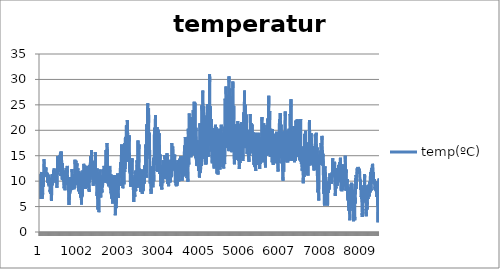
| Category | temp(ºC) |
|---|---|
| 0 | 6.5 |
| 1 | 6.7 |
| 2 | 6.9 |
| 3 | 7.2 |
| 4 | 7.3 |
| 5 | 7.4 |
| 6 | 7.5 |
| 7 | 7.7 |
| 8 | 8 |
| 9 | 8.4 |
| 10 | 9 |
| 11 | 9.5 |
| 12 | 9.8 |
| 13 | 10.3 |
| 14 | 10.5 |
| 15 | 10.8 |
| 16 | 11 |
| 17 | 10.9 |
| 18 | 11 |
| 19 | 10.7 |
| 20 | 10.5 |
| 21 | 10.3 |
| 22 | 10.4 |
| 23 | 11.4 |
| 24 | 10.3 |
| 25 | 10.7 |
| 26 | 11.2 |
| 27 | 11 |
| 28 | 10.6 |
| 29 | 10.7 |
| 30 | 10.8 |
| 31 | 10.9 |
| 32 | 10.8 |
| 33 | 10.8 |
| 34 | 11.6 |
| 35 | 11.6 |
| 36 | 11.6 |
| 37 | 11.8 |
| 38 | 11.9 |
| 39 | 11.9 |
| 40 | 11.1 |
| 41 | 11.4 |
| 42 | 11.4 |
| 43 | 10.6 |
| 44 | 9.6 |
| 45 | 9.7 |
| 46 | 10.5 |
| 47 | 10.6 |
| 48 | 6.7 |
| 49 | 6.6 |
| 50 | 6.8 |
| 51 | 6.5 |
| 52 | 6.5 |
| 53 | 6.5 |
| 54 | 6.5 |
| 55 | 6.8 |
| 56 | 6.9 |
| 57 | 6.9 |
| 58 | 7.2 |
| 59 | 7.4 |
| 60 | 7.5 |
| 61 | 7.6 |
| 62 | 7.5 |
| 63 | 7.3 |
| 64 | 6.9 |
| 65 | 7.6 |
| 66 | 8.1 |
| 67 | 8.6 |
| 68 | 8.9 |
| 69 | 9.1 |
| 70 | 9.6 |
| 71 | 10.5 |
| 72 | 10.3 |
| 73 | 10.6 |
| 74 | 11.1 |
| 75 | 11 |
| 76 | 10.8 |
| 77 | 10.2 |
| 78 | 9.8 |
| 79 | 9.8 |
| 80 | 10.3 |
| 81 | 10 |
| 82 | 8.9 |
| 83 | 9.9 |
| 84 | 9.5 |
| 85 | 9.5 |
| 86 | 9.7 |
| 87 | 10 |
| 88 | 10.5 |
| 89 | 10.8 |
| 90 | 11 |
| 91 | 11.1 |
| 92 | 11.2 |
| 93 | 11.2 |
| 94 | 11.1 |
| 95 | 11.3 |
| 96 | 13.6 |
| 97 | 13.6 |
| 98 | 14.1 |
| 99 | 14.3 |
| 100 | 14.3 |
| 101 | 14.1 |
| 102 | 13.8 |
| 103 | 13.7 |
| 104 | 13.5 |
| 105 | 13.3 |
| 106 | 13.1 |
| 107 | 12.9 |
| 108 | 12.9 |
| 109 | 12.6 |
| 110 | 12.5 |
| 111 | 12.7 |
| 112 | 12.8 |
| 113 | 12.8 |
| 114 | 12.8 |
| 115 | 12.7 |
| 116 | 12.6 |
| 117 | 12.5 |
| 118 | 12.5 |
| 119 | 12.4 |
| 120 | 11.9 |
| 121 | 12.7 |
| 122 | 12.7 |
| 123 | 12.1 |
| 124 | 11.4 |
| 125 | 11.4 |
| 126 | 11.7 |
| 127 | 11.7 |
| 128 | 11.8 |
| 129 | 11.6 |
| 130 | 11.4 |
| 131 | 11.4 |
| 132 | 11.5 |
| 133 | 11.3 |
| 134 | 11.7 |
| 135 | 11.7 |
| 136 | 11.5 |
| 137 | 11.7 |
| 138 | 11.6 |
| 139 | 11.3 |
| 140 | 11.1 |
| 141 | 11.2 |
| 142 | 10.9 |
| 143 | 10.8 |
| 144 | 11.9 |
| 145 | 12.7 |
| 146 | 12.7 |
| 147 | 12.1 |
| 148 | 11.4 |
| 149 | 11.4 |
| 150 | 11.7 |
| 151 | 11.7 |
| 152 | 11.8 |
| 153 | 11.6 |
| 154 | 11.4 |
| 155 | 11.4 |
| 156 | 11.5 |
| 157 | 11.3 |
| 158 | 11.7 |
| 159 | 11.7 |
| 160 | 11.5 |
| 161 | 11.7 |
| 162 | 11.6 |
| 163 | 11.3 |
| 164 | 11 |
| 165 | 11.1 |
| 166 | 10.9 |
| 167 | 10.8 |
| 168 | 11.7 |
| 169 | 11.7 |
| 170 | 11.5 |
| 171 | 11.2 |
| 172 | 10.9 |
| 173 | 11 |
| 174 | 11.1 |
| 175 | 11.3 |
| 176 | 11.5 |
| 177 | 11.5 |
| 178 | 11.5 |
| 179 | 11.5 |
| 180 | 11.4 |
| 181 | 11.4 |
| 182 | 11.4 |
| 183 | 11.4 |
| 184 | 11.2 |
| 185 | 10.9 |
| 186 | 10.7 |
| 187 | 10.3 |
| 188 | 9.9 |
| 189 | 9.8 |
| 190 | 9.7 |
| 191 | 9.8 |
| 192 | 11.4 |
| 193 | 11.5 |
| 194 | 11.2 |
| 195 | 11.3 |
| 196 | 11.1 |
| 197 | 11.2 |
| 198 | 11.1 |
| 199 | 11 |
| 200 | 11.1 |
| 201 | 10.9 |
| 202 | 10.8 |
| 203 | 10.5 |
| 204 | 10.8 |
| 205 | 10.8 |
| 206 | 10.5 |
| 207 | 10.5 |
| 208 | 10.3 |
| 209 | 9.7 |
| 210 | 9.9 |
| 211 | 9.5 |
| 212 | 9.3 |
| 213 | 9.5 |
| 214 | 9.9 |
| 215 | 11.2 |
| 216 | 10.1 |
| 217 | 9.9 |
| 218 | 9.6 |
| 219 | 9.4 |
| 220 | 9.3 |
| 221 | 9.4 |
| 222 | 9.2 |
| 223 | 9.3 |
| 224 | 9.2 |
| 225 | 9 |
| 226 | 9.1 |
| 227 | 9.3 |
| 228 | 9.4 |
| 229 | 9.7 |
| 230 | 9.9 |
| 231 | 9.7 |
| 232 | 9.6 |
| 233 | 9.3 |
| 234 | 9.3 |
| 235 | 9.4 |
| 236 | 10 |
| 237 | 10 |
| 238 | 10.2 |
| 239 | 10.6 |
| 240 | 10.6 |
| 241 | 10.5 |
| 242 | 10 |
| 243 | 9.7 |
| 244 | 9.6 |
| 245 | 9.6 |
| 246 | 9.5 |
| 247 | 8.8 |
| 248 | 8.4 |
| 249 | 8.3 |
| 250 | 8.1 |
| 251 | 8.3 |
| 252 | 7.8 |
| 253 | 8 |
| 254 | 8.1 |
| 255 | 8.2 |
| 256 | 8.1 |
| 257 | 7.8 |
| 258 | 7.5 |
| 259 | 7.7 |
| 260 | 8.1 |
| 261 | 8.3 |
| 262 | 8.6 |
| 263 | 9.2 |
| 264 | 8.7 |
| 265 | 9.1 |
| 266 | 9.4 |
| 267 | 9.6 |
| 268 | 9.4 |
| 269 | 9.1 |
| 270 | 8.9 |
| 271 | 8.6 |
| 272 | 8.3 |
| 273 | 7.8 |
| 274 | 7.7 |
| 275 | 7.9 |
| 276 | 7.8 |
| 277 | 7.7 |
| 278 | 7.3 |
| 279 | 6.8 |
| 280 | 6.5 |
| 281 | 6.3 |
| 282 | 6.2 |
| 283 | 6.1 |
| 284 | 6.1 |
| 285 | 6.2 |
| 286 | 6.2 |
| 287 | 6.6 |
| 288 | 7.5 |
| 289 | 8.2 |
| 290 | 9.5 |
| 291 | 10.3 |
| 292 | 10.7 |
| 293 | 10.6 |
| 294 | 10.5 |
| 295 | 10 |
| 296 | 10.4 |
| 297 | 10.6 |
| 298 | 10.9 |
| 299 | 11.2 |
| 300 | 11.3 |
| 301 | 11.4 |
| 302 | 10.7 |
| 303 | 9.9 |
| 304 | 10.3 |
| 305 | 10.2 |
| 306 | 10.5 |
| 307 | 10.5 |
| 308 | 10.1 |
| 309 | 10.1 |
| 310 | 9.2 |
| 311 | 9.4 |
| 312 | 10.6 |
| 313 | 11 |
| 314 | 10.1 |
| 315 | 10.8 |
| 316 | 11.2 |
| 317 | 10.9 |
| 318 | 10.7 |
| 319 | 10.2 |
| 320 | 10.3 |
| 321 | 10.3 |
| 322 | 10.1 |
| 323 | 10.2 |
| 324 | 9.7 |
| 325 | 9.7 |
| 326 | 10.5 |
| 327 | 10.8 |
| 328 | 10.8 |
| 329 | 10.6 |
| 330 | 10.6 |
| 331 | 10.7 |
| 332 | 10.8 |
| 333 | 11.2 |
| 334 | 11.2 |
| 335 | 12.1 |
| 336 | 10.8 |
| 337 | 10.7 |
| 338 | 11 |
| 339 | 11.3 |
| 340 | 11.5 |
| 341 | 11.8 |
| 342 | 11.8 |
| 343 | 11.9 |
| 344 | 12 |
| 345 | 12 |
| 346 | 12.1 |
| 347 | 12.3 |
| 348 | 12.3 |
| 349 | 12.4 |
| 350 | 12.5 |
| 351 | 12.2 |
| 352 | 12 |
| 353 | 11.7 |
| 354 | 11.4 |
| 355 | 11.2 |
| 356 | 11.1 |
| 357 | 10.9 |
| 358 | 11 |
| 359 | 10.9 |
| 360 | 11.4 |
| 361 | 11.4 |
| 362 | 11 |
| 363 | 10.8 |
| 364 | 10.6 |
| 365 | 10.2 |
| 366 | 10.8 |
| 367 | 10.4 |
| 368 | 10.9 |
| 369 | 10.8 |
| 370 | 10.7 |
| 371 | 10.8 |
| 372 | 10.7 |
| 373 | 10.7 |
| 374 | 10.9 |
| 375 | 11 |
| 376 | 10.9 |
| 377 | 10.9 |
| 378 | 11 |
| 379 | 11 |
| 380 | 11.1 |
| 381 | 11.3 |
| 382 | 11.5 |
| 383 | 11.8 |
| 384 | 10.9 |
| 385 | 11.6 |
| 386 | 12.1 |
| 387 | 12 |
| 388 | 11.9 |
| 389 | 11.2 |
| 390 | 11.6 |
| 391 | 11.5 |
| 392 | 11.3 |
| 393 | 11.1 |
| 394 | 10.9 |
| 395 | 11.1 |
| 396 | 10.9 |
| 397 | 10.6 |
| 398 | 10.7 |
| 399 | 10.5 |
| 400 | 10.3 |
| 401 | 10.4 |
| 402 | 10.6 |
| 403 | 10 |
| 404 | 9.6 |
| 405 | 9.5 |
| 406 | 9.5 |
| 407 | 9.6 |
| 408 | 9.5 |
| 409 | 10.4 |
| 410 | 11 |
| 411 | 11.2 |
| 412 | 10.9 |
| 413 | 10.2 |
| 414 | 9.7 |
| 415 | 9.6 |
| 416 | 9.2 |
| 417 | 8.9 |
| 418 | 8.7 |
| 419 | 8.8 |
| 420 | 9.1 |
| 421 | 9.2 |
| 422 | 9.2 |
| 423 | 9.2 |
| 424 | 9.3 |
| 425 | 10.2 |
| 426 | 11.4 |
| 427 | 11.9 |
| 428 | 11.5 |
| 429 | 11.3 |
| 430 | 11.8 |
| 431 | 12.4 |
| 432 | 13.2 |
| 433 | 14 |
| 434 | 14.7 |
| 435 | 14.9 |
| 436 | 14.7 |
| 437 | 14.5 |
| 438 | 14.5 |
| 439 | 14.4 |
| 440 | 14.5 |
| 441 | 14.4 |
| 442 | 14.3 |
| 443 | 14.2 |
| 444 | 14.1 |
| 445 | 14 |
| 446 | 13.8 |
| 447 | 13.5 |
| 448 | 13.2 |
| 449 | 12.9 |
| 450 | 12.7 |
| 451 | 12.6 |
| 452 | 12.5 |
| 453 | 12.6 |
| 454 | 12.8 |
| 455 | 13 |
| 456 | 12.7 |
| 457 | 13.6 |
| 458 | 14 |
| 459 | 14.3 |
| 460 | 14.2 |
| 461 | 14 |
| 462 | 13.9 |
| 463 | 13.9 |
| 464 | 14 |
| 465 | 14 |
| 466 | 14 |
| 467 | 14 |
| 468 | 14 |
| 469 | 13.9 |
| 470 | 13.9 |
| 471 | 13.8 |
| 472 | 13.9 |
| 473 | 13.9 |
| 474 | 13.9 |
| 475 | 13.9 |
| 476 | 13.7 |
| 477 | 13.3 |
| 478 | 13.2 |
| 479 | 13.4 |
| 480 | 14.3 |
| 481 | 14.8 |
| 482 | 15.1 |
| 483 | 15 |
| 484 | 14.5 |
| 485 | 13.4 |
| 486 | 12.2 |
| 487 | 12.1 |
| 488 | 12.3 |
| 489 | 12.2 |
| 490 | 12.2 |
| 491 | 12.3 |
| 492 | 12.3 |
| 493 | 12.2 |
| 494 | 12 |
| 495 | 11.9 |
| 496 | 11.8 |
| 497 | 11.8 |
| 498 | 11.7 |
| 499 | 11.7 |
| 500 | 11.8 |
| 501 | 12 |
| 502 | 12.2 |
| 503 | 12.5 |
| 504 | 15.2 |
| 505 | 15.8 |
| 506 | 15.9 |
| 507 | 15.6 |
| 508 | 14.9 |
| 509 | 13.9 |
| 510 | 12.8 |
| 511 | 11.9 |
| 512 | 11.4 |
| 513 | 11 |
| 514 | 11.1 |
| 515 | 11.1 |
| 516 | 11.1 |
| 517 | 11.5 |
| 518 | 12.1 |
| 519 | 12.3 |
| 520 | 12.4 |
| 521 | 12.7 |
| 522 | 12.6 |
| 523 | 12.4 |
| 524 | 12.6 |
| 525 | 12.7 |
| 526 | 13 |
| 527 | 13.3 |
| 528 | 14.2 |
| 529 | 14.9 |
| 530 | 15.5 |
| 531 | 15.8 |
| 532 | 15.7 |
| 533 | 15.2 |
| 534 | 14.8 |
| 535 | 14.3 |
| 536 | 13.8 |
| 537 | 13.5 |
| 538 | 13.5 |
| 539 | 13.4 |
| 540 | 13.1 |
| 541 | 12.6 |
| 542 | 12.3 |
| 543 | 12.1 |
| 544 | 11.9 |
| 545 | 11.6 |
| 546 | 11.2 |
| 547 | 10.8 |
| 548 | 10.6 |
| 549 | 10.5 |
| 550 | 10.3 |
| 551 | 10.6 |
| 552 | 12.1 |
| 553 | 12.8 |
| 554 | 13.3 |
| 555 | 13.5 |
| 556 | 13 |
| 557 | 12.5 |
| 558 | 12.3 |
| 559 | 12.4 |
| 560 | 12.4 |
| 561 | 12.5 |
| 562 | 12.4 |
| 563 | 12.1 |
| 564 | 12 |
| 565 | 12 |
| 566 | 11.8 |
| 567 | 11.4 |
| 568 | 11.1 |
| 569 | 10.9 |
| 570 | 10.7 |
| 571 | 10.5 |
| 572 | 10.2 |
| 573 | 10.2 |
| 574 | 10.2 |
| 575 | 10.7 |
| 576 | 11.4 |
| 577 | 11.7 |
| 578 | 11.7 |
| 579 | 11.5 |
| 580 | 11.2 |
| 581 | 10.8 |
| 582 | 10.4 |
| 583 | 10.2 |
| 584 | 10.1 |
| 585 | 10.1 |
| 586 | 9.8 |
| 587 | 9.5 |
| 588 | 9.4 |
| 589 | 9.4 |
| 590 | 9.3 |
| 591 | 9.3 |
| 592 | 9.2 |
| 593 | 9.1 |
| 594 | 9 |
| 595 | 8.8 |
| 596 | 8.6 |
| 597 | 8.6 |
| 598 | 8.6 |
| 599 | 9 |
| 600 | 10.5 |
| 601 | 11.1 |
| 602 | 11.5 |
| 603 | 11.6 |
| 604 | 11.6 |
| 605 | 11 |
| 606 | 10.6 |
| 607 | 10.3 |
| 608 | 10 |
| 609 | 9.9 |
| 610 | 9.6 |
| 611 | 9.5 |
| 612 | 9.4 |
| 613 | 9.4 |
| 614 | 9.3 |
| 615 | 9 |
| 616 | 8.8 |
| 617 | 8.7 |
| 618 | 8.6 |
| 619 | 8.4 |
| 620 | 8.2 |
| 621 | 8.3 |
| 622 | 8.6 |
| 623 | 9 |
| 624 | 10.3 |
| 625 | 11.1 |
| 626 | 11.7 |
| 627 | 12.1 |
| 628 | 12.2 |
| 629 | 12.1 |
| 630 | 11.4 |
| 631 | 10.9 |
| 632 | 10.7 |
| 633 | 10.6 |
| 634 | 10.9 |
| 635 | 11.2 |
| 636 | 11.1 |
| 637 | 10.8 |
| 638 | 10.5 |
| 639 | 10.3 |
| 640 | 10.2 |
| 641 | 10.3 |
| 642 | 10.3 |
| 643 | 10.2 |
| 644 | 10 |
| 645 | 9.9 |
| 646 | 10.1 |
| 647 | 10.7 |
| 648 | 12 |
| 649 | 12.1 |
| 650 | 12.4 |
| 651 | 12.6 |
| 652 | 12.7 |
| 653 | 12 |
| 654 | 11.4 |
| 655 | 11.4 |
| 656 | 10.9 |
| 657 | 10.8 |
| 658 | 11.1 |
| 659 | 11.7 |
| 660 | 12.2 |
| 661 | 11.3 |
| 662 | 11.1 |
| 663 | 11.6 |
| 664 | 11.9 |
| 665 | 11.8 |
| 666 | 11.9 |
| 667 | 12.1 |
| 668 | 12.1 |
| 669 | 11.7 |
| 670 | 11.6 |
| 671 | 11.7 |
| 672 | 11.8 |
| 673 | 12.3 |
| 674 | 12.8 |
| 675 | 13 |
| 676 | 12.6 |
| 677 | 11.9 |
| 678 | 11.1 |
| 679 | 10.2 |
| 680 | 9.7 |
| 681 | 9.3 |
| 682 | 9.5 |
| 683 | 10.1 |
| 684 | 10.3 |
| 685 | 10 |
| 686 | 9.6 |
| 687 | 9.3 |
| 688 | 9.2 |
| 689 | 9.2 |
| 690 | 9.2 |
| 691 | 9.3 |
| 692 | 9.4 |
| 693 | 9.4 |
| 694 | 9.4 |
| 695 | 10 |
| 696 | 9.6 |
| 697 | 10.4 |
| 698 | 10.8 |
| 699 | 10.8 |
| 700 | 10.7 |
| 701 | 10.2 |
| 702 | 9.3 |
| 703 | 8.8 |
| 704 | 8.4 |
| 705 | 8.2 |
| 706 | 8.3 |
| 707 | 8.2 |
| 708 | 8.1 |
| 709 | 7.9 |
| 710 | 7.6 |
| 711 | 7.7 |
| 712 | 7.4 |
| 713 | 7 |
| 714 | 6.6 |
| 715 | 6.2 |
| 716 | 5.9 |
| 717 | 5.5 |
| 718 | 5.3 |
| 719 | 6.8 |
| 720 | 9.2 |
| 721 | 9.4 |
| 722 | 9.1 |
| 723 | 8.3 |
| 724 | 8.3 |
| 725 | 7.9 |
| 726 | 7.1 |
| 727 | 6.7 |
| 728 | 6.4 |
| 729 | 6.4 |
| 730 | 6.3 |
| 731 | 6.3 |
| 732 | 6.5 |
| 733 | 7.1 |
| 734 | 7.8 |
| 735 | 7.9 |
| 736 | 7.8 |
| 737 | 7.6 |
| 738 | 7.7 |
| 739 | 7.7 |
| 740 | 8.3 |
| 741 | 8.2 |
| 742 | 7.9 |
| 743 | 8.8 |
| 744 | 9.7 |
| 745 | 9.9 |
| 746 | 10.1 |
| 747 | 10.4 |
| 748 | 10 |
| 749 | 8.9 |
| 750 | 8.9 |
| 751 | 9.1 |
| 752 | 9 |
| 753 | 9.4 |
| 754 | 9.2 |
| 755 | 9 |
| 756 | 8.6 |
| 757 | 8.6 |
| 758 | 8.7 |
| 759 | 8.4 |
| 760 | 8.8 |
| 761 | 8.7 |
| 762 | 8.6 |
| 763 | 8.7 |
| 764 | 8.2 |
| 765 | 8.1 |
| 766 | 8.6 |
| 767 | 9.2 |
| 768 | 9.8 |
| 769 | 10.5 |
| 770 | 10.8 |
| 771 | 10.8 |
| 772 | 10.5 |
| 773 | 10 |
| 774 | 9.2 |
| 775 | 8.7 |
| 776 | 8.3 |
| 777 | 8.4 |
| 778 | 8.5 |
| 779 | 8.4 |
| 780 | 8.3 |
| 781 | 8.3 |
| 782 | 8.6 |
| 783 | 8.7 |
| 784 | 8.3 |
| 785 | 8.4 |
| 786 | 8.6 |
| 787 | 8.5 |
| 788 | 9 |
| 789 | 9 |
| 790 | 9.4 |
| 791 | 10 |
| 792 | 12.4 |
| 793 | 12.4 |
| 794 | 12.4 |
| 795 | 12.3 |
| 796 | 11.7 |
| 797 | 11.2 |
| 798 | 10.9 |
| 799 | 10.9 |
| 800 | 10.9 |
| 801 | 10.7 |
| 802 | 10.4 |
| 803 | 9.5 |
| 804 | 9.8 |
| 805 | 9.8 |
| 806 | 9.6 |
| 807 | 9.7 |
| 808 | 10.2 |
| 809 | 10.2 |
| 810 | 10.2 |
| 811 | 10.1 |
| 812 | 10.1 |
| 813 | 10.3 |
| 814 | 10.5 |
| 815 | 10.8 |
| 816 | 10.9 |
| 817 | 11.2 |
| 818 | 11.2 |
| 819 | 11.4 |
| 820 | 11.4 |
| 821 | 10.8 |
| 822 | 10.6 |
| 823 | 10.5 |
| 824 | 10 |
| 825 | 10.3 |
| 826 | 10.1 |
| 827 | 10.4 |
| 828 | 10.2 |
| 829 | 10.1 |
| 830 | 9.9 |
| 831 | 9.8 |
| 832 | 10.1 |
| 833 | 10.4 |
| 834 | 10 |
| 835 | 9.7 |
| 836 | 9.2 |
| 837 | 9.2 |
| 838 | 9.5 |
| 839 | 9.6 |
| 840 | 9.9 |
| 841 | 9.5 |
| 842 | 8.7 |
| 843 | 8.4 |
| 844 | 8.8 |
| 845 | 9.3 |
| 846 | 9.7 |
| 847 | 9.8 |
| 848 | 9.7 |
| 849 | 9.8 |
| 850 | 9.6 |
| 851 | 9.4 |
| 852 | 9.3 |
| 853 | 9.5 |
| 854 | 9.4 |
| 855 | 9.4 |
| 856 | 9.3 |
| 857 | 9 |
| 858 | 8.9 |
| 859 | 8.7 |
| 860 | 8.6 |
| 861 | 8.8 |
| 862 | 9.2 |
| 863 | 10 |
| 864 | 11.8 |
| 865 | 12.5 |
| 866 | 13.3 |
| 867 | 14 |
| 868 | 14.2 |
| 869 | 14.1 |
| 870 | 13.3 |
| 871 | 12.6 |
| 872 | 12.1 |
| 873 | 11.8 |
| 874 | 11.9 |
| 875 | 11.9 |
| 876 | 11.6 |
| 877 | 11.2 |
| 878 | 10.9 |
| 879 | 10.6 |
| 880 | 10.3 |
| 881 | 10.2 |
| 882 | 10 |
| 883 | 9.8 |
| 884 | 9.6 |
| 885 | 9.6 |
| 886 | 10 |
| 887 | 11.2 |
| 888 | 11.8 |
| 889 | 12.5 |
| 890 | 13 |
| 891 | 13.6 |
| 892 | 14 |
| 893 | 13.7 |
| 894 | 12.8 |
| 895 | 12.3 |
| 896 | 12.2 |
| 897 | 12.2 |
| 898 | 12.1 |
| 899 | 11.7 |
| 900 | 11.2 |
| 901 | 11 |
| 902 | 10.9 |
| 903 | 10.7 |
| 904 | 10.5 |
| 905 | 10.2 |
| 906 | 10 |
| 907 | 9.8 |
| 908 | 9.7 |
| 909 | 9.7 |
| 910 | 9.9 |
| 911 | 10.8 |
| 912 | 12.5 |
| 913 | 13.1 |
| 914 | 13.3 |
| 915 | 13.5 |
| 916 | 13.5 |
| 917 | 12.9 |
| 918 | 12.2 |
| 919 | 11.8 |
| 920 | 11.8 |
| 921 | 11.8 |
| 922 | 11.6 |
| 923 | 11.4 |
| 924 | 11.1 |
| 925 | 11 |
| 926 | 11.1 |
| 927 | 11.1 |
| 928 | 11.1 |
| 929 | 10.8 |
| 930 | 10.3 |
| 931 | 9.8 |
| 932 | 9.4 |
| 933 | 9.2 |
| 934 | 9.9 |
| 935 | 10.8 |
| 936 | 10.9 |
| 937 | 11.8 |
| 938 | 12.5 |
| 939 | 12.6 |
| 940 | 12.5 |
| 941 | 12.2 |
| 942 | 11.7 |
| 943 | 11.6 |
| 944 | 11.3 |
| 945 | 10.9 |
| 946 | 10.7 |
| 947 | 10.5 |
| 948 | 10.2 |
| 949 | 9.8 |
| 950 | 9.6 |
| 951 | 9.5 |
| 952 | 9.3 |
| 953 | 8.9 |
| 954 | 8.6 |
| 955 | 8.3 |
| 956 | 8 |
| 957 | 8 |
| 958 | 8.6 |
| 959 | 9.4 |
| 960 | 10.1 |
| 961 | 10.9 |
| 962 | 11.5 |
| 963 | 12 |
| 964 | 12 |
| 965 | 11.8 |
| 966 | 11 |
| 967 | 10.4 |
| 968 | 10.1 |
| 969 | 10.2 |
| 970 | 9.8 |
| 971 | 9.4 |
| 972 | 9.2 |
| 973 | 9 |
| 974 | 8.7 |
| 975 | 8.4 |
| 976 | 8.1 |
| 977 | 8 |
| 978 | 7.9 |
| 979 | 7.8 |
| 980 | 7.5 |
| 981 | 7.4 |
| 982 | 7.7 |
| 983 | 8.2 |
| 984 | 9.6 |
| 985 | 10.2 |
| 986 | 10.6 |
| 987 | 11.2 |
| 988 | 11.3 |
| 989 | 11.1 |
| 990 | 10.6 |
| 991 | 10.3 |
| 992 | 10.3 |
| 993 | 10.2 |
| 994 | 10.1 |
| 995 | 10 |
| 996 | 9.7 |
| 997 | 9.5 |
| 998 | 9.2 |
| 999 | 9 |
| 1000 | 8.6 |
| 1001 | 8 |
| 1002 | 7.4 |
| 1003 | 7.1 |
| 1004 | 6.8 |
| 1005 | 6.8 |
| 1006 | 7.5 |
| 1007 | 8.5 |
| 1008 | 9.6 |
| 1009 | 10.2 |
| 1010 | 10.9 |
| 1011 | 11.5 |
| 1012 | 11.7 |
| 1013 | 11.5 |
| 1014 | 10.9 |
| 1015 | 10.1 |
| 1016 | 9.7 |
| 1017 | 9.2 |
| 1018 | 8.9 |
| 1019 | 8.6 |
| 1020 | 8.2 |
| 1021 | 7.8 |
| 1022 | 7.5 |
| 1023 | 7 |
| 1024 | 6.5 |
| 1025 | 6.2 |
| 1026 | 5.9 |
| 1027 | 5.7 |
| 1028 | 5.4 |
| 1029 | 5.5 |
| 1030 | 6.1 |
| 1031 | 6.8 |
| 1032 | 8.4 |
| 1033 | 9.2 |
| 1034 | 9.9 |
| 1035 | 10.5 |
| 1036 | 10.8 |
| 1037 | 10.4 |
| 1038 | 9.5 |
| 1039 | 9 |
| 1040 | 8.7 |
| 1041 | 8.4 |
| 1042 | 8.2 |
| 1043 | 7.9 |
| 1044 | 7.6 |
| 1045 | 7.6 |
| 1046 | 7.4 |
| 1047 | 7.3 |
| 1048 | 7 |
| 1049 | 6.9 |
| 1050 | 7 |
| 1051 | 7 |
| 1052 | 6.9 |
| 1053 | 7 |
| 1054 | 7.6 |
| 1055 | 8.8 |
| 1056 | 9.5 |
| 1057 | 10.2 |
| 1058 | 10.9 |
| 1059 | 11.7 |
| 1060 | 12.1 |
| 1061 | 12.1 |
| 1062 | 11.7 |
| 1063 | 11.3 |
| 1064 | 11.5 |
| 1065 | 10.8 |
| 1066 | 10.2 |
| 1067 | 10.1 |
| 1068 | 10.1 |
| 1069 | 9.9 |
| 1070 | 9.6 |
| 1071 | 9.4 |
| 1072 | 9.2 |
| 1073 | 9 |
| 1074 | 8.9 |
| 1075 | 8.8 |
| 1076 | 8.7 |
| 1077 | 8.8 |
| 1078 | 9.1 |
| 1079 | 9.7 |
| 1080 | 11.2 |
| 1081 | 12 |
| 1082 | 12.6 |
| 1083 | 13.1 |
| 1084 | 13.4 |
| 1085 | 13.5 |
| 1086 | 13.2 |
| 1087 | 12.4 |
| 1088 | 12 |
| 1089 | 12.1 |
| 1090 | 11.6 |
| 1091 | 11 |
| 1092 | 10.8 |
| 1093 | 10.4 |
| 1094 | 10.1 |
| 1095 | 10 |
| 1096 | 9.9 |
| 1097 | 9.7 |
| 1098 | 9.6 |
| 1099 | 9.3 |
| 1100 | 9 |
| 1101 | 9 |
| 1102 | 9.1 |
| 1103 | 9.7 |
| 1104 | 11.1 |
| 1105 | 11.8 |
| 1106 | 12.4 |
| 1107 | 13.1 |
| 1108 | 13.2 |
| 1109 | 12.6 |
| 1110 | 12.3 |
| 1111 | 12 |
| 1112 | 11.8 |
| 1113 | 11.5 |
| 1114 | 11.5 |
| 1115 | 11.3 |
| 1116 | 11 |
| 1117 | 10.7 |
| 1118 | 10.5 |
| 1119 | 10.4 |
| 1120 | 10.1 |
| 1121 | 9.7 |
| 1122 | 9.4 |
| 1123 | 9 |
| 1124 | 8.5 |
| 1125 | 8.4 |
| 1126 | 8.6 |
| 1127 | 9 |
| 1128 | 8.6 |
| 1129 | 8.9 |
| 1130 | 10.1 |
| 1131 | 10.5 |
| 1132 | 10.5 |
| 1133 | 9.8 |
| 1134 | 9.4 |
| 1135 | 9.3 |
| 1136 | 9.2 |
| 1137 | 9.1 |
| 1138 | 9.2 |
| 1139 | 9.1 |
| 1140 | 9.1 |
| 1141 | 9 |
| 1142 | 9.1 |
| 1143 | 9.1 |
| 1144 | 9.2 |
| 1145 | 9.2 |
| 1146 | 9.3 |
| 1147 | 9.7 |
| 1148 | 9.8 |
| 1149 | 9.7 |
| 1150 | 9.7 |
| 1151 | 10.1 |
| 1152 | 11.1 |
| 1153 | 11.8 |
| 1154 | 12.8 |
| 1155 | 13 |
| 1156 | 12.9 |
| 1157 | 12.2 |
| 1158 | 11.7 |
| 1159 | 10.8 |
| 1160 | 10.8 |
| 1161 | 11.1 |
| 1162 | 10.8 |
| 1163 | 10.8 |
| 1164 | 10.7 |
| 1165 | 10.8 |
| 1166 | 10.5 |
| 1167 | 10.5 |
| 1168 | 10.4 |
| 1169 | 10.7 |
| 1170 | 10.6 |
| 1171 | 10.4 |
| 1172 | 10.1 |
| 1173 | 9.9 |
| 1174 | 10.2 |
| 1175 | 10.5 |
| 1176 | 10 |
| 1177 | 10.5 |
| 1178 | 10.7 |
| 1179 | 11 |
| 1180 | 11.2 |
| 1181 | 11.4 |
| 1182 | 11.2 |
| 1183 | 10.9 |
| 1184 | 10.7 |
| 1185 | 10.4 |
| 1186 | 10.6 |
| 1187 | 10.8 |
| 1188 | 10.5 |
| 1189 | 10.4 |
| 1190 | 9.8 |
| 1191 | 9.6 |
| 1192 | 9.4 |
| 1193 | 9.5 |
| 1194 | 9.7 |
| 1195 | 9.7 |
| 1196 | 9.5 |
| 1197 | 9.3 |
| 1198 | 9.5 |
| 1199 | 10.1 |
| 1200 | 8.8 |
| 1201 | 8.9 |
| 1202 | 9 |
| 1203 | 9 |
| 1204 | 9.1 |
| 1205 | 9.1 |
| 1206 | 9.2 |
| 1207 | 9.1 |
| 1208 | 9.2 |
| 1209 | 9.1 |
| 1210 | 8.7 |
| 1211 | 8.4 |
| 1212 | 8.2 |
| 1213 | 8.2 |
| 1214 | 8.3 |
| 1215 | 8.3 |
| 1216 | 8.4 |
| 1217 | 8.1 |
| 1218 | 7.9 |
| 1219 | 7.9 |
| 1220 | 8 |
| 1221 | 8.1 |
| 1222 | 8.3 |
| 1223 | 8.3 |
| 1224 | 11.1 |
| 1225 | 11.2 |
| 1226 | 12.3 |
| 1227 | 12.9 |
| 1228 | 13.2 |
| 1229 | 13.3 |
| 1230 | 13.3 |
| 1231 | 12.6 |
| 1232 | 11.8 |
| 1233 | 12.1 |
| 1234 | 11.8 |
| 1235 | 12.2 |
| 1236 | 11.9 |
| 1237 | 12 |
| 1238 | 12.1 |
| 1239 | 11.8 |
| 1240 | 11.9 |
| 1241 | 12.1 |
| 1242 | 12.1 |
| 1243 | 12 |
| 1244 | 11.9 |
| 1245 | 11.8 |
| 1246 | 11.7 |
| 1247 | 12.8 |
| 1248 | 13.9 |
| 1249 | 14.4 |
| 1250 | 14.9 |
| 1251 | 14.6 |
| 1252 | 13.8 |
| 1253 | 12.7 |
| 1254 | 11.8 |
| 1255 | 11.2 |
| 1256 | 11 |
| 1257 | 11.2 |
| 1258 | 11.2 |
| 1259 | 10.8 |
| 1260 | 10.7 |
| 1261 | 10.8 |
| 1262 | 11.3 |
| 1263 | 11.5 |
| 1264 | 11.2 |
| 1265 | 11 |
| 1266 | 11 |
| 1267 | 10.9 |
| 1268 | 11.1 |
| 1269 | 11.1 |
| 1270 | 11.7 |
| 1271 | 12.3 |
| 1272 | 14.6 |
| 1273 | 15.3 |
| 1274 | 15.9 |
| 1275 | 16.1 |
| 1276 | 16.2 |
| 1277 | 15.1 |
| 1278 | 12.7 |
| 1279 | 11.7 |
| 1280 | 11.3 |
| 1281 | 10.8 |
| 1282 | 10.8 |
| 1283 | 11.2 |
| 1284 | 11.3 |
| 1285 | 11.4 |
| 1286 | 11.5 |
| 1287 | 11.4 |
| 1288 | 11.6 |
| 1289 | 11.7 |
| 1290 | 11.9 |
| 1291 | 11.7 |
| 1292 | 11.7 |
| 1293 | 12.1 |
| 1294 | 12.6 |
| 1295 | 13.6 |
| 1296 | 10.9 |
| 1297 | 11.2 |
| 1298 | 11.7 |
| 1299 | 11.8 |
| 1300 | 12.1 |
| 1301 | 12.1 |
| 1302 | 11.7 |
| 1303 | 11.2 |
| 1304 | 10.9 |
| 1305 | 10.8 |
| 1306 | 10.6 |
| 1307 | 10.5 |
| 1308 | 10.5 |
| 1309 | 10.3 |
| 1310 | 10.4 |
| 1311 | 10.3 |
| 1312 | 11 |
| 1313 | 10.6 |
| 1314 | 9.8 |
| 1315 | 9.6 |
| 1316 | 9.3 |
| 1317 | 9.2 |
| 1318 | 9.1 |
| 1319 | 9.4 |
| 1320 | 11.8 |
| 1321 | 12.6 |
| 1322 | 12.7 |
| 1323 | 12.5 |
| 1324 | 12.7 |
| 1325 | 12.1 |
| 1326 | 11.3 |
| 1327 | 11.1 |
| 1328 | 10.9 |
| 1329 | 10.5 |
| 1330 | 10.4 |
| 1331 | 10 |
| 1332 | 9.7 |
| 1333 | 9.6 |
| 1334 | 9.7 |
| 1335 | 9.8 |
| 1336 | 9.9 |
| 1337 | 10.1 |
| 1338 | 10.2 |
| 1339 | 10.2 |
| 1340 | 10 |
| 1341 | 9.9 |
| 1342 | 10.5 |
| 1343 | 11.5 |
| 1344 | 12.6 |
| 1345 | 13 |
| 1346 | 13.5 |
| 1347 | 14 |
| 1348 | 14.1 |
| 1349 | 13 |
| 1350 | 11.8 |
| 1351 | 11.1 |
| 1352 | 11 |
| 1353 | 10.8 |
| 1354 | 10.5 |
| 1355 | 10.3 |
| 1356 | 10.2 |
| 1357 | 10.1 |
| 1358 | 9.8 |
| 1359 | 9.6 |
| 1360 | 9.6 |
| 1361 | 9.8 |
| 1362 | 10.1 |
| 1363 | 10.4 |
| 1364 | 10.1 |
| 1365 | 10 |
| 1366 | 11.1 |
| 1367 | 13.1 |
| 1368 | 14.9 |
| 1369 | 15.4 |
| 1370 | 15.7 |
| 1371 | 15.8 |
| 1372 | 15.4 |
| 1373 | 14.1 |
| 1374 | 12.3 |
| 1375 | 11.2 |
| 1376 | 10.8 |
| 1377 | 10.7 |
| 1378 | 10.9 |
| 1379 | 11.5 |
| 1380 | 12.3 |
| 1381 | 12.2 |
| 1382 | 11.7 |
| 1383 | 11.4 |
| 1384 | 11.4 |
| 1385 | 11.4 |
| 1386 | 10.9 |
| 1387 | 10.2 |
| 1388 | 9.6 |
| 1389 | 9.4 |
| 1390 | 9.9 |
| 1391 | 11 |
| 1392 | 11.1 |
| 1393 | 11.8 |
| 1394 | 12.4 |
| 1395 | 12.5 |
| 1396 | 12.3 |
| 1397 | 12.3 |
| 1398 | 11.9 |
| 1399 | 11.6 |
| 1400 | 11.2 |
| 1401 | 10.7 |
| 1402 | 10.2 |
| 1403 | 9.9 |
| 1404 | 9.7 |
| 1405 | 9.5 |
| 1406 | 9.3 |
| 1407 | 9.4 |
| 1408 | 9.3 |
| 1409 | 8.9 |
| 1410 | 8.1 |
| 1411 | 7.3 |
| 1412 | 7.1 |
| 1413 | 7.9 |
| 1414 | 8.9 |
| 1415 | 9.3 |
| 1416 | 11.3 |
| 1417 | 11.8 |
| 1418 | 12.2 |
| 1419 | 12.5 |
| 1420 | 12.4 |
| 1421 | 12 |
| 1422 | 10.9 |
| 1423 | 9.4 |
| 1424 | 8.1 |
| 1425 | 7.3 |
| 1426 | 6.8 |
| 1427 | 6.5 |
| 1428 | 6.3 |
| 1429 | 6 |
| 1430 | 5.7 |
| 1431 | 5.3 |
| 1432 | 5 |
| 1433 | 4.8 |
| 1434 | 4.4 |
| 1435 | 4.3 |
| 1436 | 4.5 |
| 1437 | 5 |
| 1438 | 5.8 |
| 1439 | 6.6 |
| 1440 | 7.7 |
| 1441 | 8.7 |
| 1442 | 9.5 |
| 1443 | 9.8 |
| 1444 | 9.9 |
| 1445 | 9.6 |
| 1446 | 8.9 |
| 1447 | 8.1 |
| 1448 | 7.6 |
| 1449 | 7.3 |
| 1450 | 7 |
| 1451 | 6.7 |
| 1452 | 6.3 |
| 1453 | 5.9 |
| 1454 | 5.3 |
| 1455 | 4.8 |
| 1456 | 4.4 |
| 1457 | 4.1 |
| 1458 | 3.9 |
| 1459 | 3.9 |
| 1460 | 3.8 |
| 1461 | 4.1 |
| 1462 | 4.8 |
| 1463 | 5.6 |
| 1464 | 7.1 |
| 1465 | 8.3 |
| 1466 | 9.4 |
| 1467 | 10.3 |
| 1468 | 10.7 |
| 1469 | 10.4 |
| 1470 | 9.5 |
| 1471 | 9.3 |
| 1472 | 8.6 |
| 1473 | 8.1 |
| 1474 | 8 |
| 1475 | 8.5 |
| 1476 | 8.7 |
| 1477 | 8.7 |
| 1478 | 8.3 |
| 1479 | 7.9 |
| 1480 | 7.8 |
| 1481 | 7.9 |
| 1482 | 8.1 |
| 1483 | 8.4 |
| 1484 | 8.3 |
| 1485 | 8 |
| 1486 | 8.8 |
| 1487 | 10 |
| 1488 | 11.3 |
| 1489 | 12 |
| 1490 | 12.3 |
| 1491 | 12 |
| 1492 | 11.3 |
| 1493 | 10.7 |
| 1494 | 9.8 |
| 1495 | 9.3 |
| 1496 | 9.1 |
| 1497 | 9 |
| 1498 | 8.6 |
| 1499 | 8.3 |
| 1500 | 8.1 |
| 1501 | 7.9 |
| 1502 | 7.5 |
| 1503 | 7.3 |
| 1504 | 7.1 |
| 1505 | 7.1 |
| 1506 | 6.8 |
| 1507 | 7.4 |
| 1508 | 7.4 |
| 1509 | 7.4 |
| 1510 | 7.7 |
| 1511 | 9.3 |
| 1512 | 10.7 |
| 1513 | 10.8 |
| 1514 | 11.1 |
| 1515 | 10.6 |
| 1516 | 10.7 |
| 1517 | 9.5 |
| 1518 | 9.3 |
| 1519 | 9.1 |
| 1520 | 8.7 |
| 1521 | 8.4 |
| 1522 | 8.6 |
| 1523 | 8.5 |
| 1524 | 8.6 |
| 1525 | 8.4 |
| 1526 | 8.2 |
| 1527 | 8.3 |
| 1528 | 8.4 |
| 1529 | 7.8 |
| 1530 | 7.9 |
| 1531 | 8.1 |
| 1532 | 7.8 |
| 1533 | 8 |
| 1534 | 9.4 |
| 1535 | 10.4 |
| 1536 | 10.3 |
| 1537 | 9.5 |
| 1538 | 9.4 |
| 1539 | 9.8 |
| 1540 | 10.2 |
| 1541 | 9.8 |
| 1542 | 9.4 |
| 1543 | 9.1 |
| 1544 | 8.9 |
| 1545 | 9.1 |
| 1546 | 9.3 |
| 1547 | 8.8 |
| 1548 | 9.1 |
| 1549 | 8.9 |
| 1550 | 9 |
| 1551 | 9.1 |
| 1552 | 9.4 |
| 1553 | 9.3 |
| 1554 | 9.6 |
| 1555 | 9.6 |
| 1556 | 9.6 |
| 1557 | 9.6 |
| 1558 | 9.6 |
| 1559 | 10 |
| 1560 | 10.4 |
| 1561 | 10.9 |
| 1562 | 11.4 |
| 1563 | 12 |
| 1564 | 12.2 |
| 1565 | 11.9 |
| 1566 | 11.8 |
| 1567 | 11.7 |
| 1568 | 11.8 |
| 1569 | 11.9 |
| 1570 | 12 |
| 1571 | 12.1 |
| 1572 | 12.1 |
| 1573 | 12.2 |
| 1574 | 12.2 |
| 1575 | 12.3 |
| 1576 | 12.2 |
| 1577 | 12.2 |
| 1578 | 12.1 |
| 1579 | 12.1 |
| 1580 | 12.1 |
| 1581 | 12.2 |
| 1582 | 12.2 |
| 1583 | 12.3 |
| 1584 | 12.7 |
| 1585 | 12.8 |
| 1586 | 13 |
| 1587 | 12.9 |
| 1588 | 12.8 |
| 1589 | 12.6 |
| 1590 | 12.4 |
| 1591 | 12.4 |
| 1592 | 12.4 |
| 1593 | 12.4 |
| 1594 | 12.4 |
| 1595 | 12.3 |
| 1596 | 12.5 |
| 1597 | 12.5 |
| 1598 | 12.5 |
| 1599 | 12.6 |
| 1600 | 12.5 |
| 1601 | 12.2 |
| 1602 | 12.2 |
| 1603 | 12.1 |
| 1604 | 11.8 |
| 1605 | 11.5 |
| 1606 | 11.4 |
| 1607 | 12.1 |
| 1608 | 11.9 |
| 1609 | 12.7 |
| 1610 | 13 |
| 1611 | 12.8 |
| 1612 | 12.5 |
| 1613 | 12.2 |
| 1614 | 11.6 |
| 1615 | 10.8 |
| 1616 | 10.3 |
| 1617 | 10 |
| 1618 | 9.7 |
| 1619 | 9.6 |
| 1620 | 9.7 |
| 1621 | 9.6 |
| 1622 | 9.6 |
| 1623 | 9.8 |
| 1624 | 10 |
| 1625 | 10.4 |
| 1626 | 10.8 |
| 1627 | 11.3 |
| 1628 | 11.9 |
| 1629 | 11.9 |
| 1630 | 12.3 |
| 1631 | 12.8 |
| 1632 | 14.2 |
| 1633 | 15 |
| 1634 | 15.7 |
| 1635 | 16.1 |
| 1636 | 16.2 |
| 1637 | 15.9 |
| 1638 | 13.8 |
| 1639 | 12.8 |
| 1640 | 13.2 |
| 1641 | 14 |
| 1642 | 14.9 |
| 1643 | 15.6 |
| 1644 | 16 |
| 1645 | 16 |
| 1646 | 15.9 |
| 1647 | 15.7 |
| 1648 | 15.5 |
| 1649 | 15.1 |
| 1650 | 14.9 |
| 1651 | 14.8 |
| 1652 | 14.5 |
| 1653 | 14.2 |
| 1654 | 14.3 |
| 1655 | 14.6 |
| 1656 | 15 |
| 1657 | 15.9 |
| 1658 | 16.8 |
| 1659 | 17.5 |
| 1660 | 17.5 |
| 1661 | 17.3 |
| 1662 | 17.4 |
| 1663 | 16.6 |
| 1664 | 15.6 |
| 1665 | 15.7 |
| 1666 | 16.1 |
| 1667 | 16.3 |
| 1668 | 16 |
| 1669 | 15.6 |
| 1670 | 14.7 |
| 1671 | 13.8 |
| 1672 | 13.1 |
| 1673 | 12.5 |
| 1674 | 12.1 |
| 1675 | 11.7 |
| 1676 | 11.2 |
| 1677 | 10.8 |
| 1678 | 11.2 |
| 1679 | 12.2 |
| 1680 | 11 |
| 1681 | 11.1 |
| 1682 | 11 |
| 1683 | 10.4 |
| 1684 | 10.2 |
| 1685 | 10 |
| 1686 | 10.1 |
| 1687 | 9.8 |
| 1688 | 9.7 |
| 1689 | 9.7 |
| 1690 | 9.4 |
| 1691 | 9.5 |
| 1692 | 9.4 |
| 1693 | 9.6 |
| 1694 | 9.6 |
| 1695 | 9.8 |
| 1696 | 9.6 |
| 1697 | 9.5 |
| 1698 | 9.2 |
| 1699 | 9 |
| 1700 | 9.6 |
| 1701 | 9.9 |
| 1702 | 10.5 |
| 1703 | 10.8 |
| 1704 | 11.5 |
| 1705 | 12 |
| 1706 | 12.3 |
| 1707 | 11.8 |
| 1708 | 11.5 |
| 1709 | 11 |
| 1710 | 10.6 |
| 1711 | 10.3 |
| 1712 | 10.2 |
| 1713 | 10.3 |
| 1714 | 10.3 |
| 1715 | 10.3 |
| 1716 | 10.2 |
| 1717 | 10.1 |
| 1718 | 10.1 |
| 1719 | 10.1 |
| 1720 | 10.2 |
| 1721 | 10.1 |
| 1722 | 10.1 |
| 1723 | 10.3 |
| 1724 | 10.3 |
| 1725 | 10.2 |
| 1726 | 10.6 |
| 1727 | 11.1 |
| 1728 | 11.6 |
| 1729 | 12.8 |
| 1730 | 13 |
| 1731 | 11.9 |
| 1732 | 11.6 |
| 1733 | 11 |
| 1734 | 10.4 |
| 1735 | 10.2 |
| 1736 | 9.7 |
| 1737 | 9.4 |
| 1738 | 9.3 |
| 1739 | 9.3 |
| 1740 | 8.8 |
| 1741 | 9 |
| 1742 | 9.1 |
| 1743 | 9 |
| 1744 | 8.6 |
| 1745 | 8.6 |
| 1746 | 8.6 |
| 1747 | 8.3 |
| 1748 | 8.5 |
| 1749 | 9.3 |
| 1750 | 9.8 |
| 1751 | 9.2 |
| 1752 | 11.4 |
| 1753 | 11.3 |
| 1754 | 9.2 |
| 1755 | 10.3 |
| 1756 | 10.2 |
| 1757 | 9.9 |
| 1758 | 9.4 |
| 1759 | 8.8 |
| 1760 | 8.2 |
| 1761 | 7.6 |
| 1762 | 7.5 |
| 1763 | 8.4 |
| 1764 | 8.1 |
| 1765 | 7.7 |
| 1766 | 7.5 |
| 1767 | 7.5 |
| 1768 | 7.5 |
| 1769 | 7.3 |
| 1770 | 7.1 |
| 1771 | 7 |
| 1772 | 7.2 |
| 1773 | 7.3 |
| 1774 | 7 |
| 1775 | 7.7 |
| 1776 | 6.6 |
| 1777 | 7.2 |
| 1778 | 7.5 |
| 1779 | 7.6 |
| 1780 | 7.8 |
| 1781 | 7.7 |
| 1782 | 7.5 |
| 1783 | 7.5 |
| 1784 | 7.6 |
| 1785 | 7.5 |
| 1786 | 7.6 |
| 1787 | 7.6 |
| 1788 | 7.6 |
| 1789 | 7.7 |
| 1790 | 7.7 |
| 1791 | 7.5 |
| 1792 | 7 |
| 1793 | 6.3 |
| 1794 | 6.2 |
| 1795 | 5.8 |
| 1796 | 5.6 |
| 1797 | 5.7 |
| 1798 | 6.3 |
| 1799 | 7.9 |
| 1800 | 8.8 |
| 1801 | 10.1 |
| 1802 | 10.9 |
| 1803 | 11.1 |
| 1804 | 10.9 |
| 1805 | 10.5 |
| 1806 | 9.8 |
| 1807 | 8.7 |
| 1808 | 7.9 |
| 1809 | 7.6 |
| 1810 | 7.8 |
| 1811 | 7.7 |
| 1812 | 7 |
| 1813 | 5.9 |
| 1814 | 6.5 |
| 1815 | 7.1 |
| 1816 | 7.2 |
| 1817 | 6.7 |
| 1818 | 6.6 |
| 1819 | 7.1 |
| 1820 | 6.3 |
| 1821 | 6 |
| 1822 | 7.1 |
| 1823 | 8.2 |
| 1824 | 10.3 |
| 1825 | 10.6 |
| 1826 | 11.1 |
| 1827 | 10.9 |
| 1828 | 9.9 |
| 1829 | 9.4 |
| 1830 | 8.9 |
| 1831 | 8.4 |
| 1832 | 7.9 |
| 1833 | 7.6 |
| 1834 | 7.2 |
| 1835 | 6.9 |
| 1836 | 6.8 |
| 1837 | 6.9 |
| 1838 | 6.9 |
| 1839 | 7.1 |
| 1840 | 7.1 |
| 1841 | 7.1 |
| 1842 | 7.2 |
| 1843 | 7.6 |
| 1844 | 7.8 |
| 1845 | 8.2 |
| 1846 | 9.2 |
| 1847 | 10.1 |
| 1848 | 9.9 |
| 1849 | 10.3 |
| 1850 | 11.2 |
| 1851 | 10.7 |
| 1852 | 10 |
| 1853 | 9.3 |
| 1854 | 8.8 |
| 1855 | 8.1 |
| 1856 | 8.1 |
| 1857 | 7.9 |
| 1858 | 7.2 |
| 1859 | 6.7 |
| 1860 | 5.9 |
| 1861 | 5.6 |
| 1862 | 5 |
| 1863 | 4.6 |
| 1864 | 4.1 |
| 1865 | 3.7 |
| 1866 | 3.3 |
| 1867 | 3.2 |
| 1868 | 3.7 |
| 1869 | 4.9 |
| 1870 | 5.8 |
| 1871 | 6.7 |
| 1872 | 6.7 |
| 1873 | 7.3 |
| 1874 | 7.7 |
| 1875 | 8 |
| 1876 | 7.9 |
| 1877 | 7.8 |
| 1878 | 7.4 |
| 1879 | 7 |
| 1880 | 6.8 |
| 1881 | 6.3 |
| 1882 | 6 |
| 1883 | 5.3 |
| 1884 | 5 |
| 1885 | 4.7 |
| 1886 | 4.7 |
| 1887 | 5.1 |
| 1888 | 4.8 |
| 1889 | 5 |
| 1890 | 5.1 |
| 1891 | 5.2 |
| 1892 | 5.6 |
| 1893 | 5.9 |
| 1894 | 7.1 |
| 1895 | 7.7 |
| 1896 | 10.1 |
| 1897 | 10.5 |
| 1898 | 10.4 |
| 1899 | 10.1 |
| 1900 | 10 |
| 1901 | 9.8 |
| 1902 | 9.5 |
| 1903 | 8.9 |
| 1904 | 8.2 |
| 1905 | 8.1 |
| 1906 | 8 |
| 1907 | 7.8 |
| 1908 | 7.5 |
| 1909 | 7.1 |
| 1910 | 7 |
| 1911 | 6.9 |
| 1912 | 6.8 |
| 1913 | 6.8 |
| 1914 | 6.8 |
| 1915 | 6.9 |
| 1916 | 6.7 |
| 1917 | 7.8 |
| 1918 | 8.7 |
| 1919 | 9.2 |
| 1920 | 9.9 |
| 1921 | 10.8 |
| 1922 | 11.5 |
| 1923 | 10.9 |
| 1924 | 10.5 |
| 1925 | 10.3 |
| 1926 | 9.8 |
| 1927 | 9.2 |
| 1928 | 8.7 |
| 1929 | 8.5 |
| 1930 | 8.4 |
| 1931 | 8.3 |
| 1932 | 7.9 |
| 1933 | 7.8 |
| 1934 | 7.5 |
| 1935 | 7.4 |
| 1936 | 7.3 |
| 1937 | 6.9 |
| 1938 | 6.7 |
| 1939 | 6.6 |
| 1940 | 6.6 |
| 1941 | 7.6 |
| 1942 | 9 |
| 1943 | 9.9 |
| 1944 | 11.3 |
| 1945 | 11.3 |
| 1946 | 11.3 |
| 1947 | 11.2 |
| 1948 | 10.7 |
| 1949 | 10.4 |
| 1950 | 9.8 |
| 1951 | 9.6 |
| 1952 | 9.5 |
| 1953 | 9.6 |
| 1954 | 9.7 |
| 1955 | 9.8 |
| 1956 | 9.8 |
| 1957 | 9.8 |
| 1958 | 9.4 |
| 1959 | 9.1 |
| 1960 | 9.4 |
| 1961 | 9.7 |
| 1962 | 9.9 |
| 1963 | 10.1 |
| 1964 | 10.6 |
| 1965 | 10.9 |
| 1966 | 11 |
| 1967 | 11.2 |
| 1968 | 11.3 |
| 1969 | 11.6 |
| 1970 | 11.7 |
| 1971 | 11.6 |
| 1972 | 11.6 |
| 1973 | 11.3 |
| 1974 | 11.1 |
| 1975 | 11 |
| 1976 | 11 |
| 1977 | 11.1 |
| 1978 | 11.1 |
| 1979 | 11.1 |
| 1980 | 11 |
| 1981 | 11.2 |
| 1982 | 11.1 |
| 1983 | 11.2 |
| 1984 | 11.2 |
| 1985 | 11.2 |
| 1986 | 11.1 |
| 1987 | 11 |
| 1988 | 10.7 |
| 1989 | 11.4 |
| 1990 | 12.3 |
| 1991 | 12.6 |
| 1992 | 12.5 |
| 1993 | 13 |
| 1994 | 13.5 |
| 1995 | 13.7 |
| 1996 | 13.5 |
| 1997 | 12.9 |
| 1998 | 12.3 |
| 1999 | 11.6 |
| 2000 | 11 |
| 2001 | 10.8 |
| 2002 | 10.8 |
| 2003 | 10.8 |
| 2004 | 10.7 |
| 2005 | 11.1 |
| 2006 | 11.1 |
| 2007 | 11.2 |
| 2008 | 11.5 |
| 2009 | 11.6 |
| 2010 | 11.5 |
| 2011 | 11.4 |
| 2012 | 11.7 |
| 2013 | 12 |
| 2014 | 13.6 |
| 2015 | 14.8 |
| 2016 | 15.2 |
| 2017 | 16.2 |
| 2018 | 17 |
| 2019 | 17.2 |
| 2020 | 15.8 |
| 2021 | 12.9 |
| 2022 | 11.6 |
| 2023 | 10.5 |
| 2024 | 9.8 |
| 2025 | 9.6 |
| 2026 | 9.3 |
| 2027 | 9.1 |
| 2028 | 9.3 |
| 2029 | 9.3 |
| 2030 | 9.1 |
| 2031 | 9.1 |
| 2032 | 9.5 |
| 2033 | 9.8 |
| 2034 | 9.7 |
| 2035 | 9.3 |
| 2036 | 9.3 |
| 2037 | 9.4 |
| 2038 | 9.7 |
| 2039 | 11.6 |
| 2040 | 11.2 |
| 2041 | 10.8 |
| 2042 | 10.8 |
| 2043 | 10.6 |
| 2044 | 10.5 |
| 2045 | 10.3 |
| 2046 | 9.9 |
| 2047 | 9.6 |
| 2048 | 9.1 |
| 2049 | 8.9 |
| 2050 | 8.8 |
| 2051 | 8.6 |
| 2052 | 8.6 |
| 2053 | 8.7 |
| 2054 | 8.7 |
| 2055 | 8.7 |
| 2056 | 8.8 |
| 2057 | 9.1 |
| 2058 | 9.3 |
| 2059 | 9.5 |
| 2060 | 9.4 |
| 2061 | 9.6 |
| 2062 | 10.4 |
| 2063 | 11.2 |
| 2064 | 11.6 |
| 2065 | 12.1 |
| 2066 | 12.2 |
| 2067 | 12 |
| 2068 | 11.8 |
| 2069 | 11.4 |
| 2070 | 10.8 |
| 2071 | 10.3 |
| 2072 | 10.2 |
| 2073 | 10.2 |
| 2074 | 10.2 |
| 2075 | 10.1 |
| 2076 | 10.1 |
| 2077 | 10.1 |
| 2078 | 10.1 |
| 2079 | 9.8 |
| 2080 | 9.4 |
| 2081 | 9.4 |
| 2082 | 9.4 |
| 2083 | 9.5 |
| 2084 | 9.6 |
| 2085 | 9.8 |
| 2086 | 10.2 |
| 2087 | 11.1 |
| 2088 | 14.7 |
| 2089 | 16.2 |
| 2090 | 17.1 |
| 2091 | 17.5 |
| 2092 | 17.6 |
| 2093 | 17.4 |
| 2094 | 15.9 |
| 2095 | 12.8 |
| 2096 | 12.1 |
| 2097 | 12 |
| 2098 | 11.8 |
| 2099 | 12.7 |
| 2100 | 13.4 |
| 2101 | 14.2 |
| 2102 | 14.8 |
| 2103 | 14.5 |
| 2104 | 13.8 |
| 2105 | 13.1 |
| 2106 | 12.7 |
| 2107 | 12.4 |
| 2108 | 12.4 |
| 2109 | 12.5 |
| 2110 | 13.6 |
| 2111 | 14.7 |
| 2112 | 16.7 |
| 2113 | 17.4 |
| 2114 | 18 |
| 2115 | 18.5 |
| 2116 | 18.7 |
| 2117 | 18.7 |
| 2118 | 18.4 |
| 2119 | 18.2 |
| 2120 | 17.6 |
| 2121 | 16.8 |
| 2122 | 16.6 |
| 2123 | 16.6 |
| 2124 | 16.2 |
| 2125 | 15.9 |
| 2126 | 15.6 |
| 2127 | 15.2 |
| 2128 | 14.8 |
| 2129 | 14.6 |
| 2130 | 14.5 |
| 2131 | 14.2 |
| 2132 | 14.2 |
| 2133 | 14.7 |
| 2134 | 15.7 |
| 2135 | 16.7 |
| 2136 | 19.4 |
| 2137 | 20.1 |
| 2138 | 20.4 |
| 2139 | 20.8 |
| 2140 | 21 |
| 2141 | 20.9 |
| 2142 | 20.6 |
| 2143 | 20.2 |
| 2144 | 19.8 |
| 2145 | 19.7 |
| 2146 | 19.6 |
| 2147 | 18.7 |
| 2148 | 17.7 |
| 2149 | 17.3 |
| 2150 | 16.9 |
| 2151 | 16.2 |
| 2152 | 15.6 |
| 2153 | 14.9 |
| 2154 | 14.3 |
| 2155 | 13.8 |
| 2156 | 13.9 |
| 2157 | 14.5 |
| 2158 | 15.5 |
| 2159 | 16.6 |
| 2160 | 19.7 |
| 2161 | 20.5 |
| 2162 | 21.2 |
| 2163 | 21.7 |
| 2164 | 22 |
| 2165 | 22.1 |
| 2166 | 22 |
| 2167 | 20.2 |
| 2168 | 19.3 |
| 2169 | 19.2 |
| 2170 | 19.6 |
| 2171 | 19.6 |
| 2172 | 19.3 |
| 2173 | 18.4 |
| 2174 | 17.7 |
| 2175 | 17.2 |
| 2176 | 16.5 |
| 2177 | 15.8 |
| 2178 | 15.3 |
| 2179 | 14.6 |
| 2180 | 14.1 |
| 2181 | 14.3 |
| 2182 | 15.3 |
| 2183 | 16.4 |
| 2184 | 16 |
| 2185 | 17.2 |
| 2186 | 18.2 |
| 2187 | 18.5 |
| 2188 | 18.5 |
| 2189 | 18.4 |
| 2190 | 18.3 |
| 2191 | 15.8 |
| 2192 | 14.6 |
| 2193 | 15 |
| 2194 | 15.6 |
| 2195 | 15.8 |
| 2196 | 15.9 |
| 2197 | 15.3 |
| 2198 | 14.2 |
| 2199 | 14.5 |
| 2200 | 15 |
| 2201 | 15.1 |
| 2202 | 15.1 |
| 2203 | 15.5 |
| 2204 | 15.2 |
| 2205 | 15.5 |
| 2206 | 16.3 |
| 2207 | 16.8 |
| 2208 | 18.2 |
| 2209 | 18.8 |
| 2210 | 18.9 |
| 2211 | 19 |
| 2212 | 17.8 |
| 2213 | 16 |
| 2214 | 15.5 |
| 2215 | 14.1 |
| 2216 | 13.2 |
| 2217 | 13 |
| 2218 | 13.2 |
| 2219 | 12.8 |
| 2220 | 12.6 |
| 2221 | 12.4 |
| 2222 | 12.1 |
| 2223 | 11.8 |
| 2224 | 11.9 |
| 2225 | 12.1 |
| 2226 | 12.4 |
| 2227 | 12.5 |
| 2228 | 12.6 |
| 2229 | 12.9 |
| 2230 | 13.1 |
| 2231 | 12.8 |
| 2232 | 11.7 |
| 2233 | 11.5 |
| 2234 | 12.8 |
| 2235 | 13.4 |
| 2236 | 12.3 |
| 2237 | 11.5 |
| 2238 | 9.8 |
| 2239 | 10.1 |
| 2240 | 9.9 |
| 2241 | 9.3 |
| 2242 | 9.4 |
| 2243 | 9.2 |
| 2244 | 9.3 |
| 2245 | 9.1 |
| 2246 | 8.9 |
| 2247 | 9 |
| 2248 | 9.7 |
| 2249 | 10.3 |
| 2250 | 10 |
| 2251 | 10.3 |
| 2252 | 10.7 |
| 2253 | 11.1 |
| 2254 | 13 |
| 2255 | 13.1 |
| 2256 | 11.4 |
| 2257 | 11.4 |
| 2258 | 11.8 |
| 2259 | 12.9 |
| 2260 | 12.5 |
| 2261 | 12.7 |
| 2262 | 11.6 |
| 2263 | 11.6 |
| 2264 | 11.5 |
| 2265 | 11.6 |
| 2266 | 11.7 |
| 2267 | 12.2 |
| 2268 | 12.4 |
| 2269 | 11.9 |
| 2270 | 11.9 |
| 2271 | 11.5 |
| 2272 | 11.6 |
| 2273 | 11.7 |
| 2274 | 11.5 |
| 2275 | 11.6 |
| 2276 | 11.8 |
| 2277 | 11.7 |
| 2278 | 12.3 |
| 2279 | 13.7 |
| 2280 | 14.1 |
| 2281 | 14.3 |
| 2282 | 14.5 |
| 2283 | 13.7 |
| 2284 | 12.5 |
| 2285 | 12.3 |
| 2286 | 11.8 |
| 2287 | 11.2 |
| 2288 | 10.8 |
| 2289 | 10.6 |
| 2290 | 10.2 |
| 2291 | 9.8 |
| 2292 | 10.3 |
| 2293 | 10.2 |
| 2294 | 10.1 |
| 2295 | 10 |
| 2296 | 9.8 |
| 2297 | 9.6 |
| 2298 | 9.7 |
| 2299 | 9.8 |
| 2300 | 10.1 |
| 2301 | 10.4 |
| 2302 | 10.5 |
| 2303 | 10.7 |
| 2304 | 9.2 |
| 2305 | 9.2 |
| 2306 | 9.5 |
| 2307 | 9.2 |
| 2308 | 9.2 |
| 2309 | 9.5 |
| 2310 | 9 |
| 2311 | 8.8 |
| 2312 | 8.4 |
| 2313 | 8.5 |
| 2314 | 8.5 |
| 2315 | 8.1 |
| 2316 | 8 |
| 2317 | 7.8 |
| 2318 | 7.5 |
| 2319 | 7.1 |
| 2320 | 7.1 |
| 2321 | 6.4 |
| 2322 | 5.9 |
| 2323 | 5.9 |
| 2324 | 6.9 |
| 2325 | 8 |
| 2326 | 8.3 |
| 2327 | 8.5 |
| 2328 | 9.7 |
| 2329 | 8.5 |
| 2330 | 8.4 |
| 2331 | 9.7 |
| 2332 | 9.8 |
| 2333 | 9.5 |
| 2334 | 9.6 |
| 2335 | 9.1 |
| 2336 | 8.6 |
| 2337 | 7.9 |
| 2338 | 7.5 |
| 2339 | 7.9 |
| 2340 | 7.8 |
| 2341 | 7.3 |
| 2342 | 7.3 |
| 2343 | 7.4 |
| 2344 | 6.9 |
| 2345 | 7.2 |
| 2346 | 7.3 |
| 2347 | 7 |
| 2348 | 7.6 |
| 2349 | 8.5 |
| 2350 | 9.7 |
| 2351 | 9.3 |
| 2352 | 10.9 |
| 2353 | 10.8 |
| 2354 | 11.2 |
| 2355 | 10.8 |
| 2356 | 10.8 |
| 2357 | 10.3 |
| 2358 | 10.2 |
| 2359 | 10 |
| 2360 | 10 |
| 2361 | 9.9 |
| 2362 | 9.7 |
| 2363 | 9.3 |
| 2364 | 8.5 |
| 2365 | 8 |
| 2366 | 8.3 |
| 2367 | 8.1 |
| 2368 | 8.2 |
| 2369 | 8.3 |
| 2370 | 8.3 |
| 2371 | 8.1 |
| 2372 | 8.4 |
| 2373 | 9.8 |
| 2374 | 11.1 |
| 2375 | 10.6 |
| 2376 | 11.8 |
| 2377 | 11.9 |
| 2378 | 12 |
| 2379 | 11.1 |
| 2380 | 12.1 |
| 2381 | 11.7 |
| 2382 | 11.2 |
| 2383 | 10.7 |
| 2384 | 10.5 |
| 2385 | 10.4 |
| 2386 | 10.3 |
| 2387 | 9.9 |
| 2388 | 10 |
| 2389 | 9.8 |
| 2390 | 9.8 |
| 2391 | 9.9 |
| 2392 | 10 |
| 2393 | 10.1 |
| 2394 | 10.2 |
| 2395 | 10.2 |
| 2396 | 10.3 |
| 2397 | 10.7 |
| 2398 | 11.7 |
| 2399 | 12.3 |
| 2400 | 13.3 |
| 2401 | 13.8 |
| 2402 | 14.1 |
| 2403 | 14.1 |
| 2404 | 14.1 |
| 2405 | 13.7 |
| 2406 | 12.9 |
| 2407 | 11.4 |
| 2408 | 9.9 |
| 2409 | 9.2 |
| 2410 | 8.9 |
| 2411 | 8.7 |
| 2412 | 8.8 |
| 2413 | 9.5 |
| 2414 | 10.2 |
| 2415 | 11 |
| 2416 | 11.6 |
| 2417 | 12.2 |
| 2418 | 12.6 |
| 2419 | 11.7 |
| 2420 | 11.5 |
| 2421 | 12 |
| 2422 | 13.2 |
| 2423 | 13.9 |
| 2424 | 14.6 |
| 2425 | 16.1 |
| 2426 | 16.9 |
| 2427 | 17.6 |
| 2428 | 18 |
| 2429 | 18.1 |
| 2430 | 15.6 |
| 2431 | 12.5 |
| 2432 | 12.3 |
| 2433 | 12.4 |
| 2434 | 12.1 |
| 2435 | 12.2 |
| 2436 | 12.8 |
| 2437 | 13.2 |
| 2438 | 13.7 |
| 2439 | 14 |
| 2440 | 14 |
| 2441 | 14.1 |
| 2442 | 13.9 |
| 2443 | 13.6 |
| 2444 | 13.6 |
| 2445 | 14.4 |
| 2446 | 15.1 |
| 2447 | 15.7 |
| 2448 | 15.8 |
| 2449 | 16.5 |
| 2450 | 17.2 |
| 2451 | 16.3 |
| 2452 | 15.4 |
| 2453 | 14.2 |
| 2454 | 13.5 |
| 2455 | 12.4 |
| 2456 | 11.8 |
| 2457 | 11.9 |
| 2458 | 12.3 |
| 2459 | 12.5 |
| 2460 | 12.5 |
| 2461 | 11.9 |
| 2462 | 11.1 |
| 2463 | 10.8 |
| 2464 | 10.6 |
| 2465 | 10.5 |
| 2466 | 10.4 |
| 2467 | 10.4 |
| 2468 | 10.6 |
| 2469 | 11 |
| 2470 | 11.7 |
| 2471 | 12.3 |
| 2472 | 11.1 |
| 2473 | 11.3 |
| 2474 | 10.9 |
| 2475 | 10.4 |
| 2476 | 11.3 |
| 2477 | 10.8 |
| 2478 | 10.6 |
| 2479 | 10.4 |
| 2480 | 10.5 |
| 2481 | 10.9 |
| 2482 | 11.8 |
| 2483 | 12 |
| 2484 | 11.7 |
| 2485 | 11.3 |
| 2486 | 10.8 |
| 2487 | 10.3 |
| 2488 | 9.9 |
| 2489 | 9.5 |
| 2490 | 8.9 |
| 2491 | 8.4 |
| 2492 | 8.1 |
| 2493 | 8.8 |
| 2494 | 8.8 |
| 2495 | 9.4 |
| 2496 | 7.9 |
| 2497 | 8.2 |
| 2498 | 8.4 |
| 2499 | 8.5 |
| 2500 | 8.4 |
| 2501 | 8.5 |
| 2502 | 8.4 |
| 2503 | 8.2 |
| 2504 | 8.4 |
| 2505 | 8.9 |
| 2506 | 9 |
| 2507 | 9.8 |
| 2508 | 9.8 |
| 2509 | 10.2 |
| 2510 | 10.4 |
| 2511 | 10.3 |
| 2512 | 9.6 |
| 2513 | 9.5 |
| 2514 | 9.5 |
| 2515 | 9.6 |
| 2516 | 9.4 |
| 2517 | 11.3 |
| 2518 | 11.9 |
| 2519 | 12.3 |
| 2520 | 9.7 |
| 2521 | 10.1 |
| 2522 | 9.2 |
| 2523 | 8.8 |
| 2524 | 9.6 |
| 2525 | 11 |
| 2526 | 10 |
| 2527 | 10.4 |
| 2528 | 9.4 |
| 2529 | 9.3 |
| 2530 | 9.3 |
| 2531 | 9.4 |
| 2532 | 8.9 |
| 2533 | 7.5 |
| 2534 | 7.8 |
| 2535 | 8 |
| 2536 | 7.8 |
| 2537 | 7.6 |
| 2538 | 7.7 |
| 2539 | 7.9 |
| 2540 | 8 |
| 2541 | 8.9 |
| 2542 | 9.7 |
| 2543 | 10.6 |
| 2544 | 8 |
| 2545 | 8.9 |
| 2546 | 9.1 |
| 2547 | 9.5 |
| 2548 | 9.8 |
| 2549 | 9 |
| 2550 | 9 |
| 2551 | 9.4 |
| 2552 | 9.8 |
| 2553 | 8.9 |
| 2554 | 8.7 |
| 2555 | 8.2 |
| 2556 | 8.3 |
| 2557 | 8.3 |
| 2558 | 8.4 |
| 2559 | 8.6 |
| 2560 | 8.8 |
| 2561 | 9.5 |
| 2562 | 9.5 |
| 2563 | 9.3 |
| 2564 | 9.5 |
| 2565 | 11.1 |
| 2566 | 11.3 |
| 2567 | 11.8 |
| 2568 | 11 |
| 2569 | 11 |
| 2570 | 11.4 |
| 2571 | 11.5 |
| 2572 | 11.5 |
| 2573 | 11.4 |
| 2574 | 11 |
| 2575 | 10.4 |
| 2576 | 10 |
| 2577 | 9.8 |
| 2578 | 9.7 |
| 2579 | 9.5 |
| 2580 | 10 |
| 2581 | 9.8 |
| 2582 | 9.6 |
| 2583 | 9.6 |
| 2584 | 9.6 |
| 2585 | 10.2 |
| 2586 | 9.9 |
| 2587 | 9.9 |
| 2588 | 10.3 |
| 2589 | 10.3 |
| 2590 | 11.7 |
| 2591 | 12.5 |
| 2592 | 13.1 |
| 2593 | 12.9 |
| 2594 | 12.8 |
| 2595 | 12.8 |
| 2596 | 12.5 |
| 2597 | 12.5 |
| 2598 | 12.2 |
| 2599 | 12.3 |
| 2600 | 12.3 |
| 2601 | 12.3 |
| 2602 | 12.4 |
| 2603 | 12.7 |
| 2604 | 12.7 |
| 2605 | 12.8 |
| 2606 | 12.7 |
| 2607 | 12.5 |
| 2608 | 12.4 |
| 2609 | 12.4 |
| 2610 | 12.4 |
| 2611 | 12.4 |
| 2612 | 12.4 |
| 2613 | 12.6 |
| 2614 | 13.2 |
| 2615 | 14.7 |
| 2616 | 15.3 |
| 2617 | 16.5 |
| 2618 | 17.2 |
| 2619 | 17.2 |
| 2620 | 16.5 |
| 2621 | 15.6 |
| 2622 | 14.5 |
| 2623 | 13.2 |
| 2624 | 12.1 |
| 2625 | 11.4 |
| 2626 | 11 |
| 2627 | 11 |
| 2628 | 11.1 |
| 2629 | 11.3 |
| 2630 | 11.4 |
| 2631 | 11.2 |
| 2632 | 10.7 |
| 2633 | 10.8 |
| 2634 | 11 |
| 2635 | 11.2 |
| 2636 | 12.5 |
| 2637 | 14.2 |
| 2638 | 15.7 |
| 2639 | 17.3 |
| 2640 | 18.9 |
| 2641 | 20.1 |
| 2642 | 20.9 |
| 2643 | 21.2 |
| 2644 | 20.6 |
| 2645 | 19.6 |
| 2646 | 18.2 |
| 2647 | 16.2 |
| 2648 | 15.2 |
| 2649 | 14.7 |
| 2650 | 14.4 |
| 2651 | 14.8 |
| 2652 | 16.3 |
| 2653 | 17.4 |
| 2654 | 18.4 |
| 2655 | 19.4 |
| 2656 | 19.9 |
| 2657 | 19.6 |
| 2658 | 19.2 |
| 2659 | 18.8 |
| 2660 | 18.8 |
| 2661 | 19.8 |
| 2662 | 21.3 |
| 2663 | 22.2 |
| 2664 | 22.3 |
| 2665 | 23.6 |
| 2666 | 24.5 |
| 2667 | 25 |
| 2668 | 25.3 |
| 2669 | 25.3 |
| 2670 | 25 |
| 2671 | 22.2 |
| 2672 | 21.5 |
| 2673 | 21.9 |
| 2674 | 22.2 |
| 2675 | 22.7 |
| 2676 | 22.4 |
| 2677 | 21.8 |
| 2678 | 21.8 |
| 2679 | 21 |
| 2680 | 19.9 |
| 2681 | 19.4 |
| 2682 | 19.1 |
| 2683 | 18.9 |
| 2684 | 19.1 |
| 2685 | 19.6 |
| 2686 | 20.2 |
| 2687 | 20.9 |
| 2688 | 22.5 |
| 2689 | 23.6 |
| 2690 | 24.4 |
| 2691 | 24.4 |
| 2692 | 21.5 |
| 2693 | 18.6 |
| 2694 | 16.9 |
| 2695 | 15.8 |
| 2696 | 15.2 |
| 2697 | 16 |
| 2698 | 16.7 |
| 2699 | 17.5 |
| 2700 | 18.1 |
| 2701 | 18.5 |
| 2702 | 18.5 |
| 2703 | 18.1 |
| 2704 | 17.3 |
| 2705 | 16.7 |
| 2706 | 16.7 |
| 2707 | 16.7 |
| 2708 | 16.5 |
| 2709 | 17.4 |
| 2710 | 18.4 |
| 2711 | 19.5 |
| 2712 | 18.5 |
| 2713 | 18.8 |
| 2714 | 18.5 |
| 2715 | 17.1 |
| 2716 | 15.7 |
| 2717 | 14.6 |
| 2718 | 13.8 |
| 2719 | 12 |
| 2720 | 11.1 |
| 2721 | 10.8 |
| 2722 | 10.7 |
| 2723 | 10.4 |
| 2724 | 10.1 |
| 2725 | 10 |
| 2726 | 9.9 |
| 2727 | 9.8 |
| 2728 | 9.7 |
| 2729 | 9.6 |
| 2730 | 9.5 |
| 2731 | 9.5 |
| 2732 | 9.8 |
| 2733 | 10.5 |
| 2734 | 11.3 |
| 2735 | 12.4 |
| 2736 | 12.7 |
| 2737 | 12.9 |
| 2738 | 12.8 |
| 2739 | 12.5 |
| 2740 | 12.2 |
| 2741 | 11.7 |
| 2742 | 11.1 |
| 2743 | 10.3 |
| 2744 | 9.7 |
| 2745 | 9.3 |
| 2746 | 9.1 |
| 2747 | 8.9 |
| 2748 | 8.2 |
| 2749 | 8.2 |
| 2750 | 8.4 |
| 2751 | 8 |
| 2752 | 7.5 |
| 2753 | 7.5 |
| 2754 | 7.5 |
| 2755 | 7.6 |
| 2756 | 8.3 |
| 2757 | 9 |
| 2758 | 9.2 |
| 2759 | 9.8 |
| 2760 | 11.3 |
| 2761 | 11.8 |
| 2762 | 12 |
| 2763 | 11.9 |
| 2764 | 11.7 |
| 2765 | 11.1 |
| 2766 | 10.6 |
| 2767 | 9.9 |
| 2768 | 9.6 |
| 2769 | 9.5 |
| 2770 | 9.5 |
| 2771 | 9.7 |
| 2772 | 9.6 |
| 2773 | 9.7 |
| 2774 | 10 |
| 2775 | 9.6 |
| 2776 | 9.4 |
| 2777 | 9.1 |
| 2778 | 8.9 |
| 2779 | 9 |
| 2780 | 9.6 |
| 2781 | 10.1 |
| 2782 | 10.2 |
| 2783 | 11.2 |
| 2784 | 12.1 |
| 2785 | 12.2 |
| 2786 | 10.7 |
| 2787 | 11.7 |
| 2788 | 11.7 |
| 2789 | 11.4 |
| 2790 | 11 |
| 2791 | 10.4 |
| 2792 | 9.7 |
| 2793 | 9.4 |
| 2794 | 9.2 |
| 2795 | 9 |
| 2796 | 9 |
| 2797 | 8.8 |
| 2798 | 9 |
| 2799 | 9.1 |
| 2800 | 9 |
| 2801 | 9 |
| 2802 | 9 |
| 2803 | 9.2 |
| 2804 | 9.3 |
| 2805 | 10.2 |
| 2806 | 11.1 |
| 2807 | 12 |
| 2808 | 13.6 |
| 2809 | 14.1 |
| 2810 | 14.4 |
| 2811 | 14.6 |
| 2812 | 14.4 |
| 2813 | 13.7 |
| 2814 | 12.2 |
| 2815 | 11 |
| 2816 | 10.2 |
| 2817 | 10.2 |
| 2818 | 10.1 |
| 2819 | 10 |
| 2820 | 10 |
| 2821 | 10 |
| 2822 | 10.2 |
| 2823 | 10.5 |
| 2824 | 10.9 |
| 2825 | 11.5 |
| 2826 | 12.4 |
| 2827 | 13.3 |
| 2828 | 13.9 |
| 2829 | 14.2 |
| 2830 | 15.5 |
| 2831 | 16.4 |
| 2832 | 17.4 |
| 2833 | 18.8 |
| 2834 | 19.6 |
| 2835 | 20.1 |
| 2836 | 20.5 |
| 2837 | 20.6 |
| 2838 | 19 |
| 2839 | 15.5 |
| 2840 | 14.3 |
| 2841 | 15.6 |
| 2842 | 16.3 |
| 2843 | 17 |
| 2844 | 17.4 |
| 2845 | 17.3 |
| 2846 | 17.1 |
| 2847 | 16.8 |
| 2848 | 16.5 |
| 2849 | 16.5 |
| 2850 | 16.5 |
| 2851 | 16.4 |
| 2852 | 16.6 |
| 2853 | 17.2 |
| 2854 | 18.2 |
| 2855 | 19.1 |
| 2856 | 20.1 |
| 2857 | 21.1 |
| 2858 | 22.1 |
| 2859 | 23 |
| 2860 | 22.9 |
| 2861 | 21.8 |
| 2862 | 19.6 |
| 2863 | 16.6 |
| 2864 | 15 |
| 2865 | 14.5 |
| 2866 | 14.3 |
| 2867 | 14.4 |
| 2868 | 14.5 |
| 2869 | 14.7 |
| 2870 | 14.6 |
| 2871 | 14.5 |
| 2872 | 14.3 |
| 2873 | 14.1 |
| 2874 | 13.7 |
| 2875 | 13.2 |
| 2876 | 13.1 |
| 2877 | 14.1 |
| 2878 | 15.4 |
| 2879 | 16.6 |
| 2880 | 17.8 |
| 2881 | 19.2 |
| 2882 | 19.3 |
| 2883 | 19.4 |
| 2884 | 19.1 |
| 2885 | 17.9 |
| 2886 | 16.6 |
| 2887 | 15.1 |
| 2888 | 14 |
| 2889 | 13.6 |
| 2890 | 13.3 |
| 2891 | 13 |
| 2892 | 12.8 |
| 2893 | 12.4 |
| 2894 | 12.2 |
| 2895 | 12.2 |
| 2896 | 12 |
| 2897 | 12 |
| 2898 | 12.2 |
| 2899 | 12.4 |
| 2900 | 13.7 |
| 2901 | 15.5 |
| 2902 | 17 |
| 2903 | 18.6 |
| 2904 | 19.3 |
| 2905 | 20.6 |
| 2906 | 20.4 |
| 2907 | 18.9 |
| 2908 | 17.8 |
| 2909 | 17.4 |
| 2910 | 16.1 |
| 2911 | 14.5 |
| 2912 | 13 |
| 2913 | 12.4 |
| 2914 | 12.4 |
| 2915 | 12.4 |
| 2916 | 12.3 |
| 2917 | 12 |
| 2918 | 11.8 |
| 2919 | 11.8 |
| 2920 | 11.7 |
| 2921 | 12 |
| 2922 | 12 |
| 2923 | 12 |
| 2924 | 12.4 |
| 2925 | 13.7 |
| 2926 | 14.5 |
| 2927 | 16 |
| 2928 | 19.2 |
| 2929 | 20.1 |
| 2930 | 19.6 |
| 2931 | 18.4 |
| 2932 | 17.3 |
| 2933 | 16.1 |
| 2934 | 15.1 |
| 2935 | 14.2 |
| 2936 | 13.7 |
| 2937 | 13.4 |
| 2938 | 13.1 |
| 2939 | 12.9 |
| 2940 | 12.8 |
| 2941 | 12.7 |
| 2942 | 12.6 |
| 2943 | 12.5 |
| 2944 | 12.5 |
| 2945 | 12.4 |
| 2946 | 12.2 |
| 2947 | 12.2 |
| 2948 | 12.5 |
| 2949 | 13.7 |
| 2950 | 15 |
| 2951 | 16.2 |
| 2952 | 16.8 |
| 2953 | 18 |
| 2954 | 19.1 |
| 2955 | 19.4 |
| 2956 | 18.9 |
| 2957 | 17.4 |
| 2958 | 16.2 |
| 2959 | 14.7 |
| 2960 | 13.4 |
| 2961 | 12.8 |
| 2962 | 12.5 |
| 2963 | 12.3 |
| 2964 | 12 |
| 2965 | 11.7 |
| 2966 | 11.4 |
| 2967 | 11.6 |
| 2968 | 11.6 |
| 2969 | 11.6 |
| 2970 | 11.6 |
| 2971 | 11.7 |
| 2972 | 12 |
| 2973 | 13.3 |
| 2974 | 13.2 |
| 2975 | 13.2 |
| 2976 | 14.4 |
| 2977 | 15.2 |
| 2978 | 15.1 |
| 2979 | 15 |
| 2980 | 14.7 |
| 2981 | 13.9 |
| 2982 | 13.2 |
| 2983 | 12.3 |
| 2984 | 11.1 |
| 2985 | 10.9 |
| 2986 | 10.8 |
| 2987 | 10.5 |
| 2988 | 10.1 |
| 2989 | 9.6 |
| 2990 | 9.3 |
| 2991 | 9.2 |
| 2992 | 9 |
| 2993 | 9 |
| 2994 | 9 |
| 2995 | 9.3 |
| 2996 | 10.1 |
| 2997 | 10.4 |
| 2998 | 11.5 |
| 2999 | 12.3 |
| 3000 | 12.4 |
| 3001 | 13.1 |
| 3002 | 13.1 |
| 3003 | 12.6 |
| 3004 | 11.9 |
| 3005 | 11.5 |
| 3006 | 10.8 |
| 3007 | 10.2 |
| 3008 | 9.6 |
| 3009 | 9.3 |
| 3010 | 8.8 |
| 3011 | 8.7 |
| 3012 | 8.8 |
| 3013 | 8.9 |
| 3014 | 8.4 |
| 3015 | 8.4 |
| 3016 | 8.7 |
| 3017 | 8.4 |
| 3018 | 8.5 |
| 3019 | 8.4 |
| 3020 | 9.4 |
| 3021 | 10.1 |
| 3022 | 10.5 |
| 3023 | 10.5 |
| 3024 | 11.3 |
| 3025 | 11.8 |
| 3026 | 12.4 |
| 3027 | 12.5 |
| 3028 | 12.6 |
| 3029 | 12.8 |
| 3030 | 12.6 |
| 3031 | 12 |
| 3032 | 11.1 |
| 3033 | 11 |
| 3034 | 10.8 |
| 3035 | 10.6 |
| 3036 | 10.5 |
| 3037 | 10.3 |
| 3038 | 10.1 |
| 3039 | 10.1 |
| 3040 | 9.8 |
| 3041 | 9.6 |
| 3042 | 9.6 |
| 3043 | 9.8 |
| 3044 | 10.5 |
| 3045 | 12.1 |
| 3046 | 12.9 |
| 3047 | 13.4 |
| 3048 | 13.6 |
| 3049 | 13.7 |
| 3050 | 14.1 |
| 3051 | 14 |
| 3052 | 13.7 |
| 3053 | 13.4 |
| 3054 | 12.8 |
| 3055 | 12.3 |
| 3056 | 12.1 |
| 3057 | 11.8 |
| 3058 | 11.6 |
| 3059 | 11.5 |
| 3060 | 11.5 |
| 3061 | 11.5 |
| 3062 | 11.5 |
| 3063 | 11.5 |
| 3064 | 11.6 |
| 3065 | 11.7 |
| 3066 | 11.7 |
| 3067 | 11.7 |
| 3068 | 11.7 |
| 3069 | 11.8 |
| 3070 | 12.1 |
| 3071 | 12.8 |
| 3072 | 12.2 |
| 3073 | 12.5 |
| 3074 | 12.8 |
| 3075 | 13.2 |
| 3076 | 12.8 |
| 3077 | 12.8 |
| 3078 | 12.5 |
| 3079 | 11.7 |
| 3080 | 10.9 |
| 3081 | 10.6 |
| 3082 | 10.5 |
| 3083 | 10.4 |
| 3084 | 10.4 |
| 3085 | 10.5 |
| 3086 | 10.5 |
| 3087 | 10.6 |
| 3088 | 10.7 |
| 3089 | 11 |
| 3090 | 11.1 |
| 3091 | 11.1 |
| 3092 | 11.5 |
| 3093 | 11.8 |
| 3094 | 13.6 |
| 3095 | 15.1 |
| 3096 | 14.4 |
| 3097 | 14.6 |
| 3098 | 15.1 |
| 3099 | 14.7 |
| 3100 | 14 |
| 3101 | 13.8 |
| 3102 | 13.3 |
| 3103 | 12.5 |
| 3104 | 11.7 |
| 3105 | 11.4 |
| 3106 | 11.2 |
| 3107 | 11 |
| 3108 | 11 |
| 3109 | 11.2 |
| 3110 | 11.5 |
| 3111 | 10.9 |
| 3112 | 10.7 |
| 3113 | 10.6 |
| 3114 | 11.1 |
| 3115 | 11 |
| 3116 | 11 |
| 3117 | 11.7 |
| 3118 | 12.5 |
| 3119 | 13.2 |
| 3120 | 13.6 |
| 3121 | 14.4 |
| 3122 | 13.3 |
| 3123 | 14.2 |
| 3124 | 14.3 |
| 3125 | 14.4 |
| 3126 | 14 |
| 3127 | 13 |
| 3128 | 12 |
| 3129 | 11.5 |
| 3130 | 11.5 |
| 3131 | 11.7 |
| 3132 | 11.7 |
| 3133 | 12 |
| 3134 | 11.7 |
| 3135 | 11.5 |
| 3136 | 11.3 |
| 3137 | 11.1 |
| 3138 | 11.1 |
| 3139 | 11 |
| 3140 | 12.7 |
| 3141 | 13.6 |
| 3142 | 14 |
| 3143 | 14.3 |
| 3144 | 13.5 |
| 3145 | 14.8 |
| 3146 | 14.3 |
| 3147 | 15.1 |
| 3148 | 15.5 |
| 3149 | 14.4 |
| 3150 | 13.7 |
| 3151 | 12.7 |
| 3152 | 12 |
| 3153 | 11.7 |
| 3154 | 11.5 |
| 3155 | 11.3 |
| 3156 | 11.4 |
| 3157 | 11.2 |
| 3158 | 10.5 |
| 3159 | 10.2 |
| 3160 | 9.9 |
| 3161 | 9.7 |
| 3162 | 9.5 |
| 3163 | 9.5 |
| 3164 | 10.3 |
| 3165 | 11.5 |
| 3166 | 11.9 |
| 3167 | 12.7 |
| 3168 | 13.9 |
| 3169 | 13.7 |
| 3170 | 13.6 |
| 3171 | 14.1 |
| 3172 | 14 |
| 3173 | 13.1 |
| 3174 | 12.5 |
| 3175 | 11.9 |
| 3176 | 11.6 |
| 3177 | 11.4 |
| 3178 | 11.3 |
| 3179 | 11.1 |
| 3180 | 10.6 |
| 3181 | 9.7 |
| 3182 | 9.8 |
| 3183 | 9.6 |
| 3184 | 9.5 |
| 3185 | 9.3 |
| 3186 | 9 |
| 3187 | 9.2 |
| 3188 | 9.5 |
| 3189 | 10.7 |
| 3190 | 11.2 |
| 3191 | 12.3 |
| 3192 | 12.6 |
| 3193 | 13.1 |
| 3194 | 12.9 |
| 3195 | 13.6 |
| 3196 | 13.5 |
| 3197 | 13.1 |
| 3198 | 12.5 |
| 3199 | 11.8 |
| 3200 | 11.1 |
| 3201 | 10.9 |
| 3202 | 10.9 |
| 3203 | 10.2 |
| 3204 | 9.8 |
| 3205 | 10.3 |
| 3206 | 10.2 |
| 3207 | 10 |
| 3208 | 9.8 |
| 3209 | 9.7 |
| 3210 | 9.8 |
| 3211 | 9.8 |
| 3212 | 11.1 |
| 3213 | 11.8 |
| 3214 | 11.6 |
| 3215 | 12.3 |
| 3216 | 12.1 |
| 3217 | 12.9 |
| 3218 | 12.9 |
| 3219 | 13.1 |
| 3220 | 12.6 |
| 3221 | 12.6 |
| 3222 | 12.4 |
| 3223 | 12.2 |
| 3224 | 11.7 |
| 3225 | 10.9 |
| 3226 | 11 |
| 3227 | 10.9 |
| 3228 | 10.9 |
| 3229 | 11.5 |
| 3230 | 11.2 |
| 3231 | 10.8 |
| 3232 | 10.6 |
| 3233 | 10.6 |
| 3234 | 9.8 |
| 3235 | 10 |
| 3236 | 10.7 |
| 3237 | 12 |
| 3238 | 11.5 |
| 3239 | 12.9 |
| 3240 | 13.8 |
| 3241 | 14.2 |
| 3242 | 14.2 |
| 3243 | 13.9 |
| 3244 | 13.4 |
| 3245 | 13 |
| 3246 | 12.7 |
| 3247 | 11.9 |
| 3248 | 11.3 |
| 3249 | 11.2 |
| 3250 | 11.1 |
| 3251 | 11.2 |
| 3252 | 11.1 |
| 3253 | 10.8 |
| 3254 | 10.8 |
| 3255 | 11 |
| 3256 | 11 |
| 3257 | 11 |
| 3258 | 11.2 |
| 3259 | 11.1 |
| 3260 | 11.3 |
| 3261 | 11.9 |
| 3262 | 12.3 |
| 3263 | 13.6 |
| 3264 | 15.4 |
| 3265 | 16.9 |
| 3266 | 17.5 |
| 3267 | 17.3 |
| 3268 | 16.3 |
| 3269 | 15 |
| 3270 | 14.3 |
| 3271 | 13.9 |
| 3272 | 13.7 |
| 3273 | 13.3 |
| 3274 | 13.2 |
| 3275 | 13 |
| 3276 | 13 |
| 3277 | 12.8 |
| 3278 | 12.9 |
| 3279 | 12.7 |
| 3280 | 12.5 |
| 3281 | 12.4 |
| 3282 | 12.4 |
| 3283 | 12.3 |
| 3284 | 12.1 |
| 3285 | 12.2 |
| 3286 | 13.2 |
| 3287 | 13.9 |
| 3288 | 16.5 |
| 3289 | 16.8 |
| 3290 | 16.8 |
| 3291 | 16.6 |
| 3292 | 16.2 |
| 3293 | 15.8 |
| 3294 | 15 |
| 3295 | 13.8 |
| 3296 | 13.1 |
| 3297 | 13 |
| 3298 | 13.1 |
| 3299 | 13.1 |
| 3300 | 13.1 |
| 3301 | 13.1 |
| 3302 | 13.1 |
| 3303 | 13.2 |
| 3304 | 13.2 |
| 3305 | 13.2 |
| 3306 | 13.2 |
| 3307 | 13.4 |
| 3308 | 13.6 |
| 3309 | 14.2 |
| 3310 | 15.1 |
| 3311 | 15.3 |
| 3312 | 14.2 |
| 3313 | 14.3 |
| 3314 | 14.7 |
| 3315 | 14.8 |
| 3316 | 14.6 |
| 3317 | 14.6 |
| 3318 | 14.5 |
| 3319 | 14.2 |
| 3320 | 14.3 |
| 3321 | 14.4 |
| 3322 | 14.4 |
| 3323 | 14.6 |
| 3324 | 14.1 |
| 3325 | 14.1 |
| 3326 | 14.2 |
| 3327 | 14.2 |
| 3328 | 14.2 |
| 3329 | 13.9 |
| 3330 | 14 |
| 3331 | 13.9 |
| 3332 | 13.7 |
| 3333 | 13.4 |
| 3334 | 14 |
| 3335 | 14.7 |
| 3336 | 14.7 |
| 3337 | 15 |
| 3338 | 15.2 |
| 3339 | 15 |
| 3340 | 14.3 |
| 3341 | 13.7 |
| 3342 | 13.3 |
| 3343 | 12.8 |
| 3344 | 12 |
| 3345 | 11.7 |
| 3346 | 11.4 |
| 3347 | 11.1 |
| 3348 | 10.8 |
| 3349 | 10.8 |
| 3350 | 10.2 |
| 3351 | 10.1 |
| 3352 | 9.9 |
| 3353 | 9.8 |
| 3354 | 9.6 |
| 3355 | 9.9 |
| 3356 | 10.8 |
| 3357 | 10.8 |
| 3358 | 11 |
| 3359 | 11.5 |
| 3360 | 12.3 |
| 3361 | 12 |
| 3362 | 11.6 |
| 3363 | 12.4 |
| 3364 | 12.5 |
| 3365 | 12.6 |
| 3366 | 12.4 |
| 3367 | 11.9 |
| 3368 | 10.8 |
| 3369 | 9.9 |
| 3370 | 9.4 |
| 3371 | 9.2 |
| 3372 | 9.4 |
| 3373 | 9.5 |
| 3374 | 9.3 |
| 3375 | 9.2 |
| 3376 | 9.1 |
| 3377 | 9.1 |
| 3378 | 9.1 |
| 3379 | 9 |
| 3380 | 9.9 |
| 3381 | 10.7 |
| 3382 | 10.9 |
| 3383 | 10.8 |
| 3384 | 12.1 |
| 3385 | 12.8 |
| 3386 | 12.9 |
| 3387 | 13.6 |
| 3388 | 13.1 |
| 3389 | 12.7 |
| 3390 | 12 |
| 3391 | 11.5 |
| 3392 | 10.6 |
| 3393 | 10.2 |
| 3394 | 9.7 |
| 3395 | 9.3 |
| 3396 | 9.1 |
| 3397 | 9.2 |
| 3398 | 9.7 |
| 3399 | 9.8 |
| 3400 | 9.8 |
| 3401 | 9.9 |
| 3402 | 9.7 |
| 3403 | 9.7 |
| 3404 | 10.9 |
| 3405 | 11.6 |
| 3406 | 12.6 |
| 3407 | 13.5 |
| 3408 | 11.8 |
| 3409 | 13.1 |
| 3410 | 13.8 |
| 3411 | 14.1 |
| 3412 | 13.8 |
| 3413 | 13.9 |
| 3414 | 13.5 |
| 3415 | 12.8 |
| 3416 | 11.9 |
| 3417 | 11.3 |
| 3418 | 11.2 |
| 3419 | 11.3 |
| 3420 | 11.1 |
| 3421 | 11 |
| 3422 | 11.2 |
| 3423 | 11.3 |
| 3424 | 10.9 |
| 3425 | 10.7 |
| 3426 | 10.7 |
| 3427 | 11 |
| 3428 | 12.2 |
| 3429 | 11.5 |
| 3430 | 10 |
| 3431 | 11.4 |
| 3432 | 12.3 |
| 3433 | 12.4 |
| 3434 | 13.5 |
| 3435 | 13.4 |
| 3436 | 13.6 |
| 3437 | 13.4 |
| 3438 | 13 |
| 3439 | 12.4 |
| 3440 | 11.8 |
| 3441 | 11.5 |
| 3442 | 11.4 |
| 3443 | 11 |
| 3444 | 11.1 |
| 3445 | 10.9 |
| 3446 | 10.3 |
| 3447 | 10.3 |
| 3448 | 10.3 |
| 3449 | 10 |
| 3450 | 10.1 |
| 3451 | 10.4 |
| 3452 | 11.4 |
| 3453 | 11.8 |
| 3454 | 11.9 |
| 3455 | 12.6 |
| 3456 | 13.6 |
| 3457 | 14.1 |
| 3458 | 14.4 |
| 3459 | 14.1 |
| 3460 | 13.9 |
| 3461 | 13.6 |
| 3462 | 13.4 |
| 3463 | 12.8 |
| 3464 | 12.5 |
| 3465 | 12.8 |
| 3466 | 13.1 |
| 3467 | 13.4 |
| 3468 | 13.3 |
| 3469 | 13.2 |
| 3470 | 12.9 |
| 3471 | 12.3 |
| 3472 | 11.9 |
| 3473 | 12.1 |
| 3474 | 12 |
| 3475 | 12.1 |
| 3476 | 12.7 |
| 3477 | 13.6 |
| 3478 | 13.8 |
| 3479 | 14.1 |
| 3480 | 14.1 |
| 3481 | 14 |
| 3482 | 13.7 |
| 3483 | 14.3 |
| 3484 | 14.9 |
| 3485 | 14.7 |
| 3486 | 14 |
| 3487 | 13.2 |
| 3488 | 12.6 |
| 3489 | 12.5 |
| 3490 | 12.5 |
| 3491 | 12.1 |
| 3492 | 11.8 |
| 3493 | 11.6 |
| 3494 | 11.7 |
| 3495 | 11.8 |
| 3496 | 11.8 |
| 3497 | 11.6 |
| 3498 | 12.3 |
| 3499 | 11.7 |
| 3500 | 11.8 |
| 3501 | 11.5 |
| 3502 | 13.2 |
| 3503 | 13 |
| 3504 | 14.4 |
| 3505 | 14.4 |
| 3506 | 14.5 |
| 3507 | 14.3 |
| 3508 | 13.8 |
| 3509 | 13.2 |
| 3510 | 12.7 |
| 3511 | 11.9 |
| 3512 | 11.5 |
| 3513 | 11.2 |
| 3514 | 11 |
| 3515 | 10.7 |
| 3516 | 10.5 |
| 3517 | 10.5 |
| 3518 | 10.3 |
| 3519 | 10.2 |
| 3520 | 10.3 |
| 3521 | 10.4 |
| 3522 | 10.4 |
| 3523 | 10.1 |
| 3524 | 10.2 |
| 3525 | 11.6 |
| 3526 | 12.6 |
| 3527 | 13.6 |
| 3528 | 14.9 |
| 3529 | 15 |
| 3530 | 14.9 |
| 3531 | 14.6 |
| 3532 | 14.2 |
| 3533 | 13.7 |
| 3534 | 12.8 |
| 3535 | 12.8 |
| 3536 | 12.3 |
| 3537 | 12 |
| 3538 | 11.8 |
| 3539 | 11.5 |
| 3540 | 11.4 |
| 3541 | 11.3 |
| 3542 | 10.9 |
| 3543 | 10.9 |
| 3544 | 11 |
| 3545 | 11.2 |
| 3546 | 11.2 |
| 3547 | 11.4 |
| 3548 | 12 |
| 3549 | 12 |
| 3550 | 11.9 |
| 3551 | 13.1 |
| 3552 | 13.4 |
| 3553 | 14.8 |
| 3554 | 14.2 |
| 3555 | 14 |
| 3556 | 13.9 |
| 3557 | 13.1 |
| 3558 | 12.9 |
| 3559 | 12.5 |
| 3560 | 11.9 |
| 3561 | 11.7 |
| 3562 | 11.6 |
| 3563 | 11.3 |
| 3564 | 11.3 |
| 3565 | 11.4 |
| 3566 | 11.2 |
| 3567 | 11.1 |
| 3568 | 11.2 |
| 3569 | 11.2 |
| 3570 | 11.4 |
| 3571 | 11.5 |
| 3572 | 12.4 |
| 3573 | 12.6 |
| 3574 | 13.2 |
| 3575 | 14.7 |
| 3576 | 14.9 |
| 3577 | 16.2 |
| 3578 | 17 |
| 3579 | 17 |
| 3580 | 16.6 |
| 3581 | 16 |
| 3582 | 15.3 |
| 3583 | 14.5 |
| 3584 | 13.4 |
| 3585 | 13 |
| 3586 | 13 |
| 3587 | 13.1 |
| 3588 | 13 |
| 3589 | 12.7 |
| 3590 | 12.4 |
| 3591 | 12.6 |
| 3592 | 12.7 |
| 3593 | 12.7 |
| 3594 | 12.8 |
| 3595 | 12.8 |
| 3596 | 13.2 |
| 3597 | 13.1 |
| 3598 | 14.5 |
| 3599 | 16 |
| 3600 | 17.8 |
| 3601 | 18.7 |
| 3602 | 18.6 |
| 3603 | 18 |
| 3604 | 17.2 |
| 3605 | 16.3 |
| 3606 | 15.4 |
| 3607 | 14.2 |
| 3608 | 13.1 |
| 3609 | 12.6 |
| 3610 | 12.3 |
| 3611 | 12.2 |
| 3612 | 12 |
| 3613 | 12 |
| 3614 | 11.8 |
| 3615 | 11.8 |
| 3616 | 11.7 |
| 3617 | 11.8 |
| 3618 | 11.7 |
| 3619 | 11.8 |
| 3620 | 12.1 |
| 3621 | 13.2 |
| 3622 | 14.4 |
| 3623 | 15 |
| 3624 | 13.7 |
| 3625 | 15.1 |
| 3626 | 14.8 |
| 3627 | 14.3 |
| 3628 | 13.5 |
| 3629 | 12.8 |
| 3630 | 12.5 |
| 3631 | 12 |
| 3632 | 11.3 |
| 3633 | 10.8 |
| 3634 | 10.6 |
| 3635 | 10.5 |
| 3636 | 10.6 |
| 3637 | 10.7 |
| 3638 | 10.8 |
| 3639 | 10.8 |
| 3640 | 10.9 |
| 3641 | 10.9 |
| 3642 | 10.9 |
| 3643 | 11.2 |
| 3644 | 11.6 |
| 3645 | 13.8 |
| 3646 | 14.7 |
| 3647 | 15.6 |
| 3648 | 15.4 |
| 3649 | 15.8 |
| 3650 | 15.8 |
| 3651 | 15.4 |
| 3652 | 15.2 |
| 3653 | 15.1 |
| 3654 | 14.4 |
| 3655 | 13.7 |
| 3656 | 12.4 |
| 3657 | 11.9 |
| 3658 | 11.6 |
| 3659 | 11.2 |
| 3660 | 10.9 |
| 3661 | 10.5 |
| 3662 | 10.2 |
| 3663 | 9.9 |
| 3664 | 9.8 |
| 3665 | 9.8 |
| 3666 | 9.8 |
| 3667 | 10 |
| 3668 | 10.5 |
| 3669 | 11.8 |
| 3670 | 13.4 |
| 3671 | 14.9 |
| 3672 | 19.3 |
| 3673 | 20.3 |
| 3674 | 20.3 |
| 3675 | 19.9 |
| 3676 | 19 |
| 3677 | 18.2 |
| 3678 | 17.3 |
| 3679 | 16.4 |
| 3680 | 15.1 |
| 3681 | 14.2 |
| 3682 | 13.8 |
| 3683 | 13.7 |
| 3684 | 13.7 |
| 3685 | 13.7 |
| 3686 | 13.7 |
| 3687 | 13.5 |
| 3688 | 13.3 |
| 3689 | 13.3 |
| 3690 | 13.4 |
| 3691 | 13.5 |
| 3692 | 14.5 |
| 3693 | 16.2 |
| 3694 | 17.9 |
| 3695 | 19.9 |
| 3696 | 22.8 |
| 3697 | 23.3 |
| 3698 | 23.1 |
| 3699 | 21.9 |
| 3700 | 19.1 |
| 3701 | 18.4 |
| 3702 | 19.1 |
| 3703 | 18.1 |
| 3704 | 17 |
| 3705 | 16.5 |
| 3706 | 16.3 |
| 3707 | 16.5 |
| 3708 | 16.6 |
| 3709 | 16.6 |
| 3710 | 16.7 |
| 3711 | 17.1 |
| 3712 | 17.3 |
| 3713 | 16.9 |
| 3714 | 17.1 |
| 3715 | 16.9 |
| 3716 | 18 |
| 3717 | 19 |
| 3718 | 20 |
| 3719 | 20.7 |
| 3720 | 21.4 |
| 3721 | 21.4 |
| 3722 | 21.8 |
| 3723 | 21.6 |
| 3724 | 21.3 |
| 3725 | 21.1 |
| 3726 | 20.8 |
| 3727 | 18.1 |
| 3728 | 16.6 |
| 3729 | 15.8 |
| 3730 | 15.4 |
| 3731 | 15.3 |
| 3732 | 15.5 |
| 3733 | 15.5 |
| 3734 | 15.9 |
| 3735 | 15.8 |
| 3736 | 15.3 |
| 3737 | 15 |
| 3738 | 14.7 |
| 3739 | 14.8 |
| 3740 | 15.7 |
| 3741 | 17.2 |
| 3742 | 18.6 |
| 3743 | 19.8 |
| 3744 | 19.8 |
| 3745 | 20.7 |
| 3746 | 21.4 |
| 3747 | 22.2 |
| 3748 | 22.6 |
| 3749 | 22.6 |
| 3750 | 22.7 |
| 3751 | 20.1 |
| 3752 | 17.6 |
| 3753 | 16.9 |
| 3754 | 17.5 |
| 3755 | 18.1 |
| 3756 | 18.4 |
| 3757 | 18.2 |
| 3758 | 18 |
| 3759 | 17.5 |
| 3760 | 17.3 |
| 3761 | 17.2 |
| 3762 | 17.2 |
| 3763 | 17.3 |
| 3764 | 18 |
| 3765 | 19.1 |
| 3766 | 20.1 |
| 3767 | 21 |
| 3768 | 20 |
| 3769 | 20.9 |
| 3770 | 21.5 |
| 3771 | 22 |
| 3772 | 22.2 |
| 3773 | 21.4 |
| 3774 | 19.5 |
| 3775 | 18.4 |
| 3776 | 16.5 |
| 3777 | 15.8 |
| 3778 | 15.6 |
| 3779 | 15.5 |
| 3780 | 15.1 |
| 3781 | 15.2 |
| 3782 | 15.6 |
| 3783 | 15.9 |
| 3784 | 17.2 |
| 3785 | 17 |
| 3786 | 17.6 |
| 3787 | 18.2 |
| 3788 | 19.4 |
| 3789 | 20.8 |
| 3790 | 21.8 |
| 3791 | 22.5 |
| 3792 | 22.6 |
| 3793 | 23.1 |
| 3794 | 23.5 |
| 3795 | 24 |
| 3796 | 22.9 |
| 3797 | 20.6 |
| 3798 | 19.6 |
| 3799 | 18.7 |
| 3800 | 17.7 |
| 3801 | 17.4 |
| 3802 | 17.6 |
| 3803 | 17.7 |
| 3804 | 17.9 |
| 3805 | 18.5 |
| 3806 | 19.6 |
| 3807 | 19.9 |
| 3808 | 19.6 |
| 3809 | 19.4 |
| 3810 | 18.6 |
| 3811 | 18.6 |
| 3812 | 19.1 |
| 3813 | 20.6 |
| 3814 | 21.7 |
| 3815 | 22.4 |
| 3816 | 24 |
| 3817 | 24.8 |
| 3818 | 25.4 |
| 3819 | 25.6 |
| 3820 | 25.3 |
| 3821 | 24.2 |
| 3822 | 22.8 |
| 3823 | 21.6 |
| 3824 | 19.5 |
| 3825 | 18.3 |
| 3826 | 17.6 |
| 3827 | 17.9 |
| 3828 | 18.5 |
| 3829 | 18.7 |
| 3830 | 18 |
| 3831 | 17.4 |
| 3832 | 16.9 |
| 3833 | 17.8 |
| 3834 | 18.9 |
| 3835 | 18.3 |
| 3836 | 18.1 |
| 3837 | 19.4 |
| 3838 | 20.8 |
| 3839 | 22.7 |
| 3840 | 25.2 |
| 3841 | 25.4 |
| 3842 | 25.3 |
| 3843 | 24.7 |
| 3844 | 23.3 |
| 3845 | 21.6 |
| 3846 | 19.8 |
| 3847 | 18.5 |
| 3848 | 16.8 |
| 3849 | 15.6 |
| 3850 | 14.6 |
| 3851 | 14.6 |
| 3852 | 14.9 |
| 3853 | 15 |
| 3854 | 15 |
| 3855 | 14.9 |
| 3856 | 14.7 |
| 3857 | 14.5 |
| 3858 | 14.4 |
| 3859 | 14.5 |
| 3860 | 14.9 |
| 3861 | 16 |
| 3862 | 17.1 |
| 3863 | 18.1 |
| 3864 | 20.5 |
| 3865 | 20.5 |
| 3866 | 19.8 |
| 3867 | 19.2 |
| 3868 | 18.7 |
| 3869 | 17.7 |
| 3870 | 16.3 |
| 3871 | 15.3 |
| 3872 | 14.6 |
| 3873 | 14.2 |
| 3874 | 14.1 |
| 3875 | 14 |
| 3876 | 13.9 |
| 3877 | 13.7 |
| 3878 | 13.6 |
| 3879 | 13.5 |
| 3880 | 13.5 |
| 3881 | 13.4 |
| 3882 | 13 |
| 3883 | 13.2 |
| 3884 | 14.6 |
| 3885 | 15.9 |
| 3886 | 17 |
| 3887 | 17.9 |
| 3888 | 17.1 |
| 3889 | 18.1 |
| 3890 | 17.9 |
| 3891 | 17.2 |
| 3892 | 16.5 |
| 3893 | 15.9 |
| 3894 | 15.8 |
| 3895 | 15.4 |
| 3896 | 15.1 |
| 3897 | 15 |
| 3898 | 15.1 |
| 3899 | 15 |
| 3900 | 14.9 |
| 3901 | 14.7 |
| 3902 | 14.5 |
| 3903 | 14.4 |
| 3904 | 14.3 |
| 3905 | 14.5 |
| 3906 | 14.5 |
| 3907 | 14.6 |
| 3908 | 14.7 |
| 3909 | 15.5 |
| 3910 | 16.2 |
| 3911 | 16.9 |
| 3912 | 14.3 |
| 3913 | 14.5 |
| 3914 | 15.6 |
| 3915 | 16.3 |
| 3916 | 16.1 |
| 3917 | 15.6 |
| 3918 | 14.9 |
| 3919 | 14.2 |
| 3920 | 13.3 |
| 3921 | 13.1 |
| 3922 | 13 |
| 3923 | 12.9 |
| 3924 | 12.9 |
| 3925 | 12.8 |
| 3926 | 12.7 |
| 3927 | 12.6 |
| 3928 | 12.4 |
| 3929 | 12 |
| 3930 | 11.9 |
| 3931 | 12.2 |
| 3932 | 13 |
| 3933 | 12.8 |
| 3934 | 13 |
| 3935 | 14.2 |
| 3936 | 17.3 |
| 3937 | 17.2 |
| 3938 | 16.3 |
| 3939 | 15.5 |
| 3940 | 15 |
| 3941 | 14.4 |
| 3942 | 13.8 |
| 3943 | 13.2 |
| 3944 | 12.2 |
| 3945 | 11.6 |
| 3946 | 11.3 |
| 3947 | 11.1 |
| 3948 | 10.9 |
| 3949 | 10.7 |
| 3950 | 10.7 |
| 3951 | 10.8 |
| 3952 | 11 |
| 3953 | 11.2 |
| 3954 | 11.3 |
| 3955 | 11.6 |
| 3956 | 12.2 |
| 3957 | 13.1 |
| 3958 | 14.2 |
| 3959 | 15 |
| 3960 | 21 |
| 3961 | 21.4 |
| 3962 | 20.6 |
| 3963 | 19 |
| 3964 | 17.8 |
| 3965 | 16.9 |
| 3966 | 15.9 |
| 3967 | 15 |
| 3968 | 13.7 |
| 3969 | 12.8 |
| 3970 | 12.4 |
| 3971 | 12.1 |
| 3972 | 12 |
| 3973 | 11.9 |
| 3974 | 11.8 |
| 3975 | 11.7 |
| 3976 | 11.7 |
| 3977 | 11.7 |
| 3978 | 11.6 |
| 3979 | 11.9 |
| 3980 | 13.2 |
| 3981 | 14.7 |
| 3982 | 16 |
| 3983 | 16.4 |
| 3984 | 19.4 |
| 3985 | 19.8 |
| 3986 | 20.8 |
| 3987 | 20.9 |
| 3988 | 20.2 |
| 3989 | 19.2 |
| 3990 | 17.6 |
| 3991 | 15.9 |
| 3992 | 14.5 |
| 3993 | 13.8 |
| 3994 | 13.6 |
| 3995 | 13.3 |
| 3996 | 13.3 |
| 3997 | 13.3 |
| 3998 | 13.3 |
| 3999 | 13.5 |
| 4000 | 13.4 |
| 4001 | 13.2 |
| 4002 | 13 |
| 4003 | 13.1 |
| 4004 | 14.3 |
| 4005 | 15.9 |
| 4006 | 17.7 |
| 4007 | 19.1 |
| 4008 | 24.7 |
| 4009 | 24.9 |
| 4010 | 24.2 |
| 4011 | 22.8 |
| 4012 | 21.8 |
| 4013 | 20.9 |
| 4014 | 20.1 |
| 4015 | 19.3 |
| 4016 | 17.9 |
| 4017 | 17.1 |
| 4018 | 16.8 |
| 4019 | 16.4 |
| 4020 | 15.8 |
| 4021 | 15.4 |
| 4022 | 15.3 |
| 4023 | 15.1 |
| 4024 | 15.2 |
| 4025 | 15.4 |
| 4026 | 15.9 |
| 4027 | 16.6 |
| 4028 | 17.9 |
| 4029 | 19.7 |
| 4030 | 21.5 |
| 4031 | 24.1 |
| 4032 | 27.4 |
| 4033 | 27.8 |
| 4034 | 27.4 |
| 4035 | 25.4 |
| 4036 | 23.1 |
| 4037 | 21.6 |
| 4038 | 20.5 |
| 4039 | 19.5 |
| 4040 | 18.3 |
| 4041 | 17.3 |
| 4042 | 17 |
| 4043 | 16.6 |
| 4044 | 16.3 |
| 4045 | 15.9 |
| 4046 | 15.4 |
| 4047 | 15 |
| 4048 | 14.7 |
| 4049 | 14.5 |
| 4050 | 14.4 |
| 4051 | 14.5 |
| 4052 | 15.2 |
| 4053 | 16.1 |
| 4054 | 17.3 |
| 4055 | 19.1 |
| 4056 | 24 |
| 4057 | 24.7 |
| 4058 | 24.7 |
| 4059 | 24.4 |
| 4060 | 23.3 |
| 4061 | 21.5 |
| 4062 | 19.6 |
| 4063 | 18.2 |
| 4064 | 16.8 |
| 4065 | 16.1 |
| 4066 | 15.9 |
| 4067 | 15.6 |
| 4068 | 15.3 |
| 4069 | 15 |
| 4070 | 14.7 |
| 4071 | 14.6 |
| 4072 | 14.7 |
| 4073 | 14.4 |
| 4074 | 14.3 |
| 4075 | 14.4 |
| 4076 | 14.9 |
| 4077 | 16.7 |
| 4078 | 18.1 |
| 4079 | 18.8 |
| 4080 | 17.2 |
| 4081 | 17.8 |
| 4082 | 18.3 |
| 4083 | 18.1 |
| 4084 | 17.3 |
| 4085 | 16.5 |
| 4086 | 15.9 |
| 4087 | 15.1 |
| 4088 | 14.3 |
| 4089 | 14 |
| 4090 | 13.9 |
| 4091 | 13.9 |
| 4092 | 13.7 |
| 4093 | 13.6 |
| 4094 | 13.5 |
| 4095 | 13.4 |
| 4096 | 13.3 |
| 4097 | 13.3 |
| 4098 | 13.3 |
| 4099 | 13.4 |
| 4100 | 13.6 |
| 4101 | 13.5 |
| 4102 | 14.4 |
| 4103 | 15.9 |
| 4104 | 15.6 |
| 4105 | 17 |
| 4106 | 17.1 |
| 4107 | 17.1 |
| 4108 | 16.7 |
| 4109 | 16.3 |
| 4110 | 15.6 |
| 4111 | 15 |
| 4112 | 14.1 |
| 4113 | 13.6 |
| 4114 | 13.3 |
| 4115 | 13.3 |
| 4116 | 13.2 |
| 4117 | 13.2 |
| 4118 | 13.3 |
| 4119 | 13.4 |
| 4120 | 13.8 |
| 4121 | 13.9 |
| 4122 | 14 |
| 4123 | 13.8 |
| 4124 | 13.8 |
| 4125 | 16.6 |
| 4126 | 18.4 |
| 4127 | 19.3 |
| 4128 | 22.6 |
| 4129 | 22.9 |
| 4130 | 22.6 |
| 4131 | 21.9 |
| 4132 | 21.1 |
| 4133 | 20.5 |
| 4134 | 19.8 |
| 4135 | 18.8 |
| 4136 | 17.5 |
| 4137 | 16.5 |
| 4138 | 16 |
| 4139 | 15.7 |
| 4140 | 15.4 |
| 4141 | 15.2 |
| 4142 | 15.2 |
| 4143 | 15.2 |
| 4144 | 15.1 |
| 4145 | 15 |
| 4146 | 14.8 |
| 4147 | 14.7 |
| 4148 | 15.4 |
| 4149 | 18.2 |
| 4150 | 20.4 |
| 4151 | 21.7 |
| 4152 | 22.6 |
| 4153 | 24.9 |
| 4154 | 25.1 |
| 4155 | 23.7 |
| 4156 | 21.7 |
| 4157 | 19.9 |
| 4158 | 18.6 |
| 4159 | 17.5 |
| 4160 | 16.5 |
| 4161 | 16.1 |
| 4162 | 15.9 |
| 4163 | 15.5 |
| 4164 | 15.3 |
| 4165 | 15.2 |
| 4166 | 15.2 |
| 4167 | 15.2 |
| 4168 | 15.2 |
| 4169 | 15 |
| 4170 | 14.8 |
| 4171 | 14.8 |
| 4172 | 16.2 |
| 4173 | 18.3 |
| 4174 | 19.6 |
| 4175 | 20.3 |
| 4176 | 23.3 |
| 4177 | 24.8 |
| 4178 | 24.8 |
| 4179 | 24.2 |
| 4180 | 23.4 |
| 4181 | 22.4 |
| 4182 | 20.9 |
| 4183 | 19.6 |
| 4184 | 18.6 |
| 4185 | 17.9 |
| 4186 | 17.7 |
| 4187 | 17.7 |
| 4188 | 17.6 |
| 4189 | 17.4 |
| 4190 | 17.1 |
| 4191 | 17 |
| 4192 | 17.1 |
| 4193 | 16.9 |
| 4194 | 16.8 |
| 4195 | 17.8 |
| 4196 | 19.2 |
| 4197 | 21.3 |
| 4198 | 24 |
| 4199 | 25.5 |
| 4200 | 29.5 |
| 4201 | 30.6 |
| 4202 | 31 |
| 4203 | 29.5 |
| 4204 | 26.9 |
| 4205 | 25.6 |
| 4206 | 24.3 |
| 4207 | 23 |
| 4208 | 21 |
| 4209 | 20.1 |
| 4210 | 19.7 |
| 4211 | 19.6 |
| 4212 | 19.6 |
| 4213 | 19.5 |
| 4214 | 19 |
| 4215 | 18.4 |
| 4216 | 17.6 |
| 4217 | 17.3 |
| 4218 | 17.6 |
| 4219 | 18.2 |
| 4220 | 19.8 |
| 4221 | 21.3 |
| 4222 | 23.1 |
| 4223 | 24.7 |
| 4224 | 23.3 |
| 4225 | 22.4 |
| 4226 | 20.8 |
| 4227 | 20.8 |
| 4228 | 21.5 |
| 4229 | 20.7 |
| 4230 | 19.5 |
| 4231 | 18 |
| 4232 | 16.8 |
| 4233 | 16.1 |
| 4234 | 16 |
| 4235 | 15.9 |
| 4236 | 16.1 |
| 4237 | 16.1 |
| 4238 | 16.2 |
| 4239 | 16.2 |
| 4240 | 16.1 |
| 4241 | 16 |
| 4242 | 16 |
| 4243 | 15.9 |
| 4244 | 17 |
| 4245 | 18.4 |
| 4246 | 19.9 |
| 4247 | 20.9 |
| 4248 | 22.2 |
| 4249 | 22 |
| 4250 | 21.5 |
| 4251 | 20.7 |
| 4252 | 19.8 |
| 4253 | 18 |
| 4254 | 17.3 |
| 4255 | 16.9 |
| 4256 | 15.6 |
| 4257 | 14.8 |
| 4258 | 14.6 |
| 4259 | 14.5 |
| 4260 | 14.5 |
| 4261 | 14.4 |
| 4262 | 14.2 |
| 4263 | 13.9 |
| 4264 | 13.9 |
| 4265 | 13.7 |
| 4266 | 13.5 |
| 4267 | 13.5 |
| 4268 | 14.1 |
| 4269 | 16.2 |
| 4270 | 18.1 |
| 4271 | 19.3 |
| 4272 | 20.4 |
| 4273 | 20.4 |
| 4274 | 20.2 |
| 4275 | 19.7 |
| 4276 | 19.1 |
| 4277 | 18.4 |
| 4278 | 17.4 |
| 4279 | 16.4 |
| 4280 | 15.6 |
| 4281 | 15.1 |
| 4282 | 14.8 |
| 4283 | 14.7 |
| 4284 | 14.7 |
| 4285 | 14.9 |
| 4286 | 15.1 |
| 4287 | 15.1 |
| 4288 | 15.1 |
| 4289 | 15.2 |
| 4290 | 15.2 |
| 4291 | 15.2 |
| 4292 | 15.2 |
| 4293 | 15.6 |
| 4294 | 16.5 |
| 4295 | 18.8 |
| 4296 | 17.6 |
| 4297 | 17.6 |
| 4298 | 17.4 |
| 4299 | 17 |
| 4300 | 16.5 |
| 4301 | 15.7 |
| 4302 | 15 |
| 4303 | 14.2 |
| 4304 | 13.6 |
| 4305 | 13.3 |
| 4306 | 13.1 |
| 4307 | 12.9 |
| 4308 | 12.9 |
| 4309 | 12.8 |
| 4310 | 12.9 |
| 4311 | 12.7 |
| 4312 | 12.7 |
| 4313 | 12.7 |
| 4314 | 12.5 |
| 4315 | 12.5 |
| 4316 | 13.4 |
| 4317 | 14.8 |
| 4318 | 16 |
| 4319 | 16.4 |
| 4320 | 16.4 |
| 4321 | 16.7 |
| 4322 | 16.9 |
| 4323 | 16.5 |
| 4324 | 15.8 |
| 4325 | 15.1 |
| 4326 | 14.5 |
| 4327 | 14.1 |
| 4328 | 13.6 |
| 4329 | 13.3 |
| 4330 | 13.2 |
| 4331 | 13 |
| 4332 | 13 |
| 4333 | 13.1 |
| 4334 | 13.3 |
| 4335 | 13.6 |
| 4336 | 13.9 |
| 4337 | 13.8 |
| 4338 | 13.8 |
| 4339 | 13.9 |
| 4340 | 14.3 |
| 4341 | 14.9 |
| 4342 | 15.7 |
| 4343 | 18.1 |
| 4344 | 20.5 |
| 4345 | 20.9 |
| 4346 | 21.1 |
| 4347 | 21.1 |
| 4348 | 20.8 |
| 4349 | 20.3 |
| 4350 | 19.4 |
| 4351 | 18.1 |
| 4352 | 17.2 |
| 4353 | 17.1 |
| 4354 | 17.1 |
| 4355 | 17.1 |
| 4356 | 17.2 |
| 4357 | 17.3 |
| 4358 | 17.8 |
| 4359 | 17.4 |
| 4360 | 17.3 |
| 4361 | 17 |
| 4362 | 17 |
| 4363 | 17.4 |
| 4364 | 17.7 |
| 4365 | 16.9 |
| 4366 | 16.9 |
| 4367 | 17.2 |
| 4368 | 20.6 |
| 4369 | 20.7 |
| 4370 | 19.9 |
| 4371 | 19.2 |
| 4372 | 18.4 |
| 4373 | 17.5 |
| 4374 | 16.5 |
| 4375 | 15.6 |
| 4376 | 14.3 |
| 4377 | 13.5 |
| 4378 | 13.1 |
| 4379 | 12.7 |
| 4380 | 12.5 |
| 4381 | 12.3 |
| 4382 | 12.1 |
| 4383 | 11.9 |
| 4384 | 11.7 |
| 4385 | 11.6 |
| 4386 | 11.5 |
| 4387 | 12.1 |
| 4388 | 13.6 |
| 4389 | 14.8 |
| 4390 | 15.7 |
| 4391 | 16.3 |
| 4392 | 16 |
| 4393 | 16 |
| 4394 | 16.1 |
| 4395 | 16.1 |
| 4396 | 15.9 |
| 4397 | 15.4 |
| 4398 | 14.8 |
| 4399 | 14.2 |
| 4400 | 13.6 |
| 4401 | 13 |
| 4402 | 12.6 |
| 4403 | 12.5 |
| 4404 | 12.3 |
| 4405 | 12.1 |
| 4406 | 12 |
| 4407 | 11.9 |
| 4408 | 11.6 |
| 4409 | 11.3 |
| 4410 | 11.4 |
| 4411 | 12 |
| 4412 | 13.2 |
| 4413 | 14.2 |
| 4414 | 15.2 |
| 4415 | 15.5 |
| 4416 | 16 |
| 4417 | 16.1 |
| 4418 | 16.1 |
| 4419 | 16.2 |
| 4420 | 16.2 |
| 4421 | 15.9 |
| 4422 | 15.5 |
| 4423 | 14.7 |
| 4424 | 13.7 |
| 4425 | 13.1 |
| 4426 | 12.9 |
| 4427 | 12.9 |
| 4428 | 13 |
| 4429 | 13 |
| 4430 | 13 |
| 4431 | 13 |
| 4432 | 13.4 |
| 4433 | 13.3 |
| 4434 | 13.3 |
| 4435 | 14.2 |
| 4436 | 15.1 |
| 4437 | 15.4 |
| 4438 | 17.3 |
| 4439 | 18.6 |
| 4440 | 19.5 |
| 4441 | 20.3 |
| 4442 | 20.1 |
| 4443 | 19 |
| 4444 | 18.1 |
| 4445 | 17.3 |
| 4446 | 16.5 |
| 4447 | 15.6 |
| 4448 | 14.5 |
| 4449 | 13.9 |
| 4450 | 13.6 |
| 4451 | 13.4 |
| 4452 | 13.3 |
| 4453 | 13.1 |
| 4454 | 13 |
| 4455 | 12.9 |
| 4456 | 12.8 |
| 4457 | 12.5 |
| 4458 | 12.3 |
| 4459 | 12.3 |
| 4460 | 13.5 |
| 4461 | 15 |
| 4462 | 16.6 |
| 4463 | 17.6 |
| 4464 | 19 |
| 4465 | 19.5 |
| 4466 | 19.6 |
| 4467 | 19.6 |
| 4468 | 19.1 |
| 4469 | 18.3 |
| 4470 | 17.4 |
| 4471 | 16.4 |
| 4472 | 15.1 |
| 4473 | 14.4 |
| 4474 | 14.2 |
| 4475 | 14.1 |
| 4476 | 13.9 |
| 4477 | 14.1 |
| 4478 | 14.2 |
| 4479 | 14.1 |
| 4480 | 14.1 |
| 4481 | 14 |
| 4482 | 13.8 |
| 4483 | 14.1 |
| 4484 | 15.3 |
| 4485 | 16.7 |
| 4486 | 17.9 |
| 4487 | 18.9 |
| 4488 | 21.1 |
| 4489 | 21.2 |
| 4490 | 21.2 |
| 4491 | 21.1 |
| 4492 | 20.6 |
| 4493 | 19.8 |
| 4494 | 18.9 |
| 4495 | 17.7 |
| 4496 | 16.5 |
| 4497 | 16.4 |
| 4498 | 16.5 |
| 4499 | 16.6 |
| 4500 | 16.7 |
| 4501 | 16.5 |
| 4502 | 16.6 |
| 4503 | 16.6 |
| 4504 | 16.6 |
| 4505 | 16.6 |
| 4506 | 16.5 |
| 4507 | 16.5 |
| 4508 | 16.3 |
| 4509 | 17.1 |
| 4510 | 18.1 |
| 4511 | 19 |
| 4512 | 18.4 |
| 4513 | 19.3 |
| 4514 | 19.5 |
| 4515 | 19.1 |
| 4516 | 18.6 |
| 4517 | 18.2 |
| 4518 | 17.3 |
| 4519 | 16.2 |
| 4520 | 14.8 |
| 4521 | 14.1 |
| 4522 | 13.8 |
| 4523 | 13.6 |
| 4524 | 13.6 |
| 4525 | 13.6 |
| 4526 | 13.3 |
| 4527 | 13.2 |
| 4528 | 13 |
| 4529 | 13 |
| 4530 | 12.8 |
| 4531 | 13.3 |
| 4532 | 13.3 |
| 4533 | 13.2 |
| 4534 | 14.3 |
| 4535 | 15.5 |
| 4536 | 15.4 |
| 4537 | 16.4 |
| 4538 | 16.1 |
| 4539 | 15.7 |
| 4540 | 15.7 |
| 4541 | 15.4 |
| 4542 | 15.3 |
| 4543 | 14.9 |
| 4544 | 14 |
| 4545 | 13.3 |
| 4546 | 12.9 |
| 4547 | 12.8 |
| 4548 | 12.9 |
| 4549 | 13 |
| 4550 | 13 |
| 4551 | 13 |
| 4552 | 13 |
| 4553 | 12.8 |
| 4554 | 12.5 |
| 4555 | 12.7 |
| 4556 | 14 |
| 4557 | 15.3 |
| 4558 | 16.6 |
| 4559 | 17.6 |
| 4560 | 20.1 |
| 4561 | 20.7 |
| 4562 | 20.5 |
| 4563 | 19.4 |
| 4564 | 18.6 |
| 4565 | 17.8 |
| 4566 | 17 |
| 4567 | 16.1 |
| 4568 | 14.9 |
| 4569 | 14.1 |
| 4570 | 13.8 |
| 4571 | 13.7 |
| 4572 | 13.6 |
| 4573 | 13.5 |
| 4574 | 13.4 |
| 4575 | 13.3 |
| 4576 | 13.4 |
| 4577 | 13.6 |
| 4578 | 13.8 |
| 4579 | 13.9 |
| 4580 | 14.3 |
| 4581 | 16.7 |
| 4582 | 18.1 |
| 4583 | 19.3 |
| 4584 | 24.7 |
| 4585 | 25.7 |
| 4586 | 26.2 |
| 4587 | 25.9 |
| 4588 | 24.1 |
| 4589 | 21.8 |
| 4590 | 21.3 |
| 4591 | 20.6 |
| 4592 | 19.4 |
| 4593 | 18.6 |
| 4594 | 17.9 |
| 4595 | 17.8 |
| 4596 | 17.9 |
| 4597 | 18.9 |
| 4598 | 18.7 |
| 4599 | 19.1 |
| 4600 | 19.8 |
| 4601 | 19.7 |
| 4602 | 19.7 |
| 4603 | 19.8 |
| 4604 | 20 |
| 4605 | 21.6 |
| 4606 | 23.9 |
| 4607 | 25.6 |
| 4608 | 27.7 |
| 4609 | 28.6 |
| 4610 | 28.5 |
| 4611 | 27.2 |
| 4612 | 26 |
| 4613 | 24.9 |
| 4614 | 23.3 |
| 4615 | 22 |
| 4616 | 20.3 |
| 4617 | 19.3 |
| 4618 | 19 |
| 4619 | 18.7 |
| 4620 | 18.5 |
| 4621 | 18.6 |
| 4622 | 18.4 |
| 4623 | 18.1 |
| 4624 | 17.9 |
| 4625 | 17.6 |
| 4626 | 17.3 |
| 4627 | 17.6 |
| 4628 | 19.2 |
| 4629 | 20.8 |
| 4630 | 22.3 |
| 4631 | 24.3 |
| 4632 | 26.4 |
| 4633 | 27 |
| 4634 | 27 |
| 4635 | 26.4 |
| 4636 | 24.9 |
| 4637 | 23.1 |
| 4638 | 21.4 |
| 4639 | 20.2 |
| 4640 | 18.7 |
| 4641 | 18.2 |
| 4642 | 18.2 |
| 4643 | 17.8 |
| 4644 | 17 |
| 4645 | 16.7 |
| 4646 | 16.7 |
| 4647 | 16.9 |
| 4648 | 17 |
| 4649 | 17 |
| 4650 | 16.7 |
| 4651 | 16.5 |
| 4652 | 17.6 |
| 4653 | 19.3 |
| 4654 | 21.1 |
| 4655 | 22.2 |
| 4656 | 23.3 |
| 4657 | 23.1 |
| 4658 | 23.3 |
| 4659 | 22.9 |
| 4660 | 22.2 |
| 4661 | 21.1 |
| 4662 | 20 |
| 4663 | 18.7 |
| 4664 | 17.4 |
| 4665 | 16.9 |
| 4666 | 16.8 |
| 4667 | 16.8 |
| 4668 | 16.8 |
| 4669 | 16.8 |
| 4670 | 16.6 |
| 4671 | 16.4 |
| 4672 | 16.2 |
| 4673 | 16.1 |
| 4674 | 15.9 |
| 4675 | 16 |
| 4676 | 16.4 |
| 4677 | 17.4 |
| 4678 | 18.5 |
| 4679 | 19.2 |
| 4680 | 28.9 |
| 4681 | 30.1 |
| 4682 | 30.6 |
| 4683 | 29.4 |
| 4684 | 25.3 |
| 4685 | 23.5 |
| 4686 | 22.4 |
| 4687 | 21.2 |
| 4688 | 19.7 |
| 4689 | 19.1 |
| 4690 | 19.2 |
| 4691 | 19.1 |
| 4692 | 19.1 |
| 4693 | 18.8 |
| 4694 | 18.1 |
| 4695 | 17.8 |
| 4696 | 17.4 |
| 4697 | 17.2 |
| 4698 | 17.3 |
| 4699 | 17.7 |
| 4700 | 18.5 |
| 4701 | 20.5 |
| 4702 | 22.7 |
| 4703 | 25.9 |
| 4704 | 26.3 |
| 4705 | 27.2 |
| 4706 | 27.8 |
| 4707 | 28.2 |
| 4708 | 27.6 |
| 4709 | 24.8 |
| 4710 | 23.1 |
| 4711 | 21.8 |
| 4712 | 20.1 |
| 4713 | 19.4 |
| 4714 | 19.2 |
| 4715 | 19.1 |
| 4716 | 19.2 |
| 4717 | 19.1 |
| 4718 | 19.3 |
| 4719 | 19.4 |
| 4720 | 19 |
| 4721 | 18.6 |
| 4722 | 18.1 |
| 4723 | 18.2 |
| 4724 | 19.7 |
| 4725 | 21.6 |
| 4726 | 23.2 |
| 4727 | 24.3 |
| 4728 | 25.3 |
| 4729 | 26.5 |
| 4730 | 26.7 |
| 4731 | 25.1 |
| 4732 | 22.6 |
| 4733 | 21.6 |
| 4734 | 20.6 |
| 4735 | 19.2 |
| 4736 | 18.1 |
| 4737 | 17.3 |
| 4738 | 16.8 |
| 4739 | 16.5 |
| 4740 | 16.4 |
| 4741 | 16.3 |
| 4742 | 16.1 |
| 4743 | 15.9 |
| 4744 | 15.8 |
| 4745 | 15.7 |
| 4746 | 15.6 |
| 4747 | 16.2 |
| 4748 | 17.6 |
| 4749 | 19.2 |
| 4750 | 20.9 |
| 4751 | 21.8 |
| 4752 | 26 |
| 4753 | 26.7 |
| 4754 | 26.8 |
| 4755 | 25.7 |
| 4756 | 23.8 |
| 4757 | 21.9 |
| 4758 | 20.7 |
| 4759 | 19.5 |
| 4760 | 18.3 |
| 4761 | 18.2 |
| 4762 | 18.8 |
| 4763 | 19.1 |
| 4764 | 19.3 |
| 4765 | 19.4 |
| 4766 | 19.4 |
| 4767 | 19.4 |
| 4768 | 19.6 |
| 4769 | 19.9 |
| 4770 | 19.6 |
| 4771 | 19.6 |
| 4772 | 20.3 |
| 4773 | 22 |
| 4774 | 23.6 |
| 4775 | 25.8 |
| 4776 | 28.3 |
| 4777 | 29.1 |
| 4778 | 29.6 |
| 4779 | 29.6 |
| 4780 | 28.3 |
| 4781 | 25.4 |
| 4782 | 23.2 |
| 4783 | 21.2 |
| 4784 | 19.4 |
| 4785 | 18.7 |
| 4786 | 19.2 |
| 4787 | 20.1 |
| 4788 | 20.9 |
| 4789 | 21 |
| 4790 | 20.8 |
| 4791 | 20.5 |
| 4792 | 20 |
| 4793 | 19.5 |
| 4794 | 18.8 |
| 4795 | 17.9 |
| 4796 | 18.3 |
| 4797 | 20.4 |
| 4798 | 23.4 |
| 4799 | 24.8 |
| 4800 | 22.1 |
| 4801 | 22 |
| 4802 | 20.4 |
| 4803 | 18.9 |
| 4804 | 18 |
| 4805 | 17.9 |
| 4806 | 17.4 |
| 4807 | 16.4 |
| 4808 | 15.1 |
| 4809 | 14.5 |
| 4810 | 14.2 |
| 4811 | 14.1 |
| 4812 | 13.9 |
| 4813 | 13.7 |
| 4814 | 13.5 |
| 4815 | 13.5 |
| 4816 | 13.4 |
| 4817 | 13.3 |
| 4818 | 13.9 |
| 4819 | 13.9 |
| 4820 | 14.5 |
| 4821 | 15.4 |
| 4822 | 15.9 |
| 4823 | 16.6 |
| 4824 | 17.8 |
| 4825 | 18.1 |
| 4826 | 18 |
| 4827 | 17.6 |
| 4828 | 17.4 |
| 4829 | 17.3 |
| 4830 | 17.1 |
| 4831 | 16.4 |
| 4832 | 15.4 |
| 4833 | 15.1 |
| 4834 | 15.2 |
| 4835 | 15.4 |
| 4836 | 15.4 |
| 4837 | 15.7 |
| 4838 | 16.1 |
| 4839 | 16.5 |
| 4840 | 16.4 |
| 4841 | 16.3 |
| 4842 | 16.5 |
| 4843 | 16.4 |
| 4844 | 16.7 |
| 4845 | 16.5 |
| 4846 | 16.6 |
| 4847 | 17.3 |
| 4848 | 18.4 |
| 4849 | 20.3 |
| 4850 | 20.9 |
| 4851 | 21.2 |
| 4852 | 20.9 |
| 4853 | 20.1 |
| 4854 | 18.8 |
| 4855 | 18.1 |
| 4856 | 17.8 |
| 4857 | 17.7 |
| 4858 | 17.7 |
| 4859 | 17.7 |
| 4860 | 17.7 |
| 4861 | 17.6 |
| 4862 | 17.5 |
| 4863 | 17.3 |
| 4864 | 17.1 |
| 4865 | 17 |
| 4866 | 17 |
| 4867 | 17 |
| 4868 | 17.3 |
| 4869 | 19.2 |
| 4870 | 19.6 |
| 4871 | 20.4 |
| 4872 | 20.1 |
| 4873 | 20.9 |
| 4874 | 21 |
| 4875 | 20.5 |
| 4876 | 19.6 |
| 4877 | 18.8 |
| 4878 | 17.9 |
| 4879 | 16.9 |
| 4880 | 15.8 |
| 4881 | 15.4 |
| 4882 | 15.1 |
| 4883 | 15.1 |
| 4884 | 14.8 |
| 4885 | 14.6 |
| 4886 | 14.4 |
| 4887 | 14.3 |
| 4888 | 14.2 |
| 4889 | 14.2 |
| 4890 | 14.1 |
| 4891 | 14.3 |
| 4892 | 15.5 |
| 4893 | 15.8 |
| 4894 | 16.1 |
| 4895 | 17.1 |
| 4896 | 20.8 |
| 4897 | 21.8 |
| 4898 | 21.9 |
| 4899 | 21.5 |
| 4900 | 20.7 |
| 4901 | 19.8 |
| 4902 | 18.8 |
| 4903 | 17.6 |
| 4904 | 17.5 |
| 4905 | 17.6 |
| 4906 | 17.6 |
| 4907 | 17.5 |
| 4908 | 17.2 |
| 4909 | 16.7 |
| 4910 | 16.3 |
| 4911 | 15.8 |
| 4912 | 15.2 |
| 4913 | 14.8 |
| 4914 | 14.3 |
| 4915 | 14 |
| 4916 | 14.5 |
| 4917 | 15.5 |
| 4918 | 16.2 |
| 4919 | 17 |
| 4920 | 18.7 |
| 4921 | 18.9 |
| 4922 | 18.9 |
| 4923 | 18.7 |
| 4924 | 18.1 |
| 4925 | 17.5 |
| 4926 | 16.6 |
| 4927 | 15.8 |
| 4928 | 15 |
| 4929 | 14.2 |
| 4930 | 13.9 |
| 4931 | 13.6 |
| 4932 | 13.4 |
| 4933 | 13.2 |
| 4934 | 13 |
| 4935 | 12.8 |
| 4936 | 12.8 |
| 4937 | 12.7 |
| 4938 | 12.4 |
| 4939 | 12.6 |
| 4940 | 13.5 |
| 4941 | 14.6 |
| 4942 | 15.5 |
| 4943 | 16.7 |
| 4944 | 18.7 |
| 4945 | 19 |
| 4946 | 18.6 |
| 4947 | 18.2 |
| 4948 | 17.9 |
| 4949 | 17.5 |
| 4950 | 16.7 |
| 4951 | 15.7 |
| 4952 | 14.6 |
| 4953 | 14.1 |
| 4954 | 14 |
| 4955 | 13.8 |
| 4956 | 13.7 |
| 4957 | 13.7 |
| 4958 | 13.6 |
| 4959 | 13.6 |
| 4960 | 13.6 |
| 4961 | 13.6 |
| 4962 | 13.8 |
| 4963 | 14.1 |
| 4964 | 14.4 |
| 4965 | 15.3 |
| 4966 | 16.3 |
| 4967 | 17.5 |
| 4968 | 20.7 |
| 4969 | 21.3 |
| 4970 | 21.4 |
| 4971 | 21.1 |
| 4972 | 20.7 |
| 4973 | 20.1 |
| 4974 | 19.1 |
| 4975 | 17.8 |
| 4976 | 16.7 |
| 4977 | 16.4 |
| 4978 | 16.2 |
| 4979 | 16 |
| 4980 | 15.8 |
| 4981 | 15.8 |
| 4982 | 16.1 |
| 4983 | 16.3 |
| 4984 | 16.5 |
| 4985 | 16.5 |
| 4986 | 16.4 |
| 4987 | 16.3 |
| 4988 | 17 |
| 4989 | 18.2 |
| 4990 | 19.6 |
| 4991 | 20.4 |
| 4992 | 21.2 |
| 4993 | 21.6 |
| 4994 | 20.9 |
| 4995 | 20.8 |
| 4996 | 20.5 |
| 4997 | 19.7 |
| 4998 | 18.4 |
| 4999 | 18.1 |
| 5000 | 17.6 |
| 5001 | 17.4 |
| 5002 | 17.5 |
| 5003 | 17.5 |
| 5004 | 17.3 |
| 5005 | 16.8 |
| 5006 | 16.6 |
| 5007 | 16.2 |
| 5008 | 15.9 |
| 5009 | 15.6 |
| 5010 | 15.3 |
| 5011 | 15 |
| 5012 | 15 |
| 5013 | 15.5 |
| 5014 | 16.4 |
| 5015 | 16.9 |
| 5016 | 17.4 |
| 5017 | 17.3 |
| 5018 | 17.2 |
| 5019 | 17.3 |
| 5020 | 17.1 |
| 5021 | 16.6 |
| 5022 | 16 |
| 5023 | 15.3 |
| 5024 | 14.6 |
| 5025 | 14.2 |
| 5026 | 14.1 |
| 5027 | 14 |
| 5028 | 14 |
| 5029 | 14.1 |
| 5030 | 14.1 |
| 5031 | 14.2 |
| 5032 | 14.4 |
| 5033 | 14.5 |
| 5034 | 14.5 |
| 5035 | 14.7 |
| 5036 | 16.1 |
| 5037 | 17.4 |
| 5038 | 18.8 |
| 5039 | 19.5 |
| 5040 | 22.8 |
| 5041 | 23.5 |
| 5042 | 23.5 |
| 5043 | 23.5 |
| 5044 | 23.1 |
| 5045 | 22.3 |
| 5046 | 21.3 |
| 5047 | 20 |
| 5048 | 18.2 |
| 5049 | 17.2 |
| 5050 | 17 |
| 5051 | 16.9 |
| 5052 | 17 |
| 5053 | 16.9 |
| 5054 | 16.9 |
| 5055 | 16.9 |
| 5056 | 16.9 |
| 5057 | 16.8 |
| 5058 | 16.9 |
| 5059 | 17.3 |
| 5060 | 18.8 |
| 5061 | 20.8 |
| 5062 | 23 |
| 5063 | 25 |
| 5064 | 27.1 |
| 5065 | 27.8 |
| 5066 | 27.4 |
| 5067 | 25.9 |
| 5068 | 24.8 |
| 5069 | 23.5 |
| 5070 | 21.7 |
| 5071 | 20.1 |
| 5072 | 18.7 |
| 5073 | 18 |
| 5074 | 17.4 |
| 5075 | 17 |
| 5076 | 16.8 |
| 5077 | 16.8 |
| 5078 | 16.8 |
| 5079 | 16.8 |
| 5080 | 16.8 |
| 5081 | 16.7 |
| 5082 | 16.7 |
| 5083 | 16.5 |
| 5084 | 17.6 |
| 5085 | 19.7 |
| 5086 | 21.7 |
| 5087 | 23.4 |
| 5088 | 24.5 |
| 5089 | 25 |
| 5090 | 24.8 |
| 5091 | 24.2 |
| 5092 | 23.3 |
| 5093 | 22.4 |
| 5094 | 21.3 |
| 5095 | 19.7 |
| 5096 | 18.3 |
| 5097 | 17.6 |
| 5098 | 17.3 |
| 5099 | 17.1 |
| 5100 | 17 |
| 5101 | 16.8 |
| 5102 | 16.6 |
| 5103 | 16.6 |
| 5104 | 16.6 |
| 5105 | 16.7 |
| 5106 | 16.9 |
| 5107 | 17.4 |
| 5108 | 18.6 |
| 5109 | 20.3 |
| 5110 | 22 |
| 5111 | 23.1 |
| 5112 | 23 |
| 5113 | 22.9 |
| 5114 | 22.8 |
| 5115 | 22.7 |
| 5116 | 22.4 |
| 5117 | 21.6 |
| 5118 | 20 |
| 5119 | 18.6 |
| 5120 | 17.5 |
| 5121 | 17.2 |
| 5122 | 16.9 |
| 5123 | 16.7 |
| 5124 | 16.6 |
| 5125 | 16.4 |
| 5126 | 16.2 |
| 5127 | 15.9 |
| 5128 | 15.8 |
| 5129 | 15.6 |
| 5130 | 15.5 |
| 5131 | 15.4 |
| 5132 | 15.5 |
| 5133 | 16.4 |
| 5134 | 18.3 |
| 5135 | 19.4 |
| 5136 | 20.1 |
| 5137 | 20 |
| 5138 | 19.9 |
| 5139 | 19.9 |
| 5140 | 19.5 |
| 5141 | 18.9 |
| 5142 | 17.8 |
| 5143 | 16.8 |
| 5144 | 15.8 |
| 5145 | 15.5 |
| 5146 | 15.5 |
| 5147 | 15.6 |
| 5148 | 15.5 |
| 5149 | 15.4 |
| 5150 | 15.3 |
| 5151 | 15.4 |
| 5152 | 15.5 |
| 5153 | 15.4 |
| 5154 | 15.4 |
| 5155 | 15.5 |
| 5156 | 15.5 |
| 5157 | 15.8 |
| 5158 | 17.3 |
| 5159 | 18.3 |
| 5160 | 18.7 |
| 5161 | 18.6 |
| 5162 | 17.7 |
| 5163 | 16.8 |
| 5164 | 16.5 |
| 5165 | 16 |
| 5166 | 15.4 |
| 5167 | 14.8 |
| 5168 | 14.5 |
| 5169 | 14.4 |
| 5170 | 14.4 |
| 5171 | 14.5 |
| 5172 | 14.7 |
| 5173 | 14.7 |
| 5174 | 14.2 |
| 5175 | 14 |
| 5176 | 14.1 |
| 5177 | 13.9 |
| 5178 | 13.8 |
| 5179 | 13.9 |
| 5180 | 14.4 |
| 5181 | 15.2 |
| 5182 | 15.7 |
| 5183 | 16.6 |
| 5184 | 19.2 |
| 5185 | 19.3 |
| 5186 | 19.2 |
| 5187 | 18.8 |
| 5188 | 18.3 |
| 5189 | 17.7 |
| 5190 | 17 |
| 5191 | 16.2 |
| 5192 | 15.4 |
| 5193 | 15 |
| 5194 | 14.9 |
| 5195 | 15 |
| 5196 | 15.1 |
| 5197 | 15.1 |
| 5198 | 15.2 |
| 5199 | 15.1 |
| 5200 | 15.2 |
| 5201 | 15.3 |
| 5202 | 15.4 |
| 5203 | 15.5 |
| 5204 | 16.1 |
| 5205 | 17 |
| 5206 | 18.1 |
| 5207 | 19 |
| 5208 | 23.2 |
| 5209 | 23.3 |
| 5210 | 22.9 |
| 5211 | 22.1 |
| 5212 | 21.4 |
| 5213 | 20.4 |
| 5214 | 18.6 |
| 5215 | 17.6 |
| 5216 | 16.9 |
| 5217 | 16.4 |
| 5218 | 16.1 |
| 5219 | 15.9 |
| 5220 | 16 |
| 5221 | 16 |
| 5222 | 15.9 |
| 5223 | 15.8 |
| 5224 | 15.7 |
| 5225 | 15.6 |
| 5226 | 15.5 |
| 5227 | 15.4 |
| 5228 | 15.8 |
| 5229 | 17 |
| 5230 | 18.3 |
| 5231 | 19.4 |
| 5232 | 21.4 |
| 5233 | 21.5 |
| 5234 | 21 |
| 5235 | 21 |
| 5236 | 19.8 |
| 5237 | 19.2 |
| 5238 | 18.8 |
| 5239 | 17.6 |
| 5240 | 17.3 |
| 5241 | 17.1 |
| 5242 | 17 |
| 5243 | 17 |
| 5244 | 17 |
| 5245 | 16.9 |
| 5246 | 16.7 |
| 5247 | 16.5 |
| 5248 | 16.5 |
| 5249 | 16.5 |
| 5250 | 16.4 |
| 5251 | 16.5 |
| 5252 | 16.5 |
| 5253 | 16.5 |
| 5254 | 16.8 |
| 5255 | 17.5 |
| 5256 | 19.9 |
| 5257 | 21.1 |
| 5258 | 21.1 |
| 5259 | 20.9 |
| 5260 | 20.5 |
| 5261 | 19.9 |
| 5262 | 19 |
| 5263 | 18.1 |
| 5264 | 17.6 |
| 5265 | 17.6 |
| 5266 | 17.7 |
| 5267 | 17.7 |
| 5268 | 17.9 |
| 5269 | 17.9 |
| 5270 | 18.1 |
| 5271 | 17.9 |
| 5272 | 17.8 |
| 5273 | 17.8 |
| 5274 | 17.8 |
| 5275 | 18.1 |
| 5276 | 18 |
| 5277 | 17.9 |
| 5278 | 17.9 |
| 5279 | 19.6 |
| 5280 | 17.9 |
| 5281 | 18.5 |
| 5282 | 18.3 |
| 5283 | 17.9 |
| 5284 | 17.4 |
| 5285 | 16.9 |
| 5286 | 16.3 |
| 5287 | 15.6 |
| 5288 | 14.8 |
| 5289 | 14.5 |
| 5290 | 14.2 |
| 5291 | 14.2 |
| 5292 | 14.2 |
| 5293 | 14.1 |
| 5294 | 14.3 |
| 5295 | 14.3 |
| 5296 | 14.2 |
| 5297 | 13.8 |
| 5298 | 13.4 |
| 5299 | 13.2 |
| 5300 | 13.6 |
| 5301 | 14.9 |
| 5302 | 16 |
| 5303 | 17.1 |
| 5304 | 18 |
| 5305 | 18.9 |
| 5306 | 18.9 |
| 5307 | 18.4 |
| 5308 | 17.8 |
| 5309 | 17.1 |
| 5310 | 16.4 |
| 5311 | 15.2 |
| 5312 | 14.3 |
| 5313 | 13.9 |
| 5314 | 13.6 |
| 5315 | 13.2 |
| 5316 | 13 |
| 5317 | 12.9 |
| 5318 | 12.9 |
| 5319 | 13 |
| 5320 | 13 |
| 5321 | 12.9 |
| 5322 | 12.8 |
| 5323 | 13 |
| 5324 | 13.8 |
| 5325 | 15.2 |
| 5326 | 16.3 |
| 5327 | 17.1 |
| 5328 | 17.2 |
| 5329 | 17.2 |
| 5330 | 17.1 |
| 5331 | 16.9 |
| 5332 | 16.8 |
| 5333 | 16.4 |
| 5334 | 15.7 |
| 5335 | 14.7 |
| 5336 | 14.2 |
| 5337 | 13.9 |
| 5338 | 13.6 |
| 5339 | 13.4 |
| 5340 | 13.1 |
| 5341 | 12.8 |
| 5342 | 12.5 |
| 5343 | 12.2 |
| 5344 | 12.1 |
| 5345 | 12 |
| 5346 | 11.9 |
| 5347 | 12.3 |
| 5348 | 13.7 |
| 5349 | 15.2 |
| 5350 | 16.3 |
| 5351 | 17.5 |
| 5352 | 19.1 |
| 5353 | 19.5 |
| 5354 | 19.2 |
| 5355 | 18.8 |
| 5356 | 18.5 |
| 5357 | 17.7 |
| 5358 | 16.7 |
| 5359 | 15.6 |
| 5360 | 14.6 |
| 5361 | 14.1 |
| 5362 | 13.8 |
| 5363 | 13.6 |
| 5364 | 13.4 |
| 5365 | 13.3 |
| 5366 | 13.2 |
| 5367 | 13.2 |
| 5368 | 13.3 |
| 5369 | 13.2 |
| 5370 | 13.1 |
| 5371 | 13.3 |
| 5372 | 13.8 |
| 5373 | 14.8 |
| 5374 | 15.8 |
| 5375 | 17 |
| 5376 | 18.5 |
| 5377 | 19.1 |
| 5378 | 19.2 |
| 5379 | 18.8 |
| 5380 | 18.5 |
| 5381 | 18.6 |
| 5382 | 17.5 |
| 5383 | 16.6 |
| 5384 | 16.5 |
| 5385 | 16.5 |
| 5386 | 16.4 |
| 5387 | 16.5 |
| 5388 | 16.5 |
| 5389 | 16.3 |
| 5390 | 16.2 |
| 5391 | 16.2 |
| 5392 | 16.1 |
| 5393 | 15.8 |
| 5394 | 15.5 |
| 5395 | 15 |
| 5396 | 16.7 |
| 5397 | 17.5 |
| 5398 | 18 |
| 5399 | 18 |
| 5400 | 18.3 |
| 5401 | 19 |
| 5402 | 19.3 |
| 5403 | 19.1 |
| 5404 | 18.7 |
| 5405 | 17.9 |
| 5406 | 17.1 |
| 5407 | 16.2 |
| 5408 | 15.3 |
| 5409 | 15.1 |
| 5410 | 15 |
| 5411 | 14.9 |
| 5412 | 14.8 |
| 5413 | 14.7 |
| 5414 | 14.6 |
| 5415 | 14.5 |
| 5416 | 14.4 |
| 5417 | 14.3 |
| 5418 | 14.3 |
| 5419 | 14.3 |
| 5420 | 14.2 |
| 5421 | 14.8 |
| 5422 | 17.1 |
| 5423 | 18.9 |
| 5424 | 19.3 |
| 5425 | 19.2 |
| 5426 | 19.4 |
| 5427 | 19.5 |
| 5428 | 18.8 |
| 5429 | 17.9 |
| 5430 | 17 |
| 5431 | 15.9 |
| 5432 | 15 |
| 5433 | 14.4 |
| 5434 | 14 |
| 5435 | 13.7 |
| 5436 | 13.5 |
| 5437 | 13.2 |
| 5438 | 13 |
| 5439 | 12.8 |
| 5440 | 12.6 |
| 5441 | 12.5 |
| 5442 | 12.4 |
| 5443 | 12.4 |
| 5444 | 13.4 |
| 5445 | 14.9 |
| 5446 | 16.4 |
| 5447 | 17.1 |
| 5448 | 17.5 |
| 5449 | 17.8 |
| 5450 | 17.6 |
| 5451 | 17.4 |
| 5452 | 17 |
| 5453 | 16.2 |
| 5454 | 15.5 |
| 5455 | 14.7 |
| 5456 | 14.1 |
| 5457 | 13.8 |
| 5458 | 13.6 |
| 5459 | 13.6 |
| 5460 | 13.6 |
| 5461 | 13.4 |
| 5462 | 13.3 |
| 5463 | 13.4 |
| 5464 | 13.6 |
| 5465 | 13.7 |
| 5466 | 13.7 |
| 5467 | 13.7 |
| 5468 | 14.2 |
| 5469 | 15 |
| 5470 | 16 |
| 5471 | 17.7 |
| 5472 | 17 |
| 5473 | 18.3 |
| 5474 | 18.6 |
| 5475 | 18.3 |
| 5476 | 17.7 |
| 5477 | 17.1 |
| 5478 | 16.4 |
| 5479 | 15.4 |
| 5480 | 14.7 |
| 5481 | 14.4 |
| 5482 | 14.4 |
| 5483 | 14.4 |
| 5484 | 14.5 |
| 5485 | 14.5 |
| 5486 | 14.4 |
| 5487 | 14.3 |
| 5488 | 14.5 |
| 5489 | 14.6 |
| 5490 | 14.7 |
| 5491 | 14.6 |
| 5492 | 14.6 |
| 5493 | 15.9 |
| 5494 | 17.4 |
| 5495 | 18.3 |
| 5496 | 21.6 |
| 5497 | 22.3 |
| 5498 | 22.6 |
| 5499 | 21.9 |
| 5500 | 20.9 |
| 5501 | 19.8 |
| 5502 | 18.2 |
| 5503 | 17 |
| 5504 | 16.3 |
| 5505 | 16.1 |
| 5506 | 16.1 |
| 5507 | 16 |
| 5508 | 16 |
| 5509 | 16 |
| 5510 | 16 |
| 5511 | 16.1 |
| 5512 | 16.1 |
| 5513 | 15.9 |
| 5514 | 15.6 |
| 5515 | 15.3 |
| 5516 | 15.5 |
| 5517 | 16.9 |
| 5518 | 17.5 |
| 5519 | 18 |
| 5520 | 17.6 |
| 5521 | 17.4 |
| 5522 | 17.2 |
| 5523 | 17 |
| 5524 | 17 |
| 5525 | 16.9 |
| 5526 | 16.1 |
| 5527 | 15 |
| 5528 | 14.7 |
| 5529 | 14.7 |
| 5530 | 14.7 |
| 5531 | 14.7 |
| 5532 | 14.7 |
| 5533 | 14.6 |
| 5534 | 14.5 |
| 5535 | 14.3 |
| 5536 | 14.1 |
| 5537 | 13.9 |
| 5538 | 13.8 |
| 5539 | 13.7 |
| 5540 | 14.4 |
| 5541 | 15.6 |
| 5542 | 16.6 |
| 5543 | 17.3 |
| 5544 | 20.8 |
| 5545 | 21.4 |
| 5546 | 20.3 |
| 5547 | 19.6 |
| 5548 | 19 |
| 5549 | 18.6 |
| 5550 | 18.1 |
| 5551 | 16.8 |
| 5552 | 15.8 |
| 5553 | 15.5 |
| 5554 | 15.5 |
| 5555 | 15.5 |
| 5556 | 15.5 |
| 5557 | 15.5 |
| 5558 | 15.5 |
| 5559 | 15.4 |
| 5560 | 15.2 |
| 5561 | 15 |
| 5562 | 14.7 |
| 5563 | 14.6 |
| 5564 | 15.3 |
| 5565 | 16.8 |
| 5566 | 18.1 |
| 5567 | 19.2 |
| 5568 | 19.9 |
| 5569 | 20.4 |
| 5570 | 20.5 |
| 5571 | 20.1 |
| 5572 | 19.2 |
| 5573 | 18.1 |
| 5574 | 16.8 |
| 5575 | 16.2 |
| 5576 | 15.9 |
| 5577 | 15.5 |
| 5578 | 14.9 |
| 5579 | 14.2 |
| 5580 | 13.9 |
| 5581 | 13.6 |
| 5582 | 13.3 |
| 5583 | 13.2 |
| 5584 | 13.1 |
| 5585 | 13 |
| 5586 | 12.7 |
| 5587 | 12.7 |
| 5588 | 13.6 |
| 5589 | 14.6 |
| 5590 | 15.5 |
| 5591 | 16.7 |
| 5592 | 17.7 |
| 5593 | 19.5 |
| 5594 | 19.5 |
| 5595 | 19.2 |
| 5596 | 18.9 |
| 5597 | 18.4 |
| 5598 | 17.8 |
| 5599 | 16.7 |
| 5600 | 16 |
| 5601 | 15.7 |
| 5602 | 15.7 |
| 5603 | 15.8 |
| 5604 | 15.7 |
| 5605 | 15.7 |
| 5606 | 15.6 |
| 5607 | 15.5 |
| 5608 | 15.4 |
| 5609 | 15.3 |
| 5610 | 15.3 |
| 5611 | 15.3 |
| 5612 | 15 |
| 5613 | 16.1 |
| 5614 | 18.9 |
| 5615 | 21 |
| 5616 | 20.9 |
| 5617 | 21.1 |
| 5618 | 20.8 |
| 5619 | 20.4 |
| 5620 | 19.8 |
| 5621 | 19.1 |
| 5622 | 18.1 |
| 5623 | 16.4 |
| 5624 | 15.6 |
| 5625 | 15.3 |
| 5626 | 15.3 |
| 5627 | 15.2 |
| 5628 | 15.2 |
| 5629 | 15.1 |
| 5630 | 15.1 |
| 5631 | 15 |
| 5632 | 15 |
| 5633 | 15 |
| 5634 | 15 |
| 5635 | 15 |
| 5636 | 15.2 |
| 5637 | 15.7 |
| 5638 | 17.1 |
| 5639 | 19.2 |
| 5640 | 20.9 |
| 5641 | 21.8 |
| 5642 | 22.3 |
| 5643 | 21.8 |
| 5644 | 20.4 |
| 5645 | 19.4 |
| 5646 | 17.8 |
| 5647 | 16.4 |
| 5648 | 16.1 |
| 5649 | 15.8 |
| 5650 | 15.7 |
| 5651 | 15.6 |
| 5652 | 15.4 |
| 5653 | 15.3 |
| 5654 | 15.3 |
| 5655 | 15.3 |
| 5656 | 15.2 |
| 5657 | 15.3 |
| 5658 | 15.1 |
| 5659 | 15.7 |
| 5660 | 16.3 |
| 5661 | 18.7 |
| 5662 | 21.6 |
| 5663 | 23.4 |
| 5664 | 24.9 |
| 5665 | 25.5 |
| 5666 | 26 |
| 5667 | 26.5 |
| 5668 | 26.8 |
| 5669 | 24.5 |
| 5670 | 20.8 |
| 5671 | 19.6 |
| 5672 | 18.4 |
| 5673 | 18.5 |
| 5674 | 18.1 |
| 5675 | 18.6 |
| 5676 | 20 |
| 5677 | 20.4 |
| 5678 | 20.3 |
| 5679 | 20 |
| 5680 | 20.9 |
| 5681 | 20.3 |
| 5682 | 21.7 |
| 5683 | 19.5 |
| 5684 | 19.9 |
| 5685 | 21.2 |
| 5686 | 22.2 |
| 5687 | 23.3 |
| 5688 | 23 |
| 5689 | 23.8 |
| 5690 | 23.7 |
| 5691 | 23.8 |
| 5692 | 23.9 |
| 5693 | 22 |
| 5694 | 21.4 |
| 5695 | 18.9 |
| 5696 | 16.8 |
| 5697 | 15.5 |
| 5698 | 15.8 |
| 5699 | 15.4 |
| 5700 | 15.4 |
| 5701 | 16.3 |
| 5702 | 16.4 |
| 5703 | 15.8 |
| 5704 | 15.6 |
| 5705 | 15.7 |
| 5706 | 15.3 |
| 5707 | 14.8 |
| 5708 | 15.5 |
| 5709 | 16.9 |
| 5710 | 17.8 |
| 5711 | 17.6 |
| 5712 | 19.7 |
| 5713 | 20.1 |
| 5714 | 20.3 |
| 5715 | 20.1 |
| 5716 | 19.9 |
| 5717 | 19.3 |
| 5718 | 18.6 |
| 5719 | 16.9 |
| 5720 | 15.9 |
| 5721 | 15.7 |
| 5722 | 15.8 |
| 5723 | 15.9 |
| 5724 | 15.9 |
| 5725 | 15.7 |
| 5726 | 16.1 |
| 5727 | 16.6 |
| 5728 | 15.9 |
| 5729 | 16 |
| 5730 | 15.7 |
| 5731 | 15.6 |
| 5732 | 15.4 |
| 5733 | 15.4 |
| 5734 | 15.5 |
| 5735 | 17 |
| 5736 | 19.1 |
| 5737 | 19.6 |
| 5738 | 19.8 |
| 5739 | 19.6 |
| 5740 | 19.2 |
| 5741 | 18.5 |
| 5742 | 17.6 |
| 5743 | 16.2 |
| 5744 | 15.2 |
| 5745 | 14.7 |
| 5746 | 14.4 |
| 5747 | 14.2 |
| 5748 | 13.9 |
| 5749 | 13.8 |
| 5750 | 13.9 |
| 5751 | 14 |
| 5752 | 13.9 |
| 5753 | 13.7 |
| 5754 | 13.6 |
| 5755 | 13.6 |
| 5756 | 14 |
| 5757 | 15.2 |
| 5758 | 16 |
| 5759 | 16.7 |
| 5760 | 20.2 |
| 5761 | 20.3 |
| 5762 | 19.8 |
| 5763 | 19.4 |
| 5764 | 18.9 |
| 5765 | 18.1 |
| 5766 | 17.2 |
| 5767 | 15.7 |
| 5768 | 14.8 |
| 5769 | 14.5 |
| 5770 | 14.3 |
| 5771 | 14 |
| 5772 | 13.8 |
| 5773 | 13.6 |
| 5774 | 13.4 |
| 5775 | 13.3 |
| 5776 | 13.4 |
| 5777 | 13.4 |
| 5778 | 13.2 |
| 5779 | 13.1 |
| 5780 | 13.5 |
| 5781 | 14.2 |
| 5782 | 15.5 |
| 5783 | 15.4 |
| 5784 | 18 |
| 5785 | 18.4 |
| 5786 | 17.9 |
| 5787 | 17.5 |
| 5788 | 17.2 |
| 5789 | 16.3 |
| 5790 | 15.8 |
| 5791 | 15.1 |
| 5792 | 14.7 |
| 5793 | 14.3 |
| 5794 | 13.9 |
| 5795 | 13.8 |
| 5796 | 13.8 |
| 5797 | 13.9 |
| 5798 | 14.1 |
| 5799 | 14 |
| 5800 | 14.1 |
| 5801 | 14 |
| 5802 | 14 |
| 5803 | 13.9 |
| 5804 | 14 |
| 5805 | 14.6 |
| 5806 | 15.4 |
| 5807 | 16.2 |
| 5808 | 17.2 |
| 5809 | 17.9 |
| 5810 | 18.7 |
| 5811 | 19 |
| 5812 | 18.6 |
| 5813 | 17.3 |
| 5814 | 16.5 |
| 5815 | 16 |
| 5816 | 15.8 |
| 5817 | 15.7 |
| 5818 | 15.6 |
| 5819 | 15.7 |
| 5820 | 15.7 |
| 5821 | 15.6 |
| 5822 | 15.3 |
| 5823 | 15.1 |
| 5824 | 15.2 |
| 5825 | 15.4 |
| 5826 | 15.2 |
| 5827 | 15.2 |
| 5828 | 15.4 |
| 5829 | 15.9 |
| 5830 | 15.8 |
| 5831 | 16.6 |
| 5832 | 19.3 |
| 5833 | 19.4 |
| 5834 | 17.5 |
| 5835 | 17.3 |
| 5836 | 16.4 |
| 5837 | 15.7 |
| 5838 | 15 |
| 5839 | 14.4 |
| 5840 | 14 |
| 5841 | 13.7 |
| 5842 | 13.5 |
| 5843 | 13.4 |
| 5844 | 13.4 |
| 5845 | 13.5 |
| 5846 | 13.7 |
| 5847 | 14 |
| 5848 | 14.3 |
| 5849 | 14.6 |
| 5850 | 14.7 |
| 5851 | 14.3 |
| 5852 | 14.1 |
| 5853 | 14.5 |
| 5854 | 15.7 |
| 5855 | 17.2 |
| 5856 | 18.6 |
| 5857 | 18.9 |
| 5858 | 19.7 |
| 5859 | 19.4 |
| 5860 | 18 |
| 5861 | 17.2 |
| 5862 | 17.1 |
| 5863 | 17.3 |
| 5864 | 17.2 |
| 5865 | 16.2 |
| 5866 | 16.1 |
| 5867 | 15.9 |
| 5868 | 15.8 |
| 5869 | 15.7 |
| 5870 | 15.6 |
| 5871 | 15.5 |
| 5872 | 15.4 |
| 5873 | 15.4 |
| 5874 | 15.5 |
| 5875 | 15.5 |
| 5876 | 15.7 |
| 5877 | 16.4 |
| 5878 | 17.2 |
| 5879 | 17.9 |
| 5880 | 16.3 |
| 5881 | 16.7 |
| 5882 | 16.9 |
| 5883 | 17.1 |
| 5884 | 17 |
| 5885 | 16.5 |
| 5886 | 15.8 |
| 5887 | 14.7 |
| 5888 | 13.9 |
| 5889 | 13.5 |
| 5890 | 13 |
| 5891 | 12.7 |
| 5892 | 12.5 |
| 5893 | 12.4 |
| 5894 | 12.4 |
| 5895 | 12.4 |
| 5896 | 12.3 |
| 5897 | 12.1 |
| 5898 | 11.9 |
| 5899 | 11.8 |
| 5900 | 11.8 |
| 5901 | 12.3 |
| 5902 | 13.4 |
| 5903 | 14.5 |
| 5904 | 17.8 |
| 5905 | 18.8 |
| 5906 | 19.4 |
| 5907 | 19.5 |
| 5908 | 18.9 |
| 5909 | 17.1 |
| 5910 | 15.7 |
| 5911 | 14.5 |
| 5912 | 14.1 |
| 5913 | 14 |
| 5914 | 13.8 |
| 5915 | 13.7 |
| 5916 | 13.7 |
| 5917 | 13.6 |
| 5918 | 13.7 |
| 5919 | 14 |
| 5920 | 14.5 |
| 5921 | 15.1 |
| 5922 | 15.2 |
| 5923 | 15.1 |
| 5924 | 15.2 |
| 5925 | 15.5 |
| 5926 | 16.4 |
| 5927 | 17.7 |
| 5928 | 19.1 |
| 5929 | 20.3 |
| 5930 | 21.1 |
| 5931 | 21.7 |
| 5932 | 22.2 |
| 5933 | 22.2 |
| 5934 | 19.9 |
| 5935 | 17.2 |
| 5936 | 17.3 |
| 5937 | 17.3 |
| 5938 | 17.2 |
| 5939 | 17.2 |
| 5940 | 18 |
| 5941 | 18.5 |
| 5942 | 18.6 |
| 5943 | 19.2 |
| 5944 | 19.1 |
| 5945 | 19 |
| 5946 | 19.1 |
| 5947 | 19 |
| 5948 | 18.9 |
| 5949 | 19.5 |
| 5950 | 21.1 |
| 5951 | 22.2 |
| 5952 | 22.5 |
| 5953 | 23.1 |
| 5954 | 23.4 |
| 5955 | 22.2 |
| 5956 | 20.7 |
| 5957 | 19 |
| 5958 | 18 |
| 5959 | 17 |
| 5960 | 16.8 |
| 5961 | 16.8 |
| 5962 | 16.7 |
| 5963 | 16.7 |
| 5964 | 16.7 |
| 5965 | 17.1 |
| 5966 | 17.4 |
| 5967 | 17.4 |
| 5968 | 17 |
| 5969 | 16.7 |
| 5970 | 16.1 |
| 5971 | 15.5 |
| 5972 | 15.3 |
| 5973 | 15.4 |
| 5974 | 15.6 |
| 5975 | 16.5 |
| 5976 | 20.3 |
| 5977 | 21.1 |
| 5978 | 21.2 |
| 5979 | 20.8 |
| 5980 | 19.8 |
| 5981 | 18.7 |
| 5982 | 17.4 |
| 5983 | 15.8 |
| 5984 | 15 |
| 5985 | 14.7 |
| 5986 | 14.5 |
| 5987 | 14.3 |
| 5988 | 14.1 |
| 5989 | 13.7 |
| 5990 | 13.6 |
| 5991 | 13.5 |
| 5992 | 13.5 |
| 5993 | 13.8 |
| 5994 | 13.9 |
| 5995 | 14.2 |
| 5996 | 14.6 |
| 5997 | 14.8 |
| 5998 | 15.4 |
| 5999 | 16.4 |
| 6000 | 16 |
| 6001 | 16.6 |
| 6002 | 16.3 |
| 6003 | 16.2 |
| 6004 | 15.5 |
| 6005 | 15.5 |
| 6006 | 15 |
| 6007 | 14.2 |
| 6008 | 13.4 |
| 6009 | 12.9 |
| 6010 | 12.4 |
| 6011 | 11.9 |
| 6012 | 11.5 |
| 6013 | 11.2 |
| 6014 | 10.9 |
| 6015 | 10.8 |
| 6016 | 10.6 |
| 6017 | 10.4 |
| 6018 | 10.3 |
| 6019 | 10.1 |
| 6020 | 10.8 |
| 6021 | 12.5 |
| 6022 | 13.8 |
| 6023 | 14.8 |
| 6024 | 15.9 |
| 6025 | 16.5 |
| 6026 | 17 |
| 6027 | 16.9 |
| 6028 | 16.2 |
| 6029 | 15.3 |
| 6030 | 14.4 |
| 6031 | 13.5 |
| 6032 | 13 |
| 6033 | 12.7 |
| 6034 | 12.4 |
| 6035 | 12.2 |
| 6036 | 11.9 |
| 6037 | 11.8 |
| 6038 | 11.9 |
| 6039 | 11.9 |
| 6040 | 12 |
| 6041 | 12 |
| 6042 | 12 |
| 6043 | 12.1 |
| 6044 | 12.5 |
| 6045 | 13.7 |
| 6046 | 15 |
| 6047 | 15.3 |
| 6048 | 18.7 |
| 6049 | 19.4 |
| 6050 | 19.8 |
| 6051 | 19.9 |
| 6052 | 19.6 |
| 6053 | 18.6 |
| 6054 | 17.9 |
| 6055 | 16.3 |
| 6056 | 15.8 |
| 6057 | 15.4 |
| 6058 | 15.5 |
| 6059 | 15.6 |
| 6060 | 15.7 |
| 6061 | 15.9 |
| 6062 | 16.2 |
| 6063 | 16.7 |
| 6064 | 16.8 |
| 6065 | 16.7 |
| 6066 | 16.1 |
| 6067 | 15.5 |
| 6068 | 15.3 |
| 6069 | 15.8 |
| 6070 | 17.2 |
| 6071 | 18.6 |
| 6072 | 21.1 |
| 6073 | 22 |
| 6074 | 23 |
| 6075 | 23.7 |
| 6076 | 22.8 |
| 6077 | 19.6 |
| 6078 | 18.4 |
| 6079 | 16.7 |
| 6080 | 15.7 |
| 6081 | 15.4 |
| 6082 | 15.4 |
| 6083 | 15.3 |
| 6084 | 15.3 |
| 6085 | 15.3 |
| 6086 | 15 |
| 6087 | 14.6 |
| 6088 | 14.4 |
| 6089 | 14.3 |
| 6090 | 14.2 |
| 6091 | 14.2 |
| 6092 | 14.3 |
| 6093 | 15.4 |
| 6094 | 16.9 |
| 6095 | 18.5 |
| 6096 | 19.9 |
| 6097 | 20 |
| 6098 | 19.5 |
| 6099 | 18.8 |
| 6100 | 17.7 |
| 6101 | 16.7 |
| 6102 | 15.6 |
| 6103 | 14.8 |
| 6104 | 14.5 |
| 6105 | 14.3 |
| 6106 | 14.3 |
| 6107 | 14.3 |
| 6108 | 14.3 |
| 6109 | 14.3 |
| 6110 | 14.2 |
| 6111 | 14.1 |
| 6112 | 13.9 |
| 6113 | 13.8 |
| 6114 | 13.8 |
| 6115 | 13.8 |
| 6116 | 13.8 |
| 6117 | 13.7 |
| 6118 | 14.6 |
| 6119 | 15.4 |
| 6120 | 16.1 |
| 6121 | 15.7 |
| 6122 | 15.6 |
| 6123 | 16 |
| 6124 | 16.8 |
| 6125 | 16.6 |
| 6126 | 15.7 |
| 6127 | 14.8 |
| 6128 | 14.6 |
| 6129 | 14.6 |
| 6130 | 14.7 |
| 6131 | 14.3 |
| 6132 | 14.2 |
| 6133 | 14.1 |
| 6134 | 14.1 |
| 6135 | 14 |
| 6136 | 13.7 |
| 6137 | 13.6 |
| 6138 | 13.8 |
| 6139 | 13.7 |
| 6140 | 13.7 |
| 6141 | 14.3 |
| 6142 | 15.6 |
| 6143 | 16.1 |
| 6144 | 17.1 |
| 6145 | 18.5 |
| 6146 | 19.6 |
| 6147 | 19.9 |
| 6148 | 20 |
| 6149 | 19.4 |
| 6150 | 17.7 |
| 6151 | 16.3 |
| 6152 | 16 |
| 6153 | 16 |
| 6154 | 16.1 |
| 6155 | 16.2 |
| 6156 | 16.2 |
| 6157 | 16.2 |
| 6158 | 16.2 |
| 6159 | 16 |
| 6160 | 15.7 |
| 6161 | 15.5 |
| 6162 | 15.1 |
| 6163 | 15.1 |
| 6164 | 14.9 |
| 6165 | 15.9 |
| 6166 | 16.7 |
| 6167 | 17.5 |
| 6168 | 19.7 |
| 6169 | 20.3 |
| 6170 | 20.2 |
| 6171 | 19.2 |
| 6172 | 19.4 |
| 6173 | 19.7 |
| 6174 | 19.2 |
| 6175 | 17 |
| 6176 | 15.2 |
| 6177 | 14.5 |
| 6178 | 14 |
| 6179 | 14.2 |
| 6180 | 15.3 |
| 6181 | 16.3 |
| 6182 | 17.1 |
| 6183 | 17.5 |
| 6184 | 17.7 |
| 6185 | 17.6 |
| 6186 | 17.4 |
| 6187 | 17.2 |
| 6188 | 17 |
| 6189 | 17.4 |
| 6190 | 18.7 |
| 6191 | 19.9 |
| 6192 | 20.1 |
| 6193 | 21.1 |
| 6194 | 22.2 |
| 6195 | 22.7 |
| 6196 | 23.2 |
| 6197 | 23.3 |
| 6198 | 22.8 |
| 6199 | 22.5 |
| 6200 | 22.5 |
| 6201 | 22.4 |
| 6202 | 21.6 |
| 6203 | 20.9 |
| 6204 | 20.6 |
| 6205 | 20.7 |
| 6206 | 20.3 |
| 6207 | 19.6 |
| 6208 | 18.5 |
| 6209 | 17.5 |
| 6210 | 17 |
| 6211 | 17.3 |
| 6212 | 17.1 |
| 6213 | 17.5 |
| 6214 | 17.4 |
| 6215 | 17.1 |
| 6216 | 24.8 |
| 6217 | 25.4 |
| 6218 | 26.1 |
| 6219 | 24.6 |
| 6220 | 18.9 |
| 6221 | 17.5 |
| 6222 | 15.9 |
| 6223 | 14.9 |
| 6224 | 15.7 |
| 6225 | 15.3 |
| 6226 | 15.4 |
| 6227 | 15.6 |
| 6228 | 15.5 |
| 6229 | 16.5 |
| 6230 | 15.2 |
| 6231 | 15 |
| 6232 | 14.6 |
| 6233 | 14.5 |
| 6234 | 14.7 |
| 6235 | 14.7 |
| 6236 | 14.5 |
| 6237 | 14.7 |
| 6238 | 14.9 |
| 6239 | 15.5 |
| 6240 | 16.5 |
| 6241 | 17.2 |
| 6242 | 18.3 |
| 6243 | 19.8 |
| 6244 | 19.2 |
| 6245 | 17.4 |
| 6246 | 15.1 |
| 6247 | 14.3 |
| 6248 | 14.2 |
| 6249 | 14.4 |
| 6250 | 14.4 |
| 6251 | 14.3 |
| 6252 | 14.2 |
| 6253 | 14 |
| 6254 | 13.9 |
| 6255 | 13.9 |
| 6256 | 14.2 |
| 6257 | 14.5 |
| 6258 | 14.2 |
| 6259 | 14.1 |
| 6260 | 14.4 |
| 6261 | 14.7 |
| 6262 | 15.2 |
| 6263 | 15.6 |
| 6264 | 18.2 |
| 6265 | 18.9 |
| 6266 | 19.2 |
| 6267 | 19.2 |
| 6268 | 18.9 |
| 6269 | 18.5 |
| 6270 | 17.4 |
| 6271 | 15.8 |
| 6272 | 15.2 |
| 6273 | 15.2 |
| 6274 | 14.8 |
| 6275 | 14.7 |
| 6276 | 14.6 |
| 6277 | 14.5 |
| 6278 | 14.8 |
| 6279 | 14.6 |
| 6280 | 14.6 |
| 6281 | 14.5 |
| 6282 | 14.2 |
| 6283 | 14.2 |
| 6284 | 14.1 |
| 6285 | 14.4 |
| 6286 | 15.5 |
| 6287 | 15.9 |
| 6288 | 20.6 |
| 6289 | 20.8 |
| 6290 | 20.9 |
| 6291 | 20.2 |
| 6292 | 18.6 |
| 6293 | 17.9 |
| 6294 | 16.7 |
| 6295 | 15.4 |
| 6296 | 15 |
| 6297 | 14.8 |
| 6298 | 14.4 |
| 6299 | 14.2 |
| 6300 | 14.2 |
| 6301 | 14.1 |
| 6302 | 14.7 |
| 6303 | 15.5 |
| 6304 | 15.4 |
| 6305 | 14.9 |
| 6306 | 14.1 |
| 6307 | 13.7 |
| 6308 | 13.7 |
| 6309 | 13.7 |
| 6310 | 15.3 |
| 6311 | 17.2 |
| 6312 | 19.5 |
| 6313 | 20.1 |
| 6314 | 20.4 |
| 6315 | 20.4 |
| 6316 | 19.3 |
| 6317 | 18.5 |
| 6318 | 17.3 |
| 6319 | 15.7 |
| 6320 | 15.1 |
| 6321 | 14.8 |
| 6322 | 15 |
| 6323 | 15.1 |
| 6324 | 15.2 |
| 6325 | 15.3 |
| 6326 | 14.8 |
| 6327 | 14.3 |
| 6328 | 14.1 |
| 6329 | 14.5 |
| 6330 | 14.9 |
| 6331 | 14.2 |
| 6332 | 14 |
| 6333 | 15 |
| 6334 | 17.1 |
| 6335 | 18.5 |
| 6336 | 20.7 |
| 6337 | 21.4 |
| 6338 | 21.9 |
| 6339 | 22 |
| 6340 | 21.9 |
| 6341 | 21.5 |
| 6342 | 19.6 |
| 6343 | 17.5 |
| 6344 | 17.1 |
| 6345 | 16.7 |
| 6346 | 16.6 |
| 6347 | 16.9 |
| 6348 | 17.1 |
| 6349 | 17.7 |
| 6350 | 17.8 |
| 6351 | 17.2 |
| 6352 | 17.1 |
| 6353 | 16.8 |
| 6354 | 16.5 |
| 6355 | 16.2 |
| 6356 | 15.4 |
| 6357 | 15.5 |
| 6358 | 16.6 |
| 6359 | 18.1 |
| 6360 | 19.6 |
| 6361 | 20.4 |
| 6362 | 21.3 |
| 6363 | 21.8 |
| 6364 | 22.1 |
| 6365 | 22 |
| 6366 | 21.5 |
| 6367 | 19.5 |
| 6368 | 19.1 |
| 6369 | 18.8 |
| 6370 | 19.1 |
| 6371 | 19.9 |
| 6372 | 19.6 |
| 6373 | 18.6 |
| 6374 | 17.8 |
| 6375 | 17.1 |
| 6376 | 17 |
| 6377 | 16.7 |
| 6378 | 16.5 |
| 6379 | 16.4 |
| 6380 | 15.9 |
| 6381 | 16.1 |
| 6382 | 16.6 |
| 6383 | 17.8 |
| 6384 | 19.5 |
| 6385 | 20.4 |
| 6386 | 21 |
| 6387 | 21.8 |
| 6388 | 22.1 |
| 6389 | 22.1 |
| 6390 | 21.7 |
| 6391 | 21 |
| 6392 | 19.9 |
| 6393 | 19 |
| 6394 | 18.5 |
| 6395 | 18.3 |
| 6396 | 18.2 |
| 6397 | 17.4 |
| 6398 | 17 |
| 6399 | 16.7 |
| 6400 | 16 |
| 6401 | 15.5 |
| 6402 | 15.1 |
| 6403 | 14.8 |
| 6404 | 14.7 |
| 6405 | 15.4 |
| 6406 | 16.5 |
| 6407 | 17.3 |
| 6408 | 18.5 |
| 6409 | 19.5 |
| 6410 | 20.1 |
| 6411 | 20.5 |
| 6412 | 20.6 |
| 6413 | 20.5 |
| 6414 | 20 |
| 6415 | 19.4 |
| 6416 | 18.3 |
| 6417 | 16.9 |
| 6418 | 16.4 |
| 6419 | 15.9 |
| 6420 | 15.4 |
| 6421 | 15.4 |
| 6422 | 15.2 |
| 6423 | 15.1 |
| 6424 | 15.2 |
| 6425 | 15 |
| 6426 | 14.5 |
| 6427 | 14.1 |
| 6428 | 14.4 |
| 6429 | 15.3 |
| 6430 | 16.3 |
| 6431 | 17 |
| 6432 | 18.7 |
| 6433 | 19.6 |
| 6434 | 20.3 |
| 6435 | 20.9 |
| 6436 | 21.1 |
| 6437 | 19.2 |
| 6438 | 17.9 |
| 6439 | 17 |
| 6440 | 16.1 |
| 6441 | 15.7 |
| 6442 | 15.1 |
| 6443 | 14.9 |
| 6444 | 15.2 |
| 6445 | 15.4 |
| 6446 | 15.4 |
| 6447 | 15.4 |
| 6448 | 15.5 |
| 6449 | 15.5 |
| 6450 | 15.4 |
| 6451 | 15.1 |
| 6452 | 14.8 |
| 6453 | 15.1 |
| 6454 | 16.2 |
| 6455 | 17.5 |
| 6456 | 21.7 |
| 6457 | 22.2 |
| 6458 | 22 |
| 6459 | 21.2 |
| 6460 | 20 |
| 6461 | 18.6 |
| 6462 | 17 |
| 6463 | 15.4 |
| 6464 | 14.5 |
| 6465 | 14.1 |
| 6466 | 13.8 |
| 6467 | 13.9 |
| 6468 | 14.1 |
| 6469 | 14.4 |
| 6470 | 14.4 |
| 6471 | 14.3 |
| 6472 | 13.9 |
| 6473 | 13.7 |
| 6474 | 13.6 |
| 6475 | 13.4 |
| 6476 | 13.3 |
| 6477 | 13.6 |
| 6478 | 14.2 |
| 6479 | 14.2 |
| 6480 | 16 |
| 6481 | 16.4 |
| 6482 | 16.8 |
| 6483 | 16.4 |
| 6484 | 15.4 |
| 6485 | 14.4 |
| 6486 | 13.5 |
| 6487 | 13 |
| 6488 | 12.8 |
| 6489 | 12.6 |
| 6490 | 12.5 |
| 6491 | 12.4 |
| 6492 | 12.4 |
| 6493 | 12.3 |
| 6494 | 12.2 |
| 6495 | 12.2 |
| 6496 | 12.1 |
| 6497 | 12.1 |
| 6498 | 12 |
| 6499 | 11.9 |
| 6500 | 11.9 |
| 6501 | 12.6 |
| 6502 | 13.8 |
| 6503 | 14.9 |
| 6504 | 15.2 |
| 6505 | 16.2 |
| 6506 | 16.1 |
| 6507 | 15.4 |
| 6508 | 14.9 |
| 6509 | 14.1 |
| 6510 | 13.3 |
| 6511 | 12.9 |
| 6512 | 12.7 |
| 6513 | 12.6 |
| 6514 | 12.5 |
| 6515 | 12.3 |
| 6516 | 12 |
| 6517 | 11.8 |
| 6518 | 11.6 |
| 6519 | 11.1 |
| 6520 | 10.6 |
| 6521 | 10.3 |
| 6522 | 10 |
| 6523 | 9.6 |
| 6524 | 9.5 |
| 6525 | 10.6 |
| 6526 | 11.9 |
| 6527 | 12.8 |
| 6528 | 12.9 |
| 6529 | 14 |
| 6530 | 14.6 |
| 6531 | 15.1 |
| 6532 | 15.4 |
| 6533 | 15.1 |
| 6534 | 13.3 |
| 6535 | 12.2 |
| 6536 | 11.7 |
| 6537 | 11.3 |
| 6538 | 11.1 |
| 6539 | 11.1 |
| 6540 | 11.1 |
| 6541 | 11.1 |
| 6542 | 11 |
| 6543 | 10.8 |
| 6544 | 10.8 |
| 6545 | 11.2 |
| 6546 | 11.8 |
| 6547 | 11.5 |
| 6548 | 11.3 |
| 6549 | 11.2 |
| 6550 | 11.9 |
| 6551 | 13.2 |
| 6552 | 17.5 |
| 6553 | 18.3 |
| 6554 | 18.9 |
| 6555 | 19.3 |
| 6556 | 19.1 |
| 6557 | 17.6 |
| 6558 | 15.1 |
| 6559 | 13.8 |
| 6560 | 13.6 |
| 6561 | 13.8 |
| 6562 | 13.8 |
| 6563 | 13.8 |
| 6564 | 14.2 |
| 6565 | 14.8 |
| 6566 | 15.2 |
| 6567 | 15.1 |
| 6568 | 15 |
| 6569 | 15 |
| 6570 | 15 |
| 6571 | 15 |
| 6572 | 15.1 |
| 6573 | 15.2 |
| 6574 | 16.1 |
| 6575 | 17.3 |
| 6576 | 18.4 |
| 6577 | 19.2 |
| 6578 | 19.7 |
| 6579 | 19.9 |
| 6580 | 19.3 |
| 6581 | 17.3 |
| 6582 | 15.6 |
| 6583 | 14.8 |
| 6584 | 14.6 |
| 6585 | 14.5 |
| 6586 | 14.8 |
| 6587 | 15 |
| 6588 | 15.2 |
| 6589 | 15.6 |
| 6590 | 15.6 |
| 6591 | 15.4 |
| 6592 | 15 |
| 6593 | 14.8 |
| 6594 | 14.6 |
| 6595 | 14.5 |
| 6596 | 14.7 |
| 6597 | 14.9 |
| 6598 | 15.1 |
| 6599 | 15.1 |
| 6600 | 16.9 |
| 6601 | 16.7 |
| 6602 | 16.2 |
| 6603 | 16 |
| 6604 | 16 |
| 6605 | 16.9 |
| 6606 | 16.7 |
| 6607 | 15.4 |
| 6608 | 14.5 |
| 6609 | 13.8 |
| 6610 | 13.3 |
| 6611 | 12.8 |
| 6612 | 12.6 |
| 6613 | 12.5 |
| 6614 | 12.3 |
| 6615 | 12.8 |
| 6616 | 12.2 |
| 6617 | 11.5 |
| 6618 | 12.4 |
| 6619 | 11.7 |
| 6620 | 11.2 |
| 6621 | 11.7 |
| 6622 | 12.8 |
| 6623 | 13.6 |
| 6624 | 14.7 |
| 6625 | 15 |
| 6626 | 15.4 |
| 6627 | 15.3 |
| 6628 | 14.9 |
| 6629 | 14.3 |
| 6630 | 13.4 |
| 6631 | 12.9 |
| 6632 | 12.5 |
| 6633 | 12 |
| 6634 | 11.6 |
| 6635 | 11.3 |
| 6636 | 11.2 |
| 6637 | 11.2 |
| 6638 | 11.2 |
| 6639 | 11.2 |
| 6640 | 11.2 |
| 6641 | 11.1 |
| 6642 | 11 |
| 6643 | 11.3 |
| 6644 | 11.7 |
| 6645 | 12 |
| 6646 | 13.2 |
| 6647 | 14.4 |
| 6648 | 16 |
| 6649 | 16.8 |
| 6650 | 17.2 |
| 6651 | 17.6 |
| 6652 | 17.3 |
| 6653 | 16.5 |
| 6654 | 16 |
| 6655 | 15.4 |
| 6656 | 15.3 |
| 6657 | 14.9 |
| 6658 | 14.8 |
| 6659 | 14.4 |
| 6660 | 14.5 |
| 6661 | 14.5 |
| 6662 | 14.7 |
| 6663 | 14.3 |
| 6664 | 13.6 |
| 6665 | 13.4 |
| 6666 | 13.3 |
| 6667 | 13 |
| 6668 | 12.9 |
| 6669 | 12.9 |
| 6670 | 13.1 |
| 6671 | 15.1 |
| 6672 | 19.4 |
| 6673 | 20.8 |
| 6674 | 21.8 |
| 6675 | 21.9 |
| 6676 | 22 |
| 6677 | 21.7 |
| 6678 | 21 |
| 6679 | 20.5 |
| 6680 | 19.9 |
| 6681 | 19.3 |
| 6682 | 19.2 |
| 6683 | 18.8 |
| 6684 | 18.4 |
| 6685 | 18 |
| 6686 | 17.4 |
| 6687 | 17 |
| 6688 | 17 |
| 6689 | 17.1 |
| 6690 | 17 |
| 6691 | 16.9 |
| 6692 | 17 |
| 6693 | 17.2 |
| 6694 | 17.5 |
| 6695 | 17.4 |
| 6696 | 18.3 |
| 6697 | 18.8 |
| 6698 | 18.5 |
| 6699 | 17.2 |
| 6700 | 17.2 |
| 6701 | 16.6 |
| 6702 | 15.2 |
| 6703 | 14.4 |
| 6704 | 14.2 |
| 6705 | 13.9 |
| 6706 | 13.7 |
| 6707 | 13.8 |
| 6708 | 13.8 |
| 6709 | 13.7 |
| 6710 | 13.6 |
| 6711 | 13.7 |
| 6712 | 13.6 |
| 6713 | 13.5 |
| 6714 | 13.3 |
| 6715 | 13.4 |
| 6716 | 13.6 |
| 6717 | 13.5 |
| 6718 | 13.9 |
| 6719 | 14.5 |
| 6720 | 19.1 |
| 6721 | 19.4 |
| 6722 | 19.2 |
| 6723 | 18.7 |
| 6724 | 17.9 |
| 6725 | 16.9 |
| 6726 | 15.9 |
| 6727 | 15.2 |
| 6728 | 15.2 |
| 6729 | 15.4 |
| 6730 | 15.4 |
| 6731 | 15 |
| 6732 | 14.4 |
| 6733 | 13.9 |
| 6734 | 13.5 |
| 6735 | 13.5 |
| 6736 | 13.5 |
| 6737 | 13.4 |
| 6738 | 13.5 |
| 6739 | 13.6 |
| 6740 | 13.7 |
| 6741 | 13.9 |
| 6742 | 14.4 |
| 6743 | 15.9 |
| 6744 | 15.6 |
| 6745 | 15.6 |
| 6746 | 15.6 |
| 6747 | 15.9 |
| 6748 | 16.2 |
| 6749 | 16 |
| 6750 | 15.9 |
| 6751 | 16 |
| 6752 | 15.8 |
| 6753 | 15.7 |
| 6754 | 15.3 |
| 6755 | 14.9 |
| 6756 | 14.7 |
| 6757 | 14.5 |
| 6758 | 14.2 |
| 6759 | 14 |
| 6760 | 13.6 |
| 6761 | 13.7 |
| 6762 | 13.9 |
| 6763 | 14 |
| 6764 | 13.1 |
| 6765 | 13.5 |
| 6766 | 14.2 |
| 6767 | 14.4 |
| 6768 | 15.1 |
| 6769 | 15.1 |
| 6770 | 15.3 |
| 6771 | 15.5 |
| 6772 | 15.2 |
| 6773 | 14.7 |
| 6774 | 14.1 |
| 6775 | 13.7 |
| 6776 | 13.7 |
| 6777 | 13.5 |
| 6778 | 13.2 |
| 6779 | 12.8 |
| 6780 | 12.8 |
| 6781 | 12.8 |
| 6782 | 12.6 |
| 6783 | 12.5 |
| 6784 | 12.4 |
| 6785 | 12.3 |
| 6786 | 12.3 |
| 6787 | 12.1 |
| 6788 | 12 |
| 6789 | 12.3 |
| 6790 | 13.1 |
| 6791 | 14.2 |
| 6792 | 16.3 |
| 6793 | 16.9 |
| 6794 | 16.8 |
| 6795 | 16.9 |
| 6796 | 16.7 |
| 6797 | 16.3 |
| 6798 | 15 |
| 6799 | 13.7 |
| 6800 | 13.1 |
| 6801 | 12.8 |
| 6802 | 12.7 |
| 6803 | 13.1 |
| 6804 | 13.2 |
| 6805 | 13 |
| 6806 | 12.6 |
| 6807 | 12.4 |
| 6808 | 12.2 |
| 6809 | 12.3 |
| 6810 | 13.8 |
| 6811 | 14 |
| 6812 | 14 |
| 6813 | 14.3 |
| 6814 | 14.2 |
| 6815 | 14.5 |
| 6816 | 17.1 |
| 6817 | 18.1 |
| 6818 | 18.6 |
| 6819 | 19 |
| 6820 | 19.2 |
| 6821 | 19.1 |
| 6822 | 18.9 |
| 6823 | 18.2 |
| 6824 | 15.7 |
| 6825 | 15.3 |
| 6826 | 15.7 |
| 6827 | 16.3 |
| 6828 | 16.3 |
| 6829 | 16 |
| 6830 | 15.8 |
| 6831 | 15.6 |
| 6832 | 15.3 |
| 6833 | 15.4 |
| 6834 | 15.8 |
| 6835 | 14.9 |
| 6836 | 15.3 |
| 6837 | 15 |
| 6838 | 15.8 |
| 6839 | 16.6 |
| 6840 | 17.8 |
| 6841 | 18.8 |
| 6842 | 19.5 |
| 6843 | 19.6 |
| 6844 | 19.1 |
| 6845 | 18.9 |
| 6846 | 18.3 |
| 6847 | 17.6 |
| 6848 | 16.1 |
| 6849 | 15.9 |
| 6850 | 17.1 |
| 6851 | 16.4 |
| 6852 | 15.8 |
| 6853 | 15.9 |
| 6854 | 16.4 |
| 6855 | 16.3 |
| 6856 | 15.9 |
| 6857 | 15.6 |
| 6858 | 15.6 |
| 6859 | 15.4 |
| 6860 | 15.5 |
| 6861 | 15.2 |
| 6862 | 14.8 |
| 6863 | 14.4 |
| 6864 | 15.8 |
| 6865 | 16 |
| 6866 | 16.2 |
| 6867 | 16.6 |
| 6868 | 16.1 |
| 6869 | 15.1 |
| 6870 | 14.3 |
| 6871 | 12.7 |
| 6872 | 10.9 |
| 6873 | 10 |
| 6874 | 10 |
| 6875 | 9.9 |
| 6876 | 10.1 |
| 6877 | 10.2 |
| 6878 | 10 |
| 6879 | 9.3 |
| 6880 | 9 |
| 6881 | 8.5 |
| 6882 | 8.1 |
| 6883 | 8 |
| 6884 | 7.8 |
| 6885 | 8.5 |
| 6886 | 9.8 |
| 6887 | 10.8 |
| 6888 | 10.6 |
| 6889 | 11.3 |
| 6890 | 11.9 |
| 6891 | 12 |
| 6892 | 11.8 |
| 6893 | 11.5 |
| 6894 | 10.8 |
| 6895 | 10.3 |
| 6896 | 9.9 |
| 6897 | 9.5 |
| 6898 | 9.2 |
| 6899 | 9 |
| 6900 | 8.7 |
| 6901 | 8.4 |
| 6902 | 8 |
| 6903 | 8.1 |
| 6904 | 8.1 |
| 6905 | 7.2 |
| 6906 | 6.2 |
| 6907 | 6.6 |
| 6908 | 7.4 |
| 6909 | 8.2 |
| 6910 | 9.3 |
| 6911 | 9.7 |
| 6912 | 14 |
| 6913 | 14.8 |
| 6914 | 15.2 |
| 6915 | 15.2 |
| 6916 | 15 |
| 6917 | 15 |
| 6918 | 15 |
| 6919 | 13.3 |
| 6920 | 14 |
| 6921 | 14.3 |
| 6922 | 13.6 |
| 6923 | 14.9 |
| 6924 | 14.4 |
| 6925 | 13.7 |
| 6926 | 14.4 |
| 6927 | 13.8 |
| 6928 | 13.6 |
| 6929 | 14.4 |
| 6930 | 14.1 |
| 6931 | 14.2 |
| 6932 | 13.8 |
| 6933 | 13.2 |
| 6934 | 13.2 |
| 6935 | 14.2 |
| 6936 | 14 |
| 6937 | 15 |
| 6938 | 15.7 |
| 6939 | 16 |
| 6940 | 15.7 |
| 6941 | 14.9 |
| 6942 | 14 |
| 6943 | 13.3 |
| 6944 | 13.2 |
| 6945 | 13.3 |
| 6946 | 13.6 |
| 6947 | 13.8 |
| 6948 | 14 |
| 6949 | 14.3 |
| 6950 | 14.6 |
| 6951 | 15.1 |
| 6952 | 15.7 |
| 6953 | 15.7 |
| 6954 | 15.4 |
| 6955 | 15.4 |
| 6956 | 15.2 |
| 6957 | 14.7 |
| 6958 | 14.3 |
| 6959 | 15 |
| 6960 | 15.9 |
| 6961 | 16.9 |
| 6962 | 17.5 |
| 6963 | 17.3 |
| 6964 | 17.3 |
| 6965 | 16.3 |
| 6966 | 15.4 |
| 6967 | 15.2 |
| 6968 | 14.3 |
| 6969 | 15 |
| 6970 | 15.8 |
| 6971 | 16 |
| 6972 | 15.8 |
| 6973 | 15.5 |
| 6974 | 15.2 |
| 6975 | 15.3 |
| 6976 | 15.5 |
| 6977 | 15.7 |
| 6978 | 15.6 |
| 6979 | 15.3 |
| 6980 | 15.2 |
| 6981 | 14.6 |
| 6982 | 15.4 |
| 6983 | 16.5 |
| 6984 | 17.7 |
| 6985 | 17.9 |
| 6986 | 18.6 |
| 6987 | 18.9 |
| 6988 | 18.9 |
| 6989 | 18.1 |
| 6990 | 16.1 |
| 6991 | 15.3 |
| 6992 | 15.5 |
| 6993 | 15.8 |
| 6994 | 16 |
| 6995 | 15.5 |
| 6996 | 16 |
| 6997 | 15.9 |
| 6998 | 15.7 |
| 6999 | 15.8 |
| 7000 | 14.5 |
| 7001 | 14.7 |
| 7002 | 14.6 |
| 7003 | 14.2 |
| 7004 | 14.1 |
| 7005 | 13.8 |
| 7006 | 13.4 |
| 7007 | 13.9 |
| 7008 | 13.5 |
| 7009 | 13 |
| 7010 | 13.5 |
| 7011 | 15.4 |
| 7012 | 15.5 |
| 7013 | 14.7 |
| 7014 | 14.4 |
| 7015 | 14 |
| 7016 | 12.9 |
| 7017 | 12.5 |
| 7018 | 12.2 |
| 7019 | 12 |
| 7020 | 11.5 |
| 7021 | 11 |
| 7022 | 10.5 |
| 7023 | 10 |
| 7024 | 9.4 |
| 7025 | 8.9 |
| 7026 | 8.4 |
| 7027 | 8 |
| 7028 | 7.5 |
| 7029 | 7.7 |
| 7030 | 8.6 |
| 7031 | 9.5 |
| 7032 | 9.6 |
| 7033 | 9.9 |
| 7034 | 10.3 |
| 7035 | 10.2 |
| 7036 | 10 |
| 7037 | 9.4 |
| 7038 | 8.3 |
| 7039 | 7.6 |
| 7040 | 7.2 |
| 7041 | 6.7 |
| 7042 | 6 |
| 7043 | 5.6 |
| 7044 | 5.5 |
| 7045 | 5.5 |
| 7046 | 5.4 |
| 7047 | 5.3 |
| 7048 | 5.2 |
| 7049 | 5.1 |
| 7050 | 5.3 |
| 7051 | 5.7 |
| 7052 | 5.9 |
| 7053 | 6.2 |
| 7054 | 7.4 |
| 7055 | 8.6 |
| 7056 | 12 |
| 7057 | 12.1 |
| 7058 | 12.3 |
| 7059 | 12.9 |
| 7060 | 12.6 |
| 7061 | 12.5 |
| 7062 | 12.4 |
| 7063 | 12.3 |
| 7064 | 12.3 |
| 7065 | 12.1 |
| 7066 | 12.1 |
| 7067 | 12.1 |
| 7068 | 12 |
| 7069 | 12 |
| 7070 | 11.8 |
| 7071 | 11.9 |
| 7072 | 11.9 |
| 7073 | 11.8 |
| 7074 | 11.1 |
| 7075 | 10.4 |
| 7076 | 9.8 |
| 7077 | 9.9 |
| 7078 | 10.4 |
| 7079 | 10.8 |
| 7080 | 7.2 |
| 7081 | 7.3 |
| 7082 | 7.2 |
| 7083 | 8.3 |
| 7084 | 8.8 |
| 7085 | 8.6 |
| 7086 | 7.6 |
| 7087 | 7.5 |
| 7088 | 7.7 |
| 7089 | 7.7 |
| 7090 | 7.6 |
| 7091 | 7.5 |
| 7092 | 8.1 |
| 7093 | 8.3 |
| 7094 | 8.4 |
| 7095 | 6.8 |
| 7096 | 6.5 |
| 7097 | 7.7 |
| 7098 | 7.1 |
| 7099 | 6.9 |
| 7100 | 7.2 |
| 7101 | 7.2 |
| 7102 | 7.8 |
| 7103 | 8.7 |
| 7104 | 9.2 |
| 7105 | 9.6 |
| 7106 | 9.3 |
| 7107 | 9 |
| 7108 | 9.1 |
| 7109 | 8.6 |
| 7110 | 7.8 |
| 7111 | 8 |
| 7112 | 7.7 |
| 7113 | 7.7 |
| 7114 | 7.8 |
| 7115 | 7.4 |
| 7116 | 7.2 |
| 7117 | 7.6 |
| 7118 | 7.8 |
| 7119 | 7.2 |
| 7120 | 7.1 |
| 7121 | 7.3 |
| 7122 | 6.7 |
| 7123 | 6 |
| 7124 | 5.2 |
| 7125 | 5.2 |
| 7126 | 5.4 |
| 7127 | 5.5 |
| 7128 | 9 |
| 7129 | 9.4 |
| 7130 | 9.7 |
| 7131 | 9.9 |
| 7132 | 9.8 |
| 7133 | 9.5 |
| 7134 | 9.1 |
| 7135 | 8.2 |
| 7136 | 7.9 |
| 7137 | 7.9 |
| 7138 | 8.2 |
| 7139 | 8.8 |
| 7140 | 9.2 |
| 7141 | 9.1 |
| 7142 | 8.4 |
| 7143 | 8.1 |
| 7144 | 8.8 |
| 7145 | 8.8 |
| 7146 | 9.1 |
| 7147 | 7.7 |
| 7148 | 7.6 |
| 7149 | 7.7 |
| 7150 | 8.3 |
| 7151 | 8.9 |
| 7152 | 8.8 |
| 7153 | 9.3 |
| 7154 | 10 |
| 7155 | 9.9 |
| 7156 | 9.6 |
| 7157 | 9.3 |
| 7158 | 9.2 |
| 7159 | 9 |
| 7160 | 8.6 |
| 7161 | 8.3 |
| 7162 | 8.7 |
| 7163 | 8.5 |
| 7164 | 8.7 |
| 7165 | 8.9 |
| 7166 | 9.1 |
| 7167 | 8.6 |
| 7168 | 9.6 |
| 7169 | 9.2 |
| 7170 | 9.2 |
| 7171 | 8.9 |
| 7172 | 8.9 |
| 7173 | 9 |
| 7174 | 9.4 |
| 7175 | 10.2 |
| 7176 | 10.9 |
| 7177 | 11.5 |
| 7178 | 11.6 |
| 7179 | 11.3 |
| 7180 | 11.3 |
| 7181 | 10.9 |
| 7182 | 10.5 |
| 7183 | 10.8 |
| 7184 | 10.1 |
| 7185 | 10.4 |
| 7186 | 10.4 |
| 7187 | 10.3 |
| 7188 | 10.3 |
| 7189 | 10.3 |
| 7190 | 10.5 |
| 7191 | 10.6 |
| 7192 | 10.6 |
| 7193 | 10.3 |
| 7194 | 10.2 |
| 7195 | 10.2 |
| 7196 | 10.1 |
| 7197 | 10.2 |
| 7198 | 10.4 |
| 7199 | 10.5 |
| 7200 | 10.2 |
| 7201 | 11.2 |
| 7202 | 11.3 |
| 7203 | 11 |
| 7204 | 11.3 |
| 7205 | 11.3 |
| 7206 | 11.1 |
| 7207 | 10.6 |
| 7208 | 10 |
| 7209 | 10 |
| 7210 | 9.9 |
| 7211 | 9.9 |
| 7212 | 9.8 |
| 7213 | 9.8 |
| 7214 | 10.2 |
| 7215 | 9.9 |
| 7216 | 9.9 |
| 7217 | 9.7 |
| 7218 | 9.7 |
| 7219 | 9.5 |
| 7220 | 9.5 |
| 7221 | 9.9 |
| 7222 | 9.7 |
| 7223 | 10.1 |
| 7224 | 10 |
| 7225 | 9.9 |
| 7226 | 10.2 |
| 7227 | 10.9 |
| 7228 | 11.2 |
| 7229 | 10.9 |
| 7230 | 10.6 |
| 7231 | 10.8 |
| 7232 | 10.9 |
| 7233 | 11.2 |
| 7234 | 11.3 |
| 7235 | 11.5 |
| 7236 | 11.6 |
| 7237 | 11.7 |
| 7238 | 11.5 |
| 7239 | 11.5 |
| 7240 | 11.5 |
| 7241 | 11.6 |
| 7242 | 11.6 |
| 7243 | 11.3 |
| 7244 | 11.2 |
| 7245 | 11.1 |
| 7246 | 10.9 |
| 7247 | 10.9 |
| 7248 | 13.5 |
| 7249 | 14 |
| 7250 | 14.3 |
| 7251 | 14.5 |
| 7252 | 14.4 |
| 7253 | 14 |
| 7254 | 12.5 |
| 7255 | 11.4 |
| 7256 | 11.7 |
| 7257 | 12.5 |
| 7258 | 12.7 |
| 7259 | 12.9 |
| 7260 | 12.9 |
| 7261 | 12.8 |
| 7262 | 12.9 |
| 7263 | 13 |
| 7264 | 12.9 |
| 7265 | 12.5 |
| 7266 | 12.1 |
| 7267 | 12.2 |
| 7268 | 12.1 |
| 7269 | 11.9 |
| 7270 | 11.8 |
| 7271 | 11.6 |
| 7272 | 11.7 |
| 7273 | 12 |
| 7274 | 12.2 |
| 7275 | 12.3 |
| 7276 | 12.2 |
| 7277 | 12.3 |
| 7278 | 12.4 |
| 7279 | 12.5 |
| 7280 | 12.6 |
| 7281 | 12.7 |
| 7282 | 12.7 |
| 7283 | 12.7 |
| 7284 | 12.8 |
| 7285 | 12.8 |
| 7286 | 12.4 |
| 7287 | 12.1 |
| 7288 | 12.1 |
| 7289 | 12.1 |
| 7290 | 12 |
| 7291 | 12 |
| 7292 | 11.9 |
| 7293 | 12 |
| 7294 | 12.1 |
| 7295 | 12.5 |
| 7296 | 13.2 |
| 7297 | 13.3 |
| 7298 | 13.4 |
| 7299 | 13.8 |
| 7300 | 13.4 |
| 7301 | 12.6 |
| 7302 | 10.8 |
| 7303 | 10 |
| 7304 | 9.7 |
| 7305 | 9.4 |
| 7306 | 9 |
| 7307 | 8.7 |
| 7308 | 8.6 |
| 7309 | 8.7 |
| 7310 | 8.8 |
| 7311 | 8.5 |
| 7312 | 8.2 |
| 7313 | 8 |
| 7314 | 7.7 |
| 7315 | 7.6 |
| 7316 | 7.1 |
| 7317 | 7.1 |
| 7318 | 7.7 |
| 7319 | 8.8 |
| 7320 | 9.2 |
| 7321 | 9.7 |
| 7322 | 10.2 |
| 7323 | 10.5 |
| 7324 | 10.2 |
| 7325 | 9.6 |
| 7326 | 9 |
| 7327 | 8.6 |
| 7328 | 8.6 |
| 7329 | 8.7 |
| 7330 | 8.7 |
| 7331 | 8.8 |
| 7332 | 8.7 |
| 7333 | 8.6 |
| 7334 | 9 |
| 7335 | 9.1 |
| 7336 | 9.3 |
| 7337 | 9.4 |
| 7338 | 9.1 |
| 7339 | 9.4 |
| 7340 | 9.4 |
| 7341 | 9.5 |
| 7342 | 9.4 |
| 7343 | 9.8 |
| 7344 | 10 |
| 7345 | 10.6 |
| 7346 | 11.1 |
| 7347 | 11.5 |
| 7348 | 11.3 |
| 7349 | 10.4 |
| 7350 | 10 |
| 7351 | 9.8 |
| 7352 | 9.5 |
| 7353 | 9.6 |
| 7354 | 10 |
| 7355 | 9.9 |
| 7356 | 9.6 |
| 7357 | 9.4 |
| 7358 | 9.3 |
| 7359 | 9.5 |
| 7360 | 9.7 |
| 7361 | 9.8 |
| 7362 | 9.9 |
| 7363 | 9.7 |
| 7364 | 9.6 |
| 7365 | 9.6 |
| 7366 | 9.1 |
| 7367 | 9.5 |
| 7368 | 10.4 |
| 7369 | 11.3 |
| 7370 | 12.1 |
| 7371 | 12.6 |
| 7372 | 12.6 |
| 7373 | 12.4 |
| 7374 | 11.8 |
| 7375 | 11.2 |
| 7376 | 10.8 |
| 7377 | 10 |
| 7378 | 10 |
| 7379 | 9.9 |
| 7380 | 9.9 |
| 7381 | 10 |
| 7382 | 10.1 |
| 7383 | 10 |
| 7384 | 9.9 |
| 7385 | 9.9 |
| 7386 | 10 |
| 7387 | 10.3 |
| 7388 | 10.4 |
| 7389 | 10.4 |
| 7390 | 10.4 |
| 7391 | 11.3 |
| 7392 | 11.3 |
| 7393 | 12.1 |
| 7394 | 12.6 |
| 7395 | 13 |
| 7396 | 13.2 |
| 7397 | 12.9 |
| 7398 | 12.2 |
| 7399 | 11.7 |
| 7400 | 11.1 |
| 7401 | 11.1 |
| 7402 | 11.3 |
| 7403 | 11.3 |
| 7404 | 11.2 |
| 7405 | 11 |
| 7406 | 10.8 |
| 7407 | 10.6 |
| 7408 | 10.3 |
| 7409 | 10.2 |
| 7410 | 10.1 |
| 7411 | 10 |
| 7412 | 9.8 |
| 7413 | 9.9 |
| 7414 | 10.2 |
| 7415 | 10.6 |
| 7416 | 12 |
| 7417 | 12.8 |
| 7418 | 13.3 |
| 7419 | 13.7 |
| 7420 | 13.7 |
| 7421 | 13.6 |
| 7422 | 12.7 |
| 7423 | 12.1 |
| 7424 | 12 |
| 7425 | 11.6 |
| 7426 | 11.5 |
| 7427 | 11.6 |
| 7428 | 11.5 |
| 7429 | 11.4 |
| 7430 | 11.2 |
| 7431 | 11.1 |
| 7432 | 10.8 |
| 7433 | 10.7 |
| 7434 | 10.7 |
| 7435 | 10.6 |
| 7436 | 10.6 |
| 7437 | 10.6 |
| 7438 | 10.9 |
| 7439 | 11.4 |
| 7440 | 13.5 |
| 7441 | 14.2 |
| 7442 | 14.6 |
| 7443 | 14.5 |
| 7444 | 13.8 |
| 7445 | 13.3 |
| 7446 | 12.3 |
| 7447 | 11.3 |
| 7448 | 10.7 |
| 7449 | 10.9 |
| 7450 | 11.1 |
| 7451 | 10.9 |
| 7452 | 10.5 |
| 7453 | 10.2 |
| 7454 | 9.9 |
| 7455 | 9.5 |
| 7456 | 9.1 |
| 7457 | 9.1 |
| 7458 | 9.2 |
| 7459 | 9.1 |
| 7460 | 8.5 |
| 7461 | 8.1 |
| 7462 | 8.2 |
| 7463 | 9 |
| 7464 | 10.7 |
| 7465 | 11 |
| 7466 | 10.8 |
| 7467 | 11 |
| 7468 | 10.6 |
| 7469 | 10.2 |
| 7470 | 9.9 |
| 7471 | 9.7 |
| 7472 | 9.9 |
| 7473 | 8.9 |
| 7474 | 8.8 |
| 7475 | 8.6 |
| 7476 | 8.4 |
| 7477 | 8.3 |
| 7478 | 8 |
| 7479 | 8 |
| 7480 | 8.3 |
| 7481 | 8.5 |
| 7482 | 8.8 |
| 7483 | 9 |
| 7484 | 9.2 |
| 7485 | 9.3 |
| 7486 | 9.5 |
| 7487 | 10 |
| 7488 | 12 |
| 7489 | 12.7 |
| 7490 | 13.1 |
| 7491 | 13.3 |
| 7492 | 13.3 |
| 7493 | 13.1 |
| 7494 | 12.5 |
| 7495 | 11.8 |
| 7496 | 11.5 |
| 7497 | 11.2 |
| 7498 | 11 |
| 7499 | 10.8 |
| 7500 | 10.6 |
| 7501 | 10.3 |
| 7502 | 10 |
| 7503 | 9.5 |
| 7504 | 9.1 |
| 7505 | 8.9 |
| 7506 | 8.3 |
| 7507 | 8.2 |
| 7508 | 8.5 |
| 7509 | 8.5 |
| 7510 | 8.5 |
| 7511 | 9 |
| 7512 | 10.7 |
| 7513 | 11.6 |
| 7514 | 12 |
| 7515 | 12.2 |
| 7516 | 12.2 |
| 7517 | 12 |
| 7518 | 11 |
| 7519 | 9.8 |
| 7520 | 9.5 |
| 7521 | 9.8 |
| 7522 | 10.1 |
| 7523 | 10.4 |
| 7524 | 10.3 |
| 7525 | 10.2 |
| 7526 | 10.2 |
| 7527 | 9.7 |
| 7528 | 9.6 |
| 7529 | 9.4 |
| 7530 | 9.4 |
| 7531 | 9.1 |
| 7532 | 9 |
| 7533 | 9 |
| 7534 | 9 |
| 7535 | 9.6 |
| 7536 | 11.6 |
| 7537 | 12 |
| 7538 | 11.9 |
| 7539 | 11.6 |
| 7540 | 11.5 |
| 7541 | 11.4 |
| 7542 | 10.8 |
| 7543 | 10.1 |
| 7544 | 9.8 |
| 7545 | 9.9 |
| 7546 | 9.9 |
| 7547 | 10.1 |
| 7548 | 10.5 |
| 7549 | 9.7 |
| 7550 | 9.8 |
| 7551 | 10.1 |
| 7552 | 10.1 |
| 7553 | 10.2 |
| 7554 | 10.1 |
| 7555 | 9.9 |
| 7556 | 9.9 |
| 7557 | 9.9 |
| 7558 | 10.1 |
| 7559 | 10.9 |
| 7560 | 12.9 |
| 7561 | 14 |
| 7562 | 14.6 |
| 7563 | 15 |
| 7564 | 14.9 |
| 7565 | 14.4 |
| 7566 | 13.4 |
| 7567 | 12.1 |
| 7568 | 11.4 |
| 7569 | 10.9 |
| 7570 | 10.8 |
| 7571 | 10.6 |
| 7572 | 10.6 |
| 7573 | 10.3 |
| 7574 | 10.1 |
| 7575 | 9.6 |
| 7576 | 9.4 |
| 7577 | 9.1 |
| 7578 | 9 |
| 7579 | 8.5 |
| 7580 | 8.1 |
| 7581 | 8.2 |
| 7582 | 8.5 |
| 7583 | 9.1 |
| 7584 | 11.6 |
| 7585 | 12.1 |
| 7586 | 12.3 |
| 7587 | 12.2 |
| 7588 | 11.6 |
| 7589 | 11 |
| 7590 | 10.2 |
| 7591 | 9.9 |
| 7592 | 9.8 |
| 7593 | 9.6 |
| 7594 | 9.5 |
| 7595 | 9.3 |
| 7596 | 8.9 |
| 7597 | 8.8 |
| 7598 | 9.1 |
| 7599 | 9.5 |
| 7600 | 9.3 |
| 7601 | 9.4 |
| 7602 | 9.1 |
| 7603 | 8.9 |
| 7604 | 8.9 |
| 7605 | 8.5 |
| 7606 | 8.5 |
| 7607 | 9 |
| 7608 | 10 |
| 7609 | 10.4 |
| 7610 | 9.8 |
| 7611 | 10.3 |
| 7612 | 10.1 |
| 7613 | 10 |
| 7614 | 9.5 |
| 7615 | 9.2 |
| 7616 | 8.9 |
| 7617 | 8.7 |
| 7618 | 8.1 |
| 7619 | 7.7 |
| 7620 | 7.3 |
| 7621 | 7.9 |
| 7622 | 8.3 |
| 7623 | 7.6 |
| 7624 | 7.4 |
| 7625 | 7.2 |
| 7626 | 7.4 |
| 7627 | 6.8 |
| 7628 | 6.2 |
| 7629 | 6.3 |
| 7630 | 6.9 |
| 7631 | 7.7 |
| 7632 | 7.7 |
| 7633 | 8.2 |
| 7634 | 8.5 |
| 7635 | 8.8 |
| 7636 | 7.9 |
| 7637 | 7.6 |
| 7638 | 7.4 |
| 7639 | 7.2 |
| 7640 | 6.8 |
| 7641 | 6.2 |
| 7642 | 6.2 |
| 7643 | 5.8 |
| 7644 | 5.1 |
| 7645 | 5 |
| 7646 | 4.9 |
| 7647 | 4.5 |
| 7648 | 4.2 |
| 7649 | 4.2 |
| 7650 | 4.2 |
| 7651 | 4.3 |
| 7652 | 4.4 |
| 7653 | 4.5 |
| 7654 | 4.9 |
| 7655 | 5.6 |
| 7656 | 5.7 |
| 7657 | 6.2 |
| 7658 | 6.6 |
| 7659 | 6.7 |
| 7660 | 6.6 |
| 7661 | 6.2 |
| 7662 | 5.8 |
| 7663 | 5.4 |
| 7664 | 4.6 |
| 7665 | 4.5 |
| 7666 | 4.6 |
| 7667 | 4.5 |
| 7668 | 4 |
| 7669 | 3.7 |
| 7670 | 3.7 |
| 7671 | 3.5 |
| 7672 | 3.1 |
| 7673 | 2.8 |
| 7674 | 2.6 |
| 7675 | 2.5 |
| 7676 | 2.3 |
| 7677 | 2.6 |
| 7678 | 2.8 |
| 7679 | 3.4 |
| 7680 | 6.7 |
| 7681 | 7.6 |
| 7682 | 8.3 |
| 7683 | 7.9 |
| 7684 | 7.4 |
| 7685 | 6.5 |
| 7686 | 5.9 |
| 7687 | 5.7 |
| 7688 | 5.6 |
| 7689 | 5.3 |
| 7690 | 5.4 |
| 7691 | 5.5 |
| 7692 | 5.5 |
| 7693 | 5.4 |
| 7694 | 5.1 |
| 7695 | 5 |
| 7696 | 5.2 |
| 7697 | 5.4 |
| 7698 | 5.5 |
| 7699 | 5.3 |
| 7700 | 5.8 |
| 7701 | 6.2 |
| 7702 | 6.3 |
| 7703 | 7.1 |
| 7704 | 9 |
| 7705 | 9.4 |
| 7706 | 8.7 |
| 7707 | 8.8 |
| 7708 | 8.4 |
| 7709 | 8.3 |
| 7710 | 8.3 |
| 7711 | 8.7 |
| 7712 | 8.2 |
| 7713 | 8.2 |
| 7714 | 8.5 |
| 7715 | 8.7 |
| 7716 | 9.1 |
| 7717 | 9.3 |
| 7718 | 9.7 |
| 7719 | 8.9 |
| 7720 | 7.7 |
| 7721 | 7.4 |
| 7722 | 8 |
| 7723 | 8.5 |
| 7724 | 7.9 |
| 7725 | 7.9 |
| 7726 | 8.9 |
| 7727 | 9.5 |
| 7728 | 4.7 |
| 7729 | 5.6 |
| 7730 | 6.6 |
| 7731 | 6.2 |
| 7732 | 6.2 |
| 7733 | 5.4 |
| 7734 | 5.2 |
| 7735 | 5.4 |
| 7736 | 5.4 |
| 7737 | 5.1 |
| 7738 | 5.3 |
| 7739 | 5.8 |
| 7740 | 5.8 |
| 7741 | 5.7 |
| 7742 | 5.4 |
| 7743 | 5.3 |
| 7744 | 5.1 |
| 7745 | 5 |
| 7746 | 5.5 |
| 7747 | 7 |
| 7748 | 6.7 |
| 7749 | 6 |
| 7750 | 6.9 |
| 7751 | 8.2 |
| 7752 | 4.2 |
| 7753 | 5.7 |
| 7754 | 5.7 |
| 7755 | 5.4 |
| 7756 | 5.6 |
| 7757 | 5.2 |
| 7758 | 5.1 |
| 7759 | 4.9 |
| 7760 | 5.7 |
| 7761 | 6.4 |
| 7762 | 5.2 |
| 7763 | 6.3 |
| 7764 | 6.6 |
| 7765 | 6.4 |
| 7766 | 6.5 |
| 7767 | 6.9 |
| 7768 | 2.3 |
| 7769 | 2.1 |
| 7770 | 3.8 |
| 7771 | 4.9 |
| 7772 | 5.4 |
| 7773 | 6.3 |
| 7774 | 6.2 |
| 7775 | 6.3 |
| 7776 | 3.4 |
| 7777 | 4.2 |
| 7778 | 3.5 |
| 7779 | 3.8 |
| 7780 | 4.3 |
| 7781 | 4.3 |
| 7782 | 4.1 |
| 7783 | 3.8 |
| 7784 | 3.5 |
| 7785 | 3.2 |
| 7786 | 3.3 |
| 7787 | 3.9 |
| 7788 | 4.6 |
| 7789 | 4.9 |
| 7790 | 3.6 |
| 7791 | 3.2 |
| 7792 | 3.5 |
| 7793 | 3.4 |
| 7794 | 3.5 |
| 7795 | 3.4 |
| 7796 | 2.7 |
| 7797 | 2.3 |
| 7798 | 2.2 |
| 7799 | 3 |
| 7800 | 5.1 |
| 7801 | 5.8 |
| 7802 | 6.3 |
| 7803 | 6.7 |
| 7804 | 6.7 |
| 7805 | 6.6 |
| 7806 | 6.6 |
| 7807 | 6.6 |
| 7808 | 6.3 |
| 7809 | 5.6 |
| 7810 | 6.8 |
| 7811 | 6.8 |
| 7812 | 6.7 |
| 7813 | 7.2 |
| 7814 | 7.6 |
| 7815 | 8.2 |
| 7816 | 8.6 |
| 7817 | 9.1 |
| 7818 | 9.5 |
| 7819 | 9.4 |
| 7820 | 9.3 |
| 7821 | 9.5 |
| 7822 | 10.1 |
| 7823 | 10.6 |
| 7824 | 9.7 |
| 7825 | 9.9 |
| 7826 | 10 |
| 7827 | 10.1 |
| 7828 | 10.2 |
| 7829 | 10.5 |
| 7830 | 10.9 |
| 7831 | 11.2 |
| 7832 | 10.9 |
| 7833 | 9 |
| 7834 | 8.8 |
| 7835 | 8.5 |
| 7836 | 8.5 |
| 7837 | 8.8 |
| 7838 | 9 |
| 7839 | 9.4 |
| 7840 | 9.6 |
| 7841 | 9.8 |
| 7842 | 9.8 |
| 7843 | 9.7 |
| 7844 | 9.9 |
| 7845 | 10.1 |
| 7846 | 10.3 |
| 7847 | 10.5 |
| 7848 | 11.4 |
| 7849 | 11.5 |
| 7850 | 11.7 |
| 7851 | 11.8 |
| 7852 | 11.9 |
| 7853 | 12 |
| 7854 | 12.1 |
| 7855 | 12.3 |
| 7856 | 12.4 |
| 7857 | 12.5 |
| 7858 | 12.5 |
| 7859 | 12.4 |
| 7860 | 12.3 |
| 7861 | 12.1 |
| 7862 | 11.9 |
| 7863 | 11.7 |
| 7864 | 11.7 |
| 7865 | 11.7 |
| 7866 | 11.6 |
| 7867 | 11.6 |
| 7868 | 11.5 |
| 7869 | 11.6 |
| 7870 | 11.6 |
| 7871 | 11.9 |
| 7872 | 12.3 |
| 7873 | 12.4 |
| 7874 | 12.6 |
| 7875 | 12.7 |
| 7876 | 12.8 |
| 7877 | 12.7 |
| 7878 | 12.5 |
| 7879 | 12.3 |
| 7880 | 12.3 |
| 7881 | 12.3 |
| 7882 | 12.4 |
| 7883 | 12.1 |
| 7884 | 12 |
| 7885 | 12.1 |
| 7886 | 12.2 |
| 7887 | 12.3 |
| 7888 | 12.4 |
| 7889 | 12.5 |
| 7890 | 12.7 |
| 7891 | 12.7 |
| 7892 | 12.6 |
| 7893 | 12.7 |
| 7894 | 12.7 |
| 7895 | 12.8 |
| 7896 | 11.4 |
| 7897 | 11.6 |
| 7898 | 12.2 |
| 7899 | 12.4 |
| 7900 | 12.4 |
| 7901 | 12.5 |
| 7902 | 12.5 |
| 7903 | 12.5 |
| 7904 | 12.4 |
| 7905 | 12.3 |
| 7906 | 12.3 |
| 7907 | 12.3 |
| 7908 | 12.3 |
| 7909 | 12.2 |
| 7910 | 12.3 |
| 7911 | 12.3 |
| 7912 | 12.4 |
| 7913 | 12.4 |
| 7914 | 12.5 |
| 7915 | 12.5 |
| 7916 | 12.5 |
| 7917 | 12.4 |
| 7918 | 12.5 |
| 7919 | 12.4 |
| 7920 | 11.8 |
| 7921 | 11.8 |
| 7922 | 11.8 |
| 7923 | 11.3 |
| 7924 | 11 |
| 7925 | 10.7 |
| 7926 | 10.5 |
| 7927 | 10.4 |
| 7928 | 10.3 |
| 7929 | 10.2 |
| 7930 | 10.2 |
| 7931 | 10.1 |
| 7932 | 10.2 |
| 7933 | 10.1 |
| 7934 | 10.1 |
| 7935 | 10.1 |
| 7936 | 10.2 |
| 7937 | 10.3 |
| 7938 | 10.3 |
| 7939 | 10.2 |
| 7940 | 10.3 |
| 7941 | 10.4 |
| 7942 | 10.3 |
| 7943 | 10.4 |
| 7944 | 8.3 |
| 7945 | 8.7 |
| 7946 | 8.7 |
| 7947 | 8.7 |
| 7948 | 8.6 |
| 7949 | 8.6 |
| 7950 | 8.7 |
| 7951 | 8.5 |
| 7952 | 8.2 |
| 7953 | 8 |
| 7954 | 7.7 |
| 7955 | 7.4 |
| 7956 | 7.1 |
| 7957 | 6.9 |
| 7958 | 6.8 |
| 7959 | 6.8 |
| 7960 | 6.9 |
| 7961 | 7.1 |
| 7962 | 7 |
| 7963 | 6.7 |
| 7964 | 6.5 |
| 7965 | 6.4 |
| 7966 | 6.4 |
| 7967 | 6.5 |
| 7968 | 8.1 |
| 7969 | 8.3 |
| 7970 | 8.1 |
| 7971 | 7.8 |
| 7972 | 7.4 |
| 7973 | 6.8 |
| 7974 | 6.2 |
| 7975 | 5.6 |
| 7976 | 5 |
| 7977 | 4.7 |
| 7978 | 4.5 |
| 7979 | 4.4 |
| 7980 | 4.1 |
| 7981 | 3.8 |
| 7982 | 3.5 |
| 7983 | 3.3 |
| 7984 | 3.3 |
| 7985 | 3.7 |
| 7986 | 3 |
| 7987 | 3 |
| 7988 | 3 |
| 7989 | 3.4 |
| 7990 | 3.9 |
| 7991 | 5 |
| 7992 | 6.5 |
| 7993 | 7.1 |
| 7994 | 7.3 |
| 7995 | 7.3 |
| 7996 | 7.3 |
| 7997 | 7.1 |
| 7998 | 6.5 |
| 7999 | 5.9 |
| 8000 | 5.7 |
| 8001 | 5.6 |
| 8002 | 5.6 |
| 8003 | 5.7 |
| 8004 | 5.7 |
| 8005 | 5.8 |
| 8006 | 5.8 |
| 8007 | 5.7 |
| 8008 | 6.2 |
| 8009 | 6.6 |
| 8010 | 6.4 |
| 8011 | 6.1 |
| 8012 | 6.5 |
| 8013 | 6.4 |
| 8014 | 6.6 |
| 8015 | 6.7 |
| 8016 | 7.5 |
| 8017 | 8.3 |
| 8018 | 8.8 |
| 8019 | 9.2 |
| 8020 | 8.9 |
| 8021 | 8.4 |
| 8022 | 8.2 |
| 8023 | 8.7 |
| 8024 | 8.8 |
| 8025 | 8.8 |
| 8026 | 8.4 |
| 8027 | 8.7 |
| 8028 | 8.4 |
| 8029 | 8.2 |
| 8030 | 7.8 |
| 8031 | 7.4 |
| 8032 | 7.7 |
| 8033 | 7.9 |
| 8034 | 8.2 |
| 8035 | 8.3 |
| 8036 | 8.4 |
| 8037 | 8.4 |
| 8038 | 8.5 |
| 8039 | 9.1 |
| 8040 | 10.7 |
| 8041 | 11.1 |
| 8042 | 11.4 |
| 8043 | 11.5 |
| 8044 | 10.7 |
| 8045 | 9.9 |
| 8046 | 9.5 |
| 8047 | 9.2 |
| 8048 | 9 |
| 8049 | 9.1 |
| 8050 | 9.2 |
| 8051 | 9.1 |
| 8052 | 9 |
| 8053 | 8.8 |
| 8054 | 8.7 |
| 8055 | 8.8 |
| 8056 | 8.7 |
| 8057 | 8.9 |
| 8058 | 9 |
| 8059 | 8.9 |
| 8060 | 8.9 |
| 8061 | 8.7 |
| 8062 | 8.1 |
| 8063 | 8.1 |
| 8064 | 8.6 |
| 8065 | 8.5 |
| 8066 | 8.9 |
| 8067 | 8.9 |
| 8068 | 8.7 |
| 8069 | 7.9 |
| 8070 | 7.2 |
| 8071 | 6 |
| 8072 | 6.6 |
| 8073 | 6.3 |
| 8074 | 6.1 |
| 8075 | 4.3 |
| 8076 | 4.5 |
| 8077 | 4.6 |
| 8078 | 4.4 |
| 8079 | 4.1 |
| 8080 | 4 |
| 8081 | 3.6 |
| 8082 | 3.6 |
| 8083 | 3.9 |
| 8084 | 3.4 |
| 8085 | 3.1 |
| 8086 | 4.1 |
| 8087 | 5.2 |
| 8088 | 4.9 |
| 8089 | 5.5 |
| 8090 | 5.9 |
| 8091 | 6.1 |
| 8092 | 5.8 |
| 8093 | 5.4 |
| 8094 | 5.5 |
| 8095 | 5.6 |
| 8096 | 5.6 |
| 8097 | 5.6 |
| 8098 | 5.9 |
| 8099 | 5.4 |
| 8100 | 4.8 |
| 8101 | 5 |
| 8102 | 4.8 |
| 8103 | 4.4 |
| 8104 | 4.3 |
| 8105 | 4.4 |
| 8106 | 4.8 |
| 8107 | 5.1 |
| 8108 | 5.8 |
| 8109 | 5.5 |
| 8110 | 5.6 |
| 8111 | 6.5 |
| 8112 | 6.5 |
| 8113 | 6.8 |
| 8114 | 7.2 |
| 8115 | 7.5 |
| 8116 | 7.5 |
| 8117 | 6.9 |
| 8118 | 6.6 |
| 8119 | 6.8 |
| 8120 | 7 |
| 8121 | 7.2 |
| 8122 | 7.3 |
| 8123 | 7.2 |
| 8124 | 6.9 |
| 8125 | 6.5 |
| 8126 | 6.4 |
| 8127 | 6.6 |
| 8128 | 6.8 |
| 8129 | 7 |
| 8130 | 7.4 |
| 8131 | 7.3 |
| 8132 | 7.1 |
| 8133 | 7.2 |
| 8134 | 7 |
| 8135 | 7.2 |
| 8136 | 8.2 |
| 8137 | 8.9 |
| 8138 | 9.3 |
| 8139 | 9.3 |
| 8140 | 8.9 |
| 8141 | 8.3 |
| 8142 | 8.2 |
| 8143 | 8.4 |
| 8144 | 8.7 |
| 8145 | 8.6 |
| 8146 | 8.5 |
| 8147 | 7.8 |
| 8148 | 8.1 |
| 8149 | 8.2 |
| 8150 | 8.1 |
| 8151 | 8.3 |
| 8152 | 8.2 |
| 8153 | 7.9 |
| 8154 | 8.1 |
| 8155 | 7.9 |
| 8156 | 7.5 |
| 8157 | 7.3 |
| 8158 | 7 |
| 8159 | 7 |
| 8160 | 8.9 |
| 8161 | 9.6 |
| 8162 | 9.9 |
| 8163 | 10 |
| 8164 | 9.9 |
| 8165 | 9.4 |
| 8166 | 8.7 |
| 8167 | 8.4 |
| 8168 | 7.9 |
| 8169 | 8.2 |
| 8170 | 8.4 |
| 8171 | 8.4 |
| 8172 | 8.5 |
| 8173 | 8.6 |
| 8174 | 8.5 |
| 8175 | 8.3 |
| 8176 | 8.3 |
| 8177 | 8.3 |
| 8178 | 8.1 |
| 8179 | 7.8 |
| 8180 | 7.7 |
| 8181 | 7.9 |
| 8182 | 8.2 |
| 8183 | 8.6 |
| 8184 | 10.6 |
| 8185 | 10.7 |
| 8186 | 11.3 |
| 8187 | 11.8 |
| 8188 | 11.7 |
| 8189 | 11.4 |
| 8190 | 11.2 |
| 8191 | 10.8 |
| 8192 | 10.7 |
| 8193 | 10.5 |
| 8194 | 10.1 |
| 8195 | 9.8 |
| 8196 | 9.5 |
| 8197 | 9.2 |
| 8198 | 9 |
| 8199 | 8.8 |
| 8200 | 8.4 |
| 8201 | 8.2 |
| 8202 | 8.2 |
| 8203 | 8.3 |
| 8204 | 8.4 |
| 8205 | 8.2 |
| 8206 | 8.2 |
| 8207 | 8.5 |
| 8208 | 11.3 |
| 8209 | 11.7 |
| 8210 | 12.2 |
| 8211 | 12.4 |
| 8212 | 12.4 |
| 8213 | 12.5 |
| 8214 | 12.4 |
| 8215 | 12.3 |
| 8216 | 12.6 |
| 8217 | 12.6 |
| 8218 | 12.5 |
| 8219 | 12.4 |
| 8220 | 12.3 |
| 8221 | 12.3 |
| 8222 | 12 |
| 8223 | 11.6 |
| 8224 | 11.3 |
| 8225 | 11.1 |
| 8226 | 10.9 |
| 8227 | 10.9 |
| 8228 | 11 |
| 8229 | 11.1 |
| 8230 | 11.3 |
| 8231 | 11.6 |
| 8232 | 11.7 |
| 8233 | 12.6 |
| 8234 | 13.1 |
| 8235 | 13.2 |
| 8236 | 13.2 |
| 8237 | 13.4 |
| 8238 | 13.5 |
| 8239 | 13.4 |
| 8240 | 13.3 |
| 8241 | 13.3 |
| 8242 | 13.3 |
| 8243 | 13.2 |
| 8244 | 12.9 |
| 8245 | 12.8 |
| 8246 | 12.7 |
| 8247 | 12.7 |
| 8248 | 12.8 |
| 8249 | 12.7 |
| 8250 | 12.5 |
| 8251 | 12.2 |
| 8252 | 11.8 |
| 8253 | 11.5 |
| 8254 | 11.3 |
| 8255 | 11.3 |
| 8256 | 10.7 |
| 8257 | 11.3 |
| 8258 | 11.8 |
| 8259 | 11.9 |
| 8260 | 11.7 |
| 8261 | 11.3 |
| 8262 | 10.7 |
| 8263 | 10.2 |
| 8264 | 10.2 |
| 8265 | 10.3 |
| 8266 | 10.3 |
| 8267 | 10.3 |
| 8268 | 10.1 |
| 8269 | 9.9 |
| 8270 | 9.8 |
| 8271 | 9.8 |
| 8272 | 9.8 |
| 8273 | 9.8 |
| 8274 | 9.7 |
| 8275 | 9.5 |
| 8276 | 9.4 |
| 8277 | 9.7 |
| 8278 | 10.1 |
| 8279 | 10 |
| 8280 | 9.5 |
| 8281 | 9.8 |
| 8282 | 10.2 |
| 8283 | 10.4 |
| 8284 | 10.2 |
| 8285 | 9.8 |
| 8286 | 9.4 |
| 8287 | 9.7 |
| 8288 | 10.2 |
| 8289 | 10 |
| 8290 | 10 |
| 8291 | 9.8 |
| 8292 | 9.4 |
| 8293 | 9.3 |
| 8294 | 9.2 |
| 8295 | 9 |
| 8296 | 8.9 |
| 8297 | 8.6 |
| 8298 | 8.6 |
| 8299 | 8.8 |
| 8300 | 8.6 |
| 8301 | 8.3 |
| 8302 | 8.5 |
| 8303 | 8.8 |
| 8304 | 9.2 |
| 8305 | 9.5 |
| 8306 | 9.6 |
| 8307 | 9.4 |
| 8308 | 9.5 |
| 8309 | 9.9 |
| 8310 | 10 |
| 8311 | 9.8 |
| 8312 | 9.8 |
| 8313 | 9.9 |
| 8314 | 9.7 |
| 8315 | 9.3 |
| 8316 | 9.1 |
| 8317 | 9 |
| 8318 | 8.8 |
| 8319 | 8.6 |
| 8320 | 8.6 |
| 8321 | 8.5 |
| 8322 | 8.2 |
| 8323 | 8 |
| 8324 | 7.9 |
| 8325 | 7.9 |
| 8326 | 8.1 |
| 8327 | 8.2 |
| 8328 | 8.6 |
| 8329 | 9.2 |
| 8330 | 9.6 |
| 8331 | 9.9 |
| 8332 | 9.9 |
| 8333 | 9.7 |
| 8334 | 9.2 |
| 8335 | 8.2 |
| 8336 | 8.2 |
| 8337 | 8.4 |
| 8338 | 8 |
| 8339 | 7.7 |
| 8340 | 7.9 |
| 8341 | 7.9 |
| 8342 | 7.6 |
| 8343 | 7.6 |
| 8344 | 7.6 |
| 8345 | 7.3 |
| 8346 | 7.2 |
| 8347 | 7.2 |
| 8348 | 7 |
| 8349 | 7.2 |
| 8350 | 7.1 |
| 8351 | 6.9 |
| 8352 | 8.1 |
| 8353 | 8.5 |
| 8354 | 8.9 |
| 8355 | 8.9 |
| 8356 | 8.7 |
| 8357 | 8.2 |
| 8358 | 7.7 |
| 8359 | 7.4 |
| 8360 | 7.5 |
| 8361 | 7.3 |
| 8362 | 6.4 |
| 8363 | 6.1 |
| 8364 | 6 |
| 8365 | 5 |
| 8366 | 4.2 |
| 8367 | 4 |
| 8368 | 3.7 |
| 8369 | 3.3 |
| 8370 | 2.8 |
| 8371 | 2.4 |
| 8372 | 2.1 |
| 8373 | 1.9 |
| 8374 | 1.9 |
| 8375 | 2.4 |
| 8376 | 3.3 |
| 8377 | 3.9 |
| 8378 | 4 |
| 8379 | 3.8 |
| 8380 | 3.8 |
| 8381 | 4 |
| 8382 | 4.6 |
| 8383 | 5.5 |
| 8384 | 5.3 |
| 8385 | 5.5 |
| 8386 | 5.8 |
| 8387 | 6.8 |
| 8388 | 7.4 |
| 8389 | 7.5 |
| 8390 | 7.8 |
| 8391 | 7.7 |
| 8392 | 7.7 |
| 8393 | 8 |
| 8394 | 8.9 |
| 8395 | 10 |
| 8396 | 10.3 |
| 8397 | 10.4 |
| 8398 | 10.5 |
| 8399 | 10.3 |
| 8400 | 7.7 |
| 8401 | 7.7 |
| 8402 | 7.8 |
| 8403 | 8.1 |
| 8404 | 8.2 |
| 8405 | 8.3 |
| 8406 | 8.3 |
| 8407 | 8.4 |
| 8408 | 8.7 |
| 8409 | 8.8 |
| 8410 | 8.8 |
| 8411 | 8.8 |
| 8412 | 9 |
| 8413 | 9 |
| 8414 | 9.3 |
| 8415 | 9.6 |
| 8416 | 9.6 |
| 8417 | 10 |
| 8418 | 10 |
| 8419 | 9.9 |
| 8420 | 9.8 |
| 8421 | 9.7 |
| 8422 | 9.8 |
| 8423 | 9.9 |